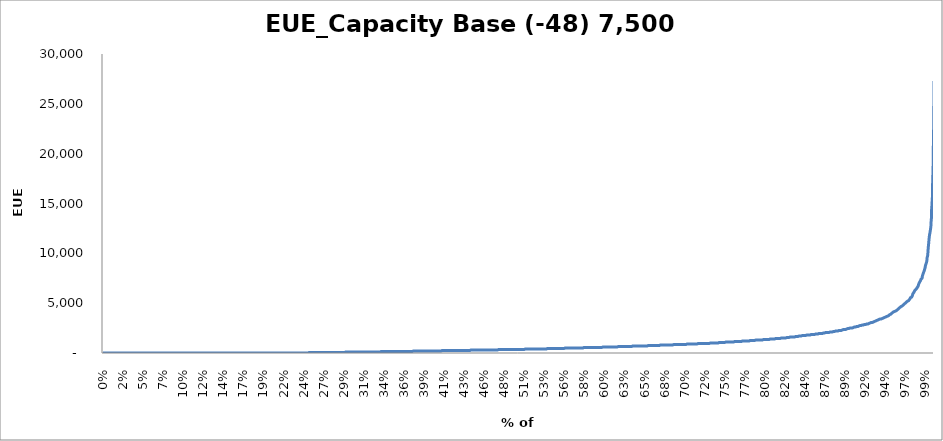
| Category | EUE_Capacity |
|---|---|
| 0.0 | 0 |
| 0.00013333333333333334 | 0 |
| 0.0002666666666666667 | 0 |
| 0.0004 | 0 |
| 0.0005333333333333334 | 0 |
| 0.0006666666666666666 | 0 |
| 0.0008 | 0 |
| 0.0009333333333333333 | 0 |
| 0.0010666666666666667 | 0 |
| 0.0012 | 0 |
| 0.0013333333333333333 | 0 |
| 0.0014666666666666667 | 0 |
| 0.0016 | 0 |
| 0.0017333333333333333 | 0 |
| 0.0018666666666666666 | 0 |
| 0.002 | 0 |
| 0.0021333333333333334 | 0 |
| 0.002266666666666667 | 0 |
| 0.0024 | 0 |
| 0.002533333333333333 | 0 |
| 0.0026666666666666666 | 0 |
| 0.0028 | 0 |
| 0.0029333333333333334 | 0 |
| 0.0030666666666666668 | 0 |
| 0.0032 | 0 |
| 0.0033333333333333335 | 0 |
| 0.0034666666666666665 | 0 |
| 0.0036 | 0 |
| 0.0037333333333333333 | 0 |
| 0.0038666666666666667 | 0 |
| 0.004 | 0 |
| 0.0041333333333333335 | 0 |
| 0.004266666666666667 | 0 |
| 0.0044 | 0 |
| 0.004533333333333334 | 0 |
| 0.004666666666666667 | 0 |
| 0.0048 | 0 |
| 0.004933333333333333 | 0 |
| 0.005066666666666666 | 0 |
| 0.0052 | 0 |
| 0.005333333333333333 | 0 |
| 0.0054666666666666665 | 0 |
| 0.0056 | 0 |
| 0.005733333333333333 | 0 |
| 0.005866666666666667 | 0 |
| 0.006 | 0 |
| 0.0061333333333333335 | 0 |
| 0.006266666666666667 | 0 |
| 0.0064 | 0 |
| 0.006533333333333334 | 0 |
| 0.006666666666666667 | 0 |
| 0.0068 | 0 |
| 0.006933333333333333 | 0 |
| 0.007066666666666666 | 0 |
| 0.0072 | 0 |
| 0.007333333333333333 | 0 |
| 0.007466666666666667 | 0 |
| 0.0076 | 0 |
| 0.007733333333333333 | 0 |
| 0.007866666666666666 | 0 |
| 0.008 | 0 |
| 0.008133333333333333 | 0 |
| 0.008266666666666667 | 0 |
| 0.0084 | 0 |
| 0.008533333333333334 | 0 |
| 0.008666666666666666 | 0 |
| 0.0088 | 0 |
| 0.008933333333333333 | 0 |
| 0.009066666666666667 | 0 |
| 0.0092 | 0 |
| 0.009333333333333334 | 0 |
| 0.009466666666666667 | 0 |
| 0.0096 | 0 |
| 0.009733333333333333 | 0 |
| 0.009866666666666666 | 0 |
| 0.01 | 0 |
| 0.010133333333333333 | 0 |
| 0.010266666666666667 | 0 |
| 0.0104 | 0 |
| 0.010533333333333334 | 0 |
| 0.010666666666666666 | 0 |
| 0.0108 | 0 |
| 0.010933333333333333 | 0 |
| 0.011066666666666667 | 0 |
| 0.0112 | 0 |
| 0.011333333333333334 | 0 |
| 0.011466666666666667 | 0 |
| 0.0116 | 0 |
| 0.011733333333333333 | 0 |
| 0.011866666666666666 | 0 |
| 0.012 | 0 |
| 0.012133333333333333 | 0 |
| 0.012266666666666667 | 0 |
| 0.0124 | 0 |
| 0.012533333333333334 | 0 |
| 0.012666666666666666 | 0 |
| 0.0128 | 0 |
| 0.012933333333333333 | 0 |
| 0.013066666666666667 | 0 |
| 0.0132 | 0 |
| 0.013333333333333334 | 0 |
| 0.013466666666666667 | 0 |
| 0.0136 | 0 |
| 0.013733333333333334 | 0 |
| 0.013866666666666666 | 0 |
| 0.014 | 0 |
| 0.014133333333333333 | 0 |
| 0.014266666666666667 | 0 |
| 0.0144 | 0 |
| 0.014533333333333334 | 0 |
| 0.014666666666666666 | 0 |
| 0.0148 | 0 |
| 0.014933333333333333 | 0 |
| 0.015066666666666667 | 0 |
| 0.0152 | 0 |
| 0.015333333333333332 | 0 |
| 0.015466666666666667 | 0 |
| 0.0156 | 0 |
| 0.015733333333333332 | 0 |
| 0.015866666666666668 | 0 |
| 0.016 | 0 |
| 0.016133333333333333 | 0 |
| 0.016266666666666665 | 0 |
| 0.0164 | 0 |
| 0.016533333333333334 | 0 |
| 0.016666666666666666 | 0 |
| 0.0168 | 0 |
| 0.016933333333333335 | 0 |
| 0.017066666666666667 | 0 |
| 0.0172 | 0 |
| 0.017333333333333333 | 0 |
| 0.017466666666666665 | 0 |
| 0.0176 | 0 |
| 0.017733333333333334 | 0 |
| 0.017866666666666666 | 0 |
| 0.018 | 0 |
| 0.018133333333333335 | 0 |
| 0.018266666666666667 | 0 |
| 0.0184 | 0 |
| 0.018533333333333332 | 0 |
| 0.018666666666666668 | 0 |
| 0.0188 | 0 |
| 0.018933333333333333 | 0 |
| 0.019066666666666666 | 0 |
| 0.0192 | 0 |
| 0.019333333333333334 | 0 |
| 0.019466666666666667 | 0 |
| 0.0196 | 0 |
| 0.019733333333333332 | 0 |
| 0.019866666666666668 | 0 |
| 0.02 | 0 |
| 0.020133333333333333 | 0 |
| 0.020266666666666665 | 0 |
| 0.0204 | 0 |
| 0.020533333333333334 | 0 |
| 0.020666666666666667 | 0 |
| 0.0208 | 0 |
| 0.020933333333333335 | 0 |
| 0.021066666666666668 | 0 |
| 0.0212 | 0 |
| 0.021333333333333333 | 0 |
| 0.021466666666666665 | 0 |
| 0.0216 | 0 |
| 0.021733333333333334 | 0 |
| 0.021866666666666666 | 0 |
| 0.022 | 0 |
| 0.022133333333333335 | 0 |
| 0.022266666666666667 | 0 |
| 0.0224 | 0 |
| 0.022533333333333332 | 0 |
| 0.02266666666666667 | 0 |
| 0.0228 | 0 |
| 0.022933333333333333 | 0 |
| 0.023066666666666666 | 0 |
| 0.0232 | 0 |
| 0.023333333333333334 | 0 |
| 0.023466666666666667 | 0 |
| 0.0236 | 0 |
| 0.023733333333333332 | 0 |
| 0.023866666666666668 | 0 |
| 0.024 | 0 |
| 0.024133333333333333 | 0 |
| 0.024266666666666666 | 0 |
| 0.0244 | 0 |
| 0.024533333333333334 | 0 |
| 0.024666666666666667 | 0 |
| 0.0248 | 0 |
| 0.02493333333333333 | 0 |
| 0.025066666666666668 | 0 |
| 0.0252 | 0 |
| 0.025333333333333333 | 0 |
| 0.025466666666666665 | 0 |
| 0.0256 | 0 |
| 0.025733333333333334 | 0 |
| 0.025866666666666666 | 0 |
| 0.026 | 0 |
| 0.026133333333333335 | 0 |
| 0.026266666666666667 | 0 |
| 0.0264 | 0 |
| 0.026533333333333332 | 0 |
| 0.02666666666666667 | 0 |
| 0.0268 | 0 |
| 0.026933333333333333 | 0 |
| 0.027066666666666666 | 0 |
| 0.0272 | 0 |
| 0.027333333333333334 | 0 |
| 0.027466666666666667 | 0 |
| 0.0276 | 0 |
| 0.027733333333333332 | 0 |
| 0.027866666666666668 | 0 |
| 0.028 | 0 |
| 0.028133333333333333 | 0 |
| 0.028266666666666666 | 0 |
| 0.0284 | 0 |
| 0.028533333333333334 | 0 |
| 0.028666666666666667 | 0 |
| 0.0288 | 0 |
| 0.028933333333333332 | 0 |
| 0.029066666666666668 | 0 |
| 0.0292 | 0 |
| 0.029333333333333333 | 0 |
| 0.029466666666666665 | 0 |
| 0.0296 | 0 |
| 0.029733333333333334 | 0 |
| 0.029866666666666666 | 0 |
| 0.03 | 0 |
| 0.030133333333333335 | 0 |
| 0.030266666666666667 | 0 |
| 0.0304 | 0 |
| 0.030533333333333332 | 0 |
| 0.030666666666666665 | 0 |
| 0.0308 | 0 |
| 0.030933333333333334 | 0 |
| 0.031066666666666666 | 0 |
| 0.0312 | 0 |
| 0.03133333333333333 | 0 |
| 0.031466666666666664 | 0 |
| 0.0316 | 0 |
| 0.031733333333333336 | 0 |
| 0.03186666666666667 | 0 |
| 0.032 | 0 |
| 0.03213333333333333 | 0 |
| 0.032266666666666666 | 0 |
| 0.0324 | 0 |
| 0.03253333333333333 | 0 |
| 0.03266666666666666 | 0 |
| 0.0328 | 0 |
| 0.032933333333333335 | 0 |
| 0.03306666666666667 | 0 |
| 0.0332 | 0 |
| 0.03333333333333333 | 0 |
| 0.033466666666666665 | 0 |
| 0.0336 | 0 |
| 0.03373333333333333 | 0 |
| 0.03386666666666667 | 0 |
| 0.034 | 0 |
| 0.034133333333333335 | 0 |
| 0.03426666666666667 | 0 |
| 0.0344 | 0 |
| 0.03453333333333333 | 0 |
| 0.034666666666666665 | 0 |
| 0.0348 | 0 |
| 0.03493333333333333 | 0 |
| 0.03506666666666667 | 0 |
| 0.0352 | 0 |
| 0.035333333333333335 | 0 |
| 0.03546666666666667 | 0 |
| 0.0356 | 0 |
| 0.03573333333333333 | 0 |
| 0.035866666666666665 | 0 |
| 0.036 | 0 |
| 0.03613333333333334 | 0 |
| 0.03626666666666667 | 0 |
| 0.0364 | 0 |
| 0.036533333333333334 | 0 |
| 0.03666666666666667 | 0 |
| 0.0368 | 0 |
| 0.03693333333333333 | 0 |
| 0.037066666666666664 | 0 |
| 0.0372 | 0 |
| 0.037333333333333336 | 0 |
| 0.03746666666666667 | 0 |
| 0.0376 | 0 |
| 0.037733333333333334 | 0 |
| 0.037866666666666667 | 0 |
| 0.038 | 0 |
| 0.03813333333333333 | 0 |
| 0.038266666666666664 | 0 |
| 0.0384 | 0 |
| 0.038533333333333336 | 0 |
| 0.03866666666666667 | 0 |
| 0.0388 | 0 |
| 0.038933333333333334 | 0 |
| 0.039066666666666666 | 0 |
| 0.0392 | 0 |
| 0.03933333333333333 | 0 |
| 0.039466666666666664 | 0 |
| 0.0396 | 0 |
| 0.039733333333333336 | 0 |
| 0.03986666666666667 | 0 |
| 0.04 | 0 |
| 0.04013333333333333 | 0 |
| 0.040266666666666666 | 0 |
| 0.0404 | 0 |
| 0.04053333333333333 | 0 |
| 0.04066666666666666 | 0 |
| 0.0408 | 0 |
| 0.040933333333333335 | 0 |
| 0.04106666666666667 | 0 |
| 0.0412 | 0 |
| 0.04133333333333333 | 0 |
| 0.041466666666666666 | 0 |
| 0.0416 | 0 |
| 0.04173333333333333 | 0 |
| 0.04186666666666667 | 0 |
| 0.042 | 0 |
| 0.042133333333333335 | 0 |
| 0.04226666666666667 | 0 |
| 0.0424 | 0 |
| 0.04253333333333333 | 0 |
| 0.042666666666666665 | 0 |
| 0.0428 | 0 |
| 0.04293333333333333 | 0 |
| 0.04306666666666667 | 0 |
| 0.0432 | 0 |
| 0.043333333333333335 | 0 |
| 0.04346666666666667 | 0 |
| 0.0436 | 0 |
| 0.04373333333333333 | 0 |
| 0.043866666666666665 | 0 |
| 0.044 | 0 |
| 0.04413333333333333 | 0 |
| 0.04426666666666667 | 0 |
| 0.0444 | 0 |
| 0.044533333333333334 | 0 |
| 0.04466666666666667 | 0 |
| 0.0448 | 0 |
| 0.04493333333333333 | 0 |
| 0.045066666666666665 | 0 |
| 0.0452 | 0 |
| 0.04533333333333334 | 0 |
| 0.04546666666666667 | 0 |
| 0.0456 | 0 |
| 0.045733333333333334 | 0 |
| 0.04586666666666667 | 0 |
| 0.046 | 0 |
| 0.04613333333333333 | 0 |
| 0.046266666666666664 | 0 |
| 0.0464 | 0 |
| 0.046533333333333336 | 0 |
| 0.04666666666666667 | 0 |
| 0.0468 | 0 |
| 0.046933333333333334 | 0 |
| 0.047066666666666666 | 0 |
| 0.0472 | 0 |
| 0.04733333333333333 | 0 |
| 0.047466666666666664 | 0 |
| 0.0476 | 0 |
| 0.047733333333333336 | 0 |
| 0.04786666666666667 | 0 |
| 0.048 | 0 |
| 0.048133333333333334 | 0 |
| 0.048266666666666666 | 0 |
| 0.0484 | 0 |
| 0.04853333333333333 | 0 |
| 0.048666666666666664 | 0 |
| 0.0488 | 0 |
| 0.048933333333333336 | 0 |
| 0.04906666666666667 | 0 |
| 0.0492 | 0 |
| 0.04933333333333333 | 0 |
| 0.049466666666666666 | 0 |
| 0.0496 | 0 |
| 0.04973333333333333 | 0 |
| 0.04986666666666666 | 0 |
| 0.05 | 0 |
| 0.050133333333333335 | 0 |
| 0.05026666666666667 | 0 |
| 0.0504 | 0 |
| 0.05053333333333333 | 0 |
| 0.050666666666666665 | 0 |
| 0.0508 | 0 |
| 0.05093333333333333 | 0 |
| 0.05106666666666667 | 0 |
| 0.0512 | 0 |
| 0.051333333333333335 | 0 |
| 0.05146666666666667 | 0 |
| 0.0516 | 0 |
| 0.05173333333333333 | 0 |
| 0.051866666666666665 | 0 |
| 0.052 | 0 |
| 0.05213333333333333 | 0 |
| 0.05226666666666667 | 0 |
| 0.0524 | 0 |
| 0.052533333333333335 | 0 |
| 0.05266666666666667 | 0 |
| 0.0528 | 0 |
| 0.05293333333333333 | 0 |
| 0.053066666666666665 | 0 |
| 0.0532 | 0 |
| 0.05333333333333334 | 0 |
| 0.05346666666666667 | 0 |
| 0.0536 | 0 |
| 0.053733333333333334 | 0 |
| 0.05386666666666667 | 0 |
| 0.054 | 0 |
| 0.05413333333333333 | 0 |
| 0.054266666666666664 | 0 |
| 0.0544 | 0 |
| 0.054533333333333336 | 0 |
| 0.05466666666666667 | 0 |
| 0.0548 | 0 |
| 0.054933333333333334 | 0 |
| 0.05506666666666667 | 0 |
| 0.0552 | 0 |
| 0.05533333333333333 | 0 |
| 0.055466666666666664 | 0 |
| 0.0556 | 0 |
| 0.055733333333333336 | 0 |
| 0.05586666666666667 | 0 |
| 0.056 | 0 |
| 0.056133333333333334 | 0 |
| 0.056266666666666666 | 0 |
| 0.0564 | 0 |
| 0.05653333333333333 | 0 |
| 0.056666666666666664 | 0 |
| 0.0568 | 0 |
| 0.056933333333333336 | 0 |
| 0.05706666666666667 | 0 |
| 0.0572 | 0 |
| 0.05733333333333333 | 0 |
| 0.057466666666666666 | 0 |
| 0.0576 | 0 |
| 0.05773333333333333 | 0 |
| 0.057866666666666663 | 0 |
| 0.058 | 0 |
| 0.058133333333333335 | 0 |
| 0.05826666666666667 | 0 |
| 0.0584 | 0 |
| 0.05853333333333333 | 0 |
| 0.058666666666666666 | 0 |
| 0.0588 | 0 |
| 0.05893333333333333 | 0 |
| 0.05906666666666667 | 0 |
| 0.0592 | 0 |
| 0.059333333333333335 | 0 |
| 0.05946666666666667 | 0 |
| 0.0596 | 0 |
| 0.05973333333333333 | 0 |
| 0.059866666666666665 | 0 |
| 0.06 | 0 |
| 0.06013333333333333 | 0 |
| 0.06026666666666667 | 0 |
| 0.0604 | 0 |
| 0.060533333333333335 | 0 |
| 0.06066666666666667 | 0 |
| 0.0608 | 0 |
| 0.06093333333333333 | 0 |
| 0.061066666666666665 | 0 |
| 0.0612 | 0 |
| 0.06133333333333333 | 0 |
| 0.06146666666666667 | 0 |
| 0.0616 | 0 |
| 0.061733333333333335 | 0 |
| 0.06186666666666667 | 0 |
| 0.062 | 0 |
| 0.06213333333333333 | 0 |
| 0.062266666666666665 | 0 |
| 0.0624 | 0 |
| 0.06253333333333333 | 0 |
| 0.06266666666666666 | 0 |
| 0.0628 | 0 |
| 0.06293333333333333 | 0 |
| 0.06306666666666666 | 0 |
| 0.0632 | 0 |
| 0.06333333333333334 | 0 |
| 0.06346666666666667 | 0 |
| 0.0636 | 0 |
| 0.06373333333333334 | 0 |
| 0.06386666666666667 | 0 |
| 0.064 | 0 |
| 0.06413333333333333 | 0 |
| 0.06426666666666667 | 0 |
| 0.0644 | 0 |
| 0.06453333333333333 | 0 |
| 0.06466666666666666 | 0 |
| 0.0648 | 0 |
| 0.06493333333333333 | 0 |
| 0.06506666666666666 | 0 |
| 0.0652 | 0 |
| 0.06533333333333333 | 0 |
| 0.06546666666666667 | 0 |
| 0.0656 | 0 |
| 0.06573333333333334 | 0 |
| 0.06586666666666667 | 0 |
| 0.066 | 0 |
| 0.06613333333333334 | 0 |
| 0.06626666666666667 | 0 |
| 0.0664 | 0 |
| 0.06653333333333333 | 0 |
| 0.06666666666666667 | 0 |
| 0.0668 | 0 |
| 0.06693333333333333 | 0 |
| 0.06706666666666666 | 0 |
| 0.0672 | 0 |
| 0.06733333333333333 | 0 |
| 0.06746666666666666 | 0 |
| 0.0676 | 0 |
| 0.06773333333333334 | 0 |
| 0.06786666666666667 | 0 |
| 0.068 | 0 |
| 0.06813333333333334 | 0 |
| 0.06826666666666667 | 0 |
| 0.0684 | 0 |
| 0.06853333333333333 | 0 |
| 0.06866666666666667 | 0 |
| 0.0688 | 0 |
| 0.06893333333333333 | 0 |
| 0.06906666666666667 | 0 |
| 0.0692 | 0 |
| 0.06933333333333333 | 0 |
| 0.06946666666666666 | 0 |
| 0.0696 | 0 |
| 0.06973333333333333 | 0 |
| 0.06986666666666666 | 0 |
| 0.07 | 0 |
| 0.07013333333333334 | 0 |
| 0.07026666666666667 | 0 |
| 0.0704 | 0 |
| 0.07053333333333334 | 0 |
| 0.07066666666666667 | 0 |
| 0.0708 | 0 |
| 0.07093333333333333 | 0 |
| 0.07106666666666667 | 0 |
| 0.0712 | 0 |
| 0.07133333333333333 | 0 |
| 0.07146666666666666 | 0 |
| 0.0716 | 0 |
| 0.07173333333333333 | 0 |
| 0.07186666666666666 | 0 |
| 0.072 | 0 |
| 0.07213333333333333 | 0 |
| 0.07226666666666667 | 0 |
| 0.0724 | 0 |
| 0.07253333333333334 | 0 |
| 0.07266666666666667 | 0 |
| 0.0728 | 0 |
| 0.07293333333333334 | 0 |
| 0.07306666666666667 | 0 |
| 0.0732 | 0 |
| 0.07333333333333333 | 0 |
| 0.07346666666666667 | 0 |
| 0.0736 | 0 |
| 0.07373333333333333 | 0 |
| 0.07386666666666666 | 0 |
| 0.074 | 0 |
| 0.07413333333333333 | 0 |
| 0.07426666666666666 | 0 |
| 0.0744 | 0 |
| 0.07453333333333333 | 0 |
| 0.07466666666666667 | 0 |
| 0.0748 | 0 |
| 0.07493333333333334 | 0 |
| 0.07506666666666667 | 0 |
| 0.0752 | 0 |
| 0.07533333333333334 | 0 |
| 0.07546666666666667 | 0 |
| 0.0756 | 0 |
| 0.07573333333333333 | 0 |
| 0.07586666666666667 | 0 |
| 0.076 | 0 |
| 0.07613333333333333 | 0 |
| 0.07626666666666666 | 0 |
| 0.0764 | 0 |
| 0.07653333333333333 | 0 |
| 0.07666666666666666 | 0 |
| 0.0768 | 0 |
| 0.07693333333333334 | 0 |
| 0.07706666666666667 | 0 |
| 0.0772 | 0 |
| 0.07733333333333334 | 0 |
| 0.07746666666666667 | 0 |
| 0.0776 | 0 |
| 0.07773333333333333 | 0 |
| 0.07786666666666667 | 0 |
| 0.078 | 0 |
| 0.07813333333333333 | 0 |
| 0.07826666666666666 | 0 |
| 0.0784 | 0 |
| 0.07853333333333333 | 0 |
| 0.07866666666666666 | 0 |
| 0.0788 | 0 |
| 0.07893333333333333 | 0 |
| 0.07906666666666666 | 0 |
| 0.0792 | 0 |
| 0.07933333333333334 | 0 |
| 0.07946666666666667 | 0 |
| 0.0796 | 0 |
| 0.07973333333333334 | 0 |
| 0.07986666666666667 | 0 |
| 0.08 | 0 |
| 0.08013333333333333 | 0 |
| 0.08026666666666667 | 0 |
| 0.0804 | 0 |
| 0.08053333333333333 | 0 |
| 0.08066666666666666 | 0 |
| 0.0808 | 0 |
| 0.08093333333333333 | 0 |
| 0.08106666666666666 | 0 |
| 0.0812 | 0 |
| 0.08133333333333333 | 0 |
| 0.08146666666666667 | 0 |
| 0.0816 | 0 |
| 0.08173333333333334 | 0 |
| 0.08186666666666667 | 0 |
| 0.082 | 0 |
| 0.08213333333333334 | 0 |
| 0.08226666666666667 | 0 |
| 0.0824 | 0 |
| 0.08253333333333333 | 0 |
| 0.08266666666666667 | 0 |
| 0.0828 | 0 |
| 0.08293333333333333 | 0 |
| 0.08306666666666666 | 0 |
| 0.0832 | 0 |
| 0.08333333333333333 | 0 |
| 0.08346666666666666 | 0 |
| 0.0836 | 0 |
| 0.08373333333333334 | 0 |
| 0.08386666666666667 | 0 |
| 0.084 | 0 |
| 0.08413333333333334 | 0 |
| 0.08426666666666667 | 0 |
| 0.0844 | 0 |
| 0.08453333333333334 | 0 |
| 0.08466666666666667 | 0 |
| 0.0848 | 0 |
| 0.08493333333333333 | 0 |
| 0.08506666666666667 | 0 |
| 0.0852 | 0 |
| 0.08533333333333333 | 0 |
| 0.08546666666666666 | 0 |
| 0.0856 | 0 |
| 0.08573333333333333 | 0 |
| 0.08586666666666666 | 0 |
| 0.086 | 0 |
| 0.08613333333333334 | 0 |
| 0.08626666666666667 | 0 |
| 0.0864 | 0 |
| 0.08653333333333334 | 0 |
| 0.08666666666666667 | 0 |
| 0.0868 | 0 |
| 0.08693333333333333 | 0 |
| 0.08706666666666667 | 0 |
| 0.0872 | 0 |
| 0.08733333333333333 | 0 |
| 0.08746666666666666 | 0 |
| 0.0876 | 0 |
| 0.08773333333333333 | 0 |
| 0.08786666666666666 | 0 |
| 0.088 | 0 |
| 0.08813333333333333 | 0 |
| 0.08826666666666666 | 0 |
| 0.0884 | 0 |
| 0.08853333333333334 | 0 |
| 0.08866666666666667 | 0 |
| 0.0888 | 0 |
| 0.08893333333333334 | 0 |
| 0.08906666666666667 | 0 |
| 0.0892 | 0 |
| 0.08933333333333333 | 0 |
| 0.08946666666666667 | 0 |
| 0.0896 | 0 |
| 0.08973333333333333 | 0 |
| 0.08986666666666666 | 0 |
| 0.09 | 0 |
| 0.09013333333333333 | 0 |
| 0.09026666666666666 | 0 |
| 0.0904 | 0 |
| 0.09053333333333333 | 0 |
| 0.09066666666666667 | 0 |
| 0.0908 | 0 |
| 0.09093333333333334 | 0 |
| 0.09106666666666667 | 0 |
| 0.0912 | 0 |
| 0.09133333333333334 | 0 |
| 0.09146666666666667 | 0 |
| 0.0916 | 0 |
| 0.09173333333333333 | 0 |
| 0.09186666666666667 | 0 |
| 0.092 | 0 |
| 0.09213333333333333 | 0 |
| 0.09226666666666666 | 0 |
| 0.0924 | 0 |
| 0.09253333333333333 | 0 |
| 0.09266666666666666 | 0 |
| 0.0928 | 0 |
| 0.09293333333333334 | 0 |
| 0.09306666666666667 | 0 |
| 0.0932 | 0 |
| 0.09333333333333334 | 0 |
| 0.09346666666666667 | 0 |
| 0.0936 | 0 |
| 0.09373333333333334 | 0 |
| 0.09386666666666667 | 0 |
| 0.094 | 0 |
| 0.09413333333333333 | 0 |
| 0.09426666666666667 | 0 |
| 0.0944 | 0 |
| 0.09453333333333333 | 0 |
| 0.09466666666666666 | 0 |
| 0.0948 | 0 |
| 0.09493333333333333 | 0 |
| 0.09506666666666666 | 0 |
| 0.0952 | 0 |
| 0.09533333333333334 | 0 |
| 0.09546666666666667 | 0 |
| 0.0956 | 0 |
| 0.09573333333333334 | 0 |
| 0.09586666666666667 | 0 |
| 0.096 | 0 |
| 0.09613333333333333 | 0 |
| 0.09626666666666667 | 0 |
| 0.0964 | 0 |
| 0.09653333333333333 | 0 |
| 0.09666666666666666 | 0 |
| 0.0968 | 0 |
| 0.09693333333333333 | 0 |
| 0.09706666666666666 | 0 |
| 0.0972 | 0 |
| 0.09733333333333333 | 0 |
| 0.09746666666666666 | 0 |
| 0.0976 | 0 |
| 0.09773333333333334 | 0 |
| 0.09786666666666667 | 0 |
| 0.098 | 0 |
| 0.09813333333333334 | 0 |
| 0.09826666666666667 | 0 |
| 0.0984 | 0 |
| 0.09853333333333333 | 0 |
| 0.09866666666666667 | 0 |
| 0.0988 | 0 |
| 0.09893333333333333 | 0 |
| 0.09906666666666666 | 0 |
| 0.0992 | 0 |
| 0.09933333333333333 | 0 |
| 0.09946666666666666 | 0 |
| 0.0996 | 0 |
| 0.09973333333333333 | 0 |
| 0.09986666666666667 | 0 |
| 0.1 | 0 |
| 0.10013333333333334 | 0 |
| 0.10026666666666667 | 0 |
| 0.1004 | 0 |
| 0.10053333333333334 | 0 |
| 0.10066666666666667 | 0 |
| 0.1008 | 0 |
| 0.10093333333333333 | 0 |
| 0.10106666666666667 | 0 |
| 0.1012 | 0 |
| 0.10133333333333333 | 0 |
| 0.10146666666666666 | 0 |
| 0.1016 | 0 |
| 0.10173333333333333 | 0 |
| 0.10186666666666666 | 0 |
| 0.102 | 0 |
| 0.10213333333333334 | 0 |
| 0.10226666666666667 | 0 |
| 0.1024 | 0 |
| 0.10253333333333334 | 0 |
| 0.10266666666666667 | 0 |
| 0.1028 | 0 |
| 0.10293333333333334 | 0 |
| 0.10306666666666667 | 0 |
| 0.1032 | 0 |
| 0.10333333333333333 | 0 |
| 0.10346666666666667 | 0 |
| 0.1036 | 0 |
| 0.10373333333333333 | 0 |
| 0.10386666666666666 | 0 |
| 0.104 | 0 |
| 0.10413333333333333 | 0 |
| 0.10426666666666666 | 0 |
| 0.1044 | 0 |
| 0.10453333333333334 | 0 |
| 0.10466666666666667 | 0 |
| 0.1048 | 0 |
| 0.10493333333333334 | 0 |
| 0.10506666666666667 | 0 |
| 0.1052 | 0 |
| 0.10533333333333333 | 0 |
| 0.10546666666666667 | 0 |
| 0.1056 | 0 |
| 0.10573333333333333 | 0 |
| 0.10586666666666666 | 0 |
| 0.106 | 0 |
| 0.10613333333333333 | 0 |
| 0.10626666666666666 | 0 |
| 0.1064 | 0 |
| 0.10653333333333333 | 0 |
| 0.10666666666666667 | 0 |
| 0.1068 | 0 |
| 0.10693333333333334 | 0 |
| 0.10706666666666667 | 0 |
| 0.1072 | 0 |
| 0.10733333333333334 | 0 |
| 0.10746666666666667 | 0 |
| 0.1076 | 0 |
| 0.10773333333333333 | 0 |
| 0.10786666666666667 | 0 |
| 0.108 | 0 |
| 0.10813333333333333 | 0 |
| 0.10826666666666666 | 0 |
| 0.1084 | 0 |
| 0.10853333333333333 | 0 |
| 0.10866666666666666 | 0 |
| 0.1088 | 0 |
| 0.10893333333333333 | 0 |
| 0.10906666666666667 | 0 |
| 0.1092 | 0 |
| 0.10933333333333334 | 0 |
| 0.10946666666666667 | 0 |
| 0.1096 | 0 |
| 0.10973333333333334 | 0 |
| 0.10986666666666667 | 0 |
| 0.11 | 0 |
| 0.11013333333333333 | 0 |
| 0.11026666666666667 | 0 |
| 0.1104 | 0 |
| 0.11053333333333333 | 0 |
| 0.11066666666666666 | 0 |
| 0.1108 | 0 |
| 0.11093333333333333 | 0 |
| 0.11106666666666666 | 0 |
| 0.1112 | 0 |
| 0.11133333333333334 | 0 |
| 0.11146666666666667 | 0 |
| 0.1116 | 0 |
| 0.11173333333333334 | 0 |
| 0.11186666666666667 | 0 |
| 0.112 | 0 |
| 0.11213333333333333 | 0 |
| 0.11226666666666667 | 0 |
| 0.1124 | 0 |
| 0.11253333333333333 | 0 |
| 0.11266666666666666 | 0 |
| 0.1128 | 0 |
| 0.11293333333333333 | 0 |
| 0.11306666666666666 | 0 |
| 0.1132 | 0 |
| 0.11333333333333333 | 0 |
| 0.11346666666666666 | 0 |
| 0.1136 | 0 |
| 0.11373333333333334 | 0 |
| 0.11386666666666667 | 0 |
| 0.114 | 0 |
| 0.11413333333333334 | 0 |
| 0.11426666666666667 | 0 |
| 0.1144 | 0 |
| 0.11453333333333333 | 0 |
| 0.11466666666666667 | 0 |
| 0.1148 | 0 |
| 0.11493333333333333 | 0 |
| 0.11506666666666666 | 0 |
| 0.1152 | 0 |
| 0.11533333333333333 | 0 |
| 0.11546666666666666 | 0 |
| 0.1156 | 0 |
| 0.11573333333333333 | 0 |
| 0.11586666666666667 | 0 |
| 0.116 | 0 |
| 0.11613333333333334 | 0 |
| 0.11626666666666667 | 0 |
| 0.1164 | 0 |
| 0.11653333333333334 | 0 |
| 0.11666666666666667 | 0 |
| 0.1168 | 0 |
| 0.11693333333333333 | 0 |
| 0.11706666666666667 | 0 |
| 0.1172 | 0 |
| 0.11733333333333333 | 0 |
| 0.11746666666666666 | 0 |
| 0.1176 | 0 |
| 0.11773333333333333 | 0 |
| 0.11786666666666666 | 0 |
| 0.118 | 0 |
| 0.11813333333333334 | 0 |
| 0.11826666666666667 | 0 |
| 0.1184 | 0 |
| 0.11853333333333334 | 0 |
| 0.11866666666666667 | 0 |
| 0.1188 | 0 |
| 0.11893333333333334 | 0 |
| 0.11906666666666667 | 0 |
| 0.1192 | 0 |
| 0.11933333333333333 | 0 |
| 0.11946666666666667 | 0 |
| 0.1196 | 0 |
| 0.11973333333333333 | 0 |
| 0.11986666666666666 | 0 |
| 0.12 | 0 |
| 0.12013333333333333 | 0 |
| 0.12026666666666666 | 0 |
| 0.1204 | 0 |
| 0.12053333333333334 | 0 |
| 0.12066666666666667 | 0 |
| 0.1208 | 0 |
| 0.12093333333333334 | 0 |
| 0.12106666666666667 | 0 |
| 0.1212 | 0 |
| 0.12133333333333333 | 0 |
| 0.12146666666666667 | 0 |
| 0.1216 | 0 |
| 0.12173333333333333 | 0 |
| 0.12186666666666666 | 0 |
| 0.122 | 0 |
| 0.12213333333333333 | 0 |
| 0.12226666666666666 | 0 |
| 0.1224 | 0 |
| 0.12253333333333333 | 0 |
| 0.12266666666666666 | 0 |
| 0.1228 | 0 |
| 0.12293333333333334 | 0 |
| 0.12306666666666667 | 0 |
| 0.1232 | 0 |
| 0.12333333333333334 | 0 |
| 0.12346666666666667 | 0 |
| 0.1236 | 0 |
| 0.12373333333333333 | 0 |
| 0.12386666666666667 | 0 |
| 0.124 | 0 |
| 0.12413333333333333 | 0 |
| 0.12426666666666666 | 0 |
| 0.1244 | 0 |
| 0.12453333333333333 | 0 |
| 0.12466666666666666 | 0 |
| 0.1248 | 0 |
| 0.12493333333333333 | 0 |
| 0.12506666666666666 | 0 |
| 0.1252 | 0 |
| 0.12533333333333332 | 0 |
| 0.12546666666666667 | 0 |
| 0.1256 | 0 |
| 0.12573333333333334 | 0 |
| 0.12586666666666665 | 0 |
| 0.126 | 0 |
| 0.12613333333333332 | 0 |
| 0.12626666666666667 | 0 |
| 0.1264 | 0 |
| 0.12653333333333333 | 0 |
| 0.12666666666666668 | 0 |
| 0.1268 | 0 |
| 0.12693333333333334 | 0 |
| 0.12706666666666666 | 0 |
| 0.1272 | 0 |
| 0.12733333333333333 | 0 |
| 0.12746666666666667 | 0 |
| 0.1276 | 0 |
| 0.12773333333333334 | 0 |
| 0.12786666666666666 | 0 |
| 0.128 | 0 |
| 0.12813333333333332 | 0 |
| 0.12826666666666667 | 0 |
| 0.1284 | 0 |
| 0.12853333333333333 | 0 |
| 0.12866666666666668 | 0 |
| 0.1288 | 0 |
| 0.12893333333333334 | 0 |
| 0.12906666666666666 | 0 |
| 0.1292 | 0 |
| 0.12933333333333333 | 0 |
| 0.12946666666666667 | 0 |
| 0.1296 | 0 |
| 0.12973333333333334 | 0 |
| 0.12986666666666666 | 0 |
| 0.13 | 0 |
| 0.13013333333333332 | 0 |
| 0.13026666666666667 | 0 |
| 0.1304 | 0 |
| 0.13053333333333333 | 0 |
| 0.13066666666666665 | 0 |
| 0.1308 | 0 |
| 0.13093333333333335 | 0 |
| 0.13106666666666666 | 0 |
| 0.1312 | 0 |
| 0.13133333333333333 | 0 |
| 0.13146666666666668 | 0 |
| 0.1316 | 0 |
| 0.13173333333333334 | 0 |
| 0.13186666666666666 | 0 |
| 0.132 | 0 |
| 0.13213333333333332 | 0 |
| 0.13226666666666667 | 0 |
| 0.1324 | 0 |
| 0.13253333333333334 | 0 |
| 0.13266666666666665 | 0 |
| 0.1328 | 0 |
| 0.13293333333333332 | 0 |
| 0.13306666666666667 | 0 |
| 0.1332 | 0 |
| 0.13333333333333333 | 0 |
| 0.13346666666666668 | 0 |
| 0.1336 | 0 |
| 0.13373333333333334 | 0 |
| 0.13386666666666666 | 0 |
| 0.134 | 0 |
| 0.13413333333333333 | 0 |
| 0.13426666666666667 | 0 |
| 0.1344 | 0 |
| 0.13453333333333334 | 0 |
| 0.13466666666666666 | 0 |
| 0.1348 | 0 |
| 0.13493333333333332 | 0 |
| 0.13506666666666667 | 0 |
| 0.1352 | 0 |
| 0.13533333333333333 | 0 |
| 0.13546666666666668 | 0 |
| 0.1356 | 0 |
| 0.13573333333333334 | 0 |
| 0.13586666666666666 | 0 |
| 0.136 | 0 |
| 0.13613333333333333 | 0 |
| 0.13626666666666667 | 0 |
| 0.1364 | 0 |
| 0.13653333333333334 | 0 |
| 0.13666666666666666 | 0 |
| 0.1368 | 0 |
| 0.13693333333333332 | 0 |
| 0.13706666666666667 | 0 |
| 0.1372 | 0 |
| 0.13733333333333334 | 0 |
| 0.13746666666666665 | 0 |
| 0.1376 | 0 |
| 0.13773333333333335 | 0 |
| 0.13786666666666667 | 0 |
| 0.138 | 0 |
| 0.13813333333333333 | 0 |
| 0.13826666666666668 | 0 |
| 0.1384 | 0 |
| 0.13853333333333334 | 0 |
| 0.13866666666666666 | 0 |
| 0.1388 | 0 |
| 0.13893333333333333 | 0 |
| 0.13906666666666667 | 0 |
| 0.1392 | 0 |
| 0.13933333333333334 | 0 |
| 0.13946666666666666 | 0 |
| 0.1396 | 0 |
| 0.13973333333333332 | 0 |
| 0.13986666666666667 | 0 |
| 0.14 | 0 |
| 0.14013333333333333 | 0 |
| 0.14026666666666668 | 0 |
| 0.1404 | 0 |
| 0.14053333333333334 | 0 |
| 0.14066666666666666 | 0 |
| 0.1408 | 0 |
| 0.14093333333333333 | 0 |
| 0.14106666666666667 | 0 |
| 0.1412 | 0 |
| 0.14133333333333334 | 0 |
| 0.14146666666666666 | 0 |
| 0.1416 | 0 |
| 0.14173333333333332 | 0 |
| 0.14186666666666667 | 0 |
| 0.142 | 0 |
| 0.14213333333333333 | 0 |
| 0.14226666666666668 | 0 |
| 0.1424 | 0 |
| 0.14253333333333335 | 0 |
| 0.14266666666666666 | 0 |
| 0.1428 | 0 |
| 0.14293333333333333 | 0 |
| 0.14306666666666668 | 0 |
| 0.1432 | 0 |
| 0.14333333333333334 | 0 |
| 0.14346666666666666 | 0 |
| 0.1436 | 0 |
| 0.14373333333333332 | 0 |
| 0.14386666666666667 | 0 |
| 0.144 | 0 |
| 0.14413333333333334 | 0 |
| 0.14426666666666665 | 0 |
| 0.1444 | 0 |
| 0.14453333333333335 | 0 |
| 0.14466666666666667 | 0 |
| 0.1448 | 0 |
| 0.14493333333333333 | 0 |
| 0.14506666666666668 | 0 |
| 0.1452 | 0 |
| 0.14533333333333334 | 0 |
| 0.14546666666666666 | 0 |
| 0.1456 | 0 |
| 0.14573333333333333 | 0 |
| 0.14586666666666667 | 0 |
| 0.146 | 0 |
| 0.14613333333333334 | 0 |
| 0.14626666666666666 | 0 |
| 0.1464 | 0 |
| 0.14653333333333332 | 0 |
| 0.14666666666666667 | 0 |
| 0.1468 | 0 |
| 0.14693333333333333 | 0 |
| 0.14706666666666668 | 0 |
| 0.1472 | 0 |
| 0.14733333333333334 | 0 |
| 0.14746666666666666 | 0 |
| 0.1476 | 0 |
| 0.14773333333333333 | 0 |
| 0.14786666666666667 | 0 |
| 0.148 | 0 |
| 0.14813333333333334 | 0 |
| 0.14826666666666666 | 0 |
| 0.1484 | 0 |
| 0.14853333333333332 | 0 |
| 0.14866666666666667 | 0 |
| 0.1488 | 0 |
| 0.14893333333333333 | 0 |
| 0.14906666666666665 | 0 |
| 0.1492 | 0 |
| 0.14933333333333335 | 0 |
| 0.14946666666666666 | 0 |
| 0.1496 | 0 |
| 0.14973333333333333 | 0 |
| 0.14986666666666668 | 0 |
| 0.15 | 0 |
| 0.15013333333333334 | 0 |
| 0.15026666666666666 | 0 |
| 0.1504 | 0 |
| 0.15053333333333332 | 0 |
| 0.15066666666666667 | 0 |
| 0.1508 | 0 |
| 0.15093333333333334 | 0 |
| 0.15106666666666665 | 0 |
| 0.1512 | 0 |
| 0.15133333333333332 | 0 |
| 0.15146666666666667 | 0 |
| 0.1516 | 0 |
| 0.15173333333333333 | 0 |
| 0.15186666666666668 | 0 |
| 0.152 | 0 |
| 0.15213333333333334 | 0 |
| 0.15226666666666666 | 0 |
| 0.1524 | 0 |
| 0.15253333333333333 | 0 |
| 0.15266666666666667 | 0 |
| 0.1528 | 0 |
| 0.15293333333333334 | 0 |
| 0.15306666666666666 | 0 |
| 0.1532 | 0 |
| 0.15333333333333332 | 0 |
| 0.15346666666666667 | 0 |
| 0.1536 | 0 |
| 0.15373333333333333 | 0 |
| 0.15386666666666668 | 0 |
| 0.154 | 0 |
| 0.15413333333333334 | 0 |
| 0.15426666666666666 | 0 |
| 0.1544 | 0 |
| 0.15453333333333333 | 0 |
| 0.15466666666666667 | 0 |
| 0.1548 | 0 |
| 0.15493333333333334 | 0 |
| 0.15506666666666666 | 0 |
| 0.1552 | 0 |
| 0.15533333333333332 | 0 |
| 0.15546666666666667 | 0 |
| 0.1556 | 0 |
| 0.15573333333333333 | 0 |
| 0.15586666666666665 | 0 |
| 0.156 | 0 |
| 0.15613333333333335 | 0 |
| 0.15626666666666666 | 0 |
| 0.1564 | 0 |
| 0.15653333333333333 | 0 |
| 0.15666666666666668 | 0 |
| 0.1568 | 0 |
| 0.15693333333333334 | 0 |
| 0.15706666666666666 | 0 |
| 0.1572 | 0 |
| 0.15733333333333333 | 0 |
| 0.15746666666666667 | 0 |
| 0.1576 | 0 |
| 0.15773333333333334 | 0 |
| 0.15786666666666666 | 0 |
| 0.158 | 0 |
| 0.15813333333333332 | 0 |
| 0.15826666666666667 | 0 |
| 0.1584 | 0 |
| 0.15853333333333333 | 0 |
| 0.15866666666666668 | 0 |
| 0.1588 | 0 |
| 0.15893333333333334 | 0 |
| 0.15906666666666666 | 0 |
| 0.1592 | 0 |
| 0.15933333333333333 | 0 |
| 0.15946666666666667 | 0 |
| 0.1596 | 0 |
| 0.15973333333333334 | 0 |
| 0.15986666666666666 | 0 |
| 0.16 | 0 |
| 0.16013333333333332 | 0 |
| 0.16026666666666667 | 0 |
| 0.1604 | 0 |
| 0.16053333333333333 | 0 |
| 0.16066666666666668 | 0 |
| 0.1608 | 0 |
| 0.16093333333333334 | 0 |
| 0.16106666666666666 | 0 |
| 0.1612 | 0 |
| 0.16133333333333333 | 0 |
| 0.16146666666666668 | 0 |
| 0.1616 | 0 |
| 0.16173333333333334 | 0 |
| 0.16186666666666666 | 0 |
| 0.162 | 0 |
| 0.16213333333333332 | 0 |
| 0.16226666666666667 | 0 |
| 0.1624 | 0 |
| 0.16253333333333334 | 0 |
| 0.16266666666666665 | 0 |
| 0.1628 | 0 |
| 0.16293333333333335 | 0 |
| 0.16306666666666667 | 0 |
| 0.1632 | 0 |
| 0.16333333333333333 | 0 |
| 0.16346666666666668 | 0 |
| 0.1636 | 0 |
| 0.16373333333333334 | 0 |
| 0.16386666666666666 | 0 |
| 0.164 | 0 |
| 0.16413333333333333 | 0 |
| 0.16426666666666667 | 0 |
| 0.1644 | 0 |
| 0.16453333333333334 | 0 |
| 0.16466666666666666 | 0 |
| 0.1648 | 0 |
| 0.16493333333333332 | 0 |
| 0.16506666666666667 | 0 |
| 0.1652 | 0 |
| 0.16533333333333333 | 0 |
| 0.16546666666666668 | 0 |
| 0.1656 | 0 |
| 0.16573333333333334 | 0 |
| 0.16586666666666666 | 0 |
| 0.166 | 0 |
| 0.16613333333333333 | 0 |
| 0.16626666666666667 | 0 |
| 0.1664 | 0 |
| 0.16653333333333334 | 0 |
| 0.16666666666666666 | 0 |
| 0.1668 | 0 |
| 0.16693333333333332 | 0 |
| 0.16706666666666667 | 0 |
| 0.1672 | 0 |
| 0.16733333333333333 | 0 |
| 0.16746666666666668 | 0 |
| 0.1676 | 0 |
| 0.16773333333333335 | 0 |
| 0.16786666666666666 | 0 |
| 0.168 | 0 |
| 0.16813333333333333 | 0 |
| 0.16826666666666668 | 0 |
| 0.1684 | 0 |
| 0.16853333333333334 | 0 |
| 0.16866666666666666 | 0 |
| 0.1688 | 0 |
| 0.16893333333333332 | 0 |
| 0.16906666666666667 | 0 |
| 0.1692 | 0 |
| 0.16933333333333334 | 0 |
| 0.16946666666666665 | 0 |
| 0.1696 | 0 |
| 0.16973333333333335 | 0 |
| 0.16986666666666667 | 0 |
| 0.17 | 0 |
| 0.17013333333333333 | 0 |
| 0.17026666666666668 | 0 |
| 0.1704 | 0 |
| 0.17053333333333334 | 0 |
| 0.17066666666666666 | 0 |
| 0.1708 | 0 |
| 0.17093333333333333 | 0 |
| 0.17106666666666667 | 0 |
| 0.1712 | 0 |
| 0.17133333333333334 | 0 |
| 0.17146666666666666 | 0 |
| 0.1716 | 0 |
| 0.17173333333333332 | 0 |
| 0.17186666666666667 | 0 |
| 0.172 | 0 |
| 0.17213333333333333 | 0 |
| 0.17226666666666668 | 0 |
| 0.1724 | 0 |
| 0.17253333333333334 | 0 |
| 0.17266666666666666 | 0 |
| 0.1728 | 0 |
| 0.17293333333333333 | 0 |
| 0.17306666666666667 | 0 |
| 0.1732 | 0 |
| 0.17333333333333334 | 0 |
| 0.17346666666666666 | 0 |
| 0.1736 | 0 |
| 0.17373333333333332 | 0 |
| 0.17386666666666667 | 0 |
| 0.174 | 0 |
| 0.17413333333333333 | 0 |
| 0.17426666666666665 | 0 |
| 0.1744 | 0 |
| 0.17453333333333335 | 0 |
| 0.17466666666666666 | 0 |
| 0.1748 | 0 |
| 0.17493333333333333 | 0 |
| 0.17506666666666668 | 0 |
| 0.1752 | 0 |
| 0.17533333333333334 | 0 |
| 0.17546666666666666 | 0 |
| 0.1756 | 0 |
| 0.17573333333333332 | 0 |
| 0.17586666666666667 | 0 |
| 0.176 | 0 |
| 0.17613333333333334 | 0 |
| 0.17626666666666665 | 0 |
| 0.1764 | 0 |
| 0.17653333333333332 | 0 |
| 0.17666666666666667 | 0 |
| 0.1768 | 0 |
| 0.17693333333333333 | 0 |
| 0.17706666666666668 | 0 |
| 0.1772 | 0 |
| 0.17733333333333334 | 0 |
| 0.17746666666666666 | 0 |
| 0.1776 | 0 |
| 0.17773333333333333 | 0 |
| 0.17786666666666667 | 0 |
| 0.178 | 0 |
| 0.17813333333333334 | 0 |
| 0.17826666666666666 | 0 |
| 0.1784 | 0 |
| 0.17853333333333332 | 0 |
| 0.17866666666666667 | 0 |
| 0.1788 | 0 |
| 0.17893333333333333 | 0 |
| 0.17906666666666668 | 0 |
| 0.1792 | 0 |
| 0.17933333333333334 | 0 |
| 0.17946666666666666 | 0 |
| 0.1796 | 0 |
| 0.17973333333333333 | 0 |
| 0.17986666666666667 | 0 |
| 0.18 | 0 |
| 0.18013333333333334 | 0 |
| 0.18026666666666666 | 0 |
| 0.1804 | 0 |
| 0.18053333333333332 | 0 |
| 0.18066666666666667 | 0 |
| 0.1808 | 0 |
| 0.18093333333333333 | 0 |
| 0.18106666666666665 | 0 |
| 0.1812 | 0 |
| 0.18133333333333335 | 0 |
| 0.18146666666666667 | 0 |
| 0.1816 | 0 |
| 0.18173333333333333 | 0 |
| 0.18186666666666668 | 0 |
| 0.182 | 0 |
| 0.18213333333333334 | 0 |
| 0.18226666666666666 | 0 |
| 0.1824 | 0 |
| 0.18253333333333333 | 0 |
| 0.18266666666666667 | 0 |
| 0.1828 | 0 |
| 0.18293333333333334 | 0 |
| 0.18306666666666666 | 0 |
| 0.1832 | 0 |
| 0.18333333333333332 | 0 |
| 0.18346666666666667 | 0 |
| 0.1836 | 0 |
| 0.18373333333333333 | 0 |
| 0.18386666666666668 | 0 |
| 0.184 | 0 |
| 0.18413333333333334 | 0 |
| 0.18426666666666666 | 0 |
| 0.1844 | 0 |
| 0.18453333333333333 | 0 |
| 0.18466666666666667 | 0 |
| 0.1848 | 0 |
| 0.18493333333333334 | 0 |
| 0.18506666666666666 | 0 |
| 0.1852 | 0 |
| 0.18533333333333332 | 0 |
| 0.18546666666666667 | 0 |
| 0.1856 | 0 |
| 0.18573333333333333 | 0 |
| 0.18586666666666668 | 0 |
| 0.186 | 0 |
| 0.18613333333333335 | 0 |
| 0.18626666666666666 | 0 |
| 0.1864 | 0 |
| 0.18653333333333333 | 0 |
| 0.18666666666666668 | 0 |
| 0.1868 | 0 |
| 0.18693333333333334 | 0 |
| 0.18706666666666666 | 0 |
| 0.1872 | 0 |
| 0.18733333333333332 | 0 |
| 0.18746666666666667 | 0 |
| 0.1876 | 0 |
| 0.18773333333333334 | 0 |
| 0.18786666666666665 | 0 |
| 0.188 | 0 |
| 0.18813333333333335 | 0 |
| 0.18826666666666667 | 0 |
| 0.1884 | 0 |
| 0.18853333333333333 | 0 |
| 0.18866666666666668 | 0 |
| 0.1888 | 0 |
| 0.18893333333333334 | 0 |
| 0.18906666666666666 | 0 |
| 0.1892 | 0 |
| 0.18933333333333333 | 0 |
| 0.18946666666666667 | 0 |
| 0.1896 | 0 |
| 0.18973333333333334 | 0 |
| 0.18986666666666666 | 0 |
| 0.19 | 0 |
| 0.19013333333333332 | 0 |
| 0.19026666666666667 | 0 |
| 0.1904 | 0 |
| 0.19053333333333333 | 0 |
| 0.19066666666666668 | 0 |
| 0.1908 | 0 |
| 0.19093333333333334 | 0 |
| 0.19106666666666666 | 0 |
| 0.1912 | 0 |
| 0.19133333333333333 | 0 |
| 0.19146666666666667 | 0 |
| 0.1916 | 0 |
| 0.19173333333333334 | 0 |
| 0.19186666666666666 | 0 |
| 0.192 | 0 |
| 0.19213333333333332 | 0 |
| 0.19226666666666667 | 0 |
| 0.1924 | 0 |
| 0.19253333333333333 | 0 |
| 0.19266666666666668 | 0 |
| 0.1928 | 0 |
| 0.19293333333333335 | 0 |
| 0.19306666666666666 | 0 |
| 0.1932 | 0 |
| 0.19333333333333333 | 0 |
| 0.19346666666666668 | 0 |
| 0.1936 | 0 |
| 0.19373333333333334 | 0 |
| 0.19386666666666666 | 0 |
| 0.194 | 0 |
| 0.19413333333333332 | 0 |
| 0.19426666666666667 | 0 |
| 0.1944 | 0 |
| 0.19453333333333334 | 0 |
| 0.19466666666666665 | 0 |
| 0.1948 | 0 |
| 0.19493333333333332 | 0 |
| 0.19506666666666667 | 0 |
| 0.1952 | 0 |
| 0.19533333333333333 | 0 |
| 0.19546666666666668 | 0 |
| 0.1956 | 0 |
| 0.19573333333333334 | 0 |
| 0.19586666666666666 | 0 |
| 0.196 | 0 |
| 0.19613333333333333 | 0 |
| 0.19626666666666667 | 0 |
| 0.1964 | 0 |
| 0.19653333333333334 | 0 |
| 0.19666666666666666 | 0 |
| 0.1968 | 0 |
| 0.19693333333333332 | 0 |
| 0.19706666666666667 | 0 |
| 0.1972 | 0 |
| 0.19733333333333333 | 0 |
| 0.19746666666666668 | 0 |
| 0.1976 | 0 |
| 0.19773333333333334 | 0 |
| 0.19786666666666666 | 0 |
| 0.198 | 0 |
| 0.19813333333333333 | 0 |
| 0.19826666666666667 | 0 |
| 0.1984 | 0 |
| 0.19853333333333334 | 0 |
| 0.19866666666666666 | 0 |
| 0.1988 | 0 |
| 0.19893333333333332 | 0 |
| 0.19906666666666667 | 0 |
| 0.1992 | 0 |
| 0.19933333333333333 | 0 |
| 0.19946666666666665 | 0 |
| 0.1996 | 0 |
| 0.19973333333333335 | 0 |
| 0.19986666666666666 | 0 |
| 0.2 | 0 |
| 0.20013333333333333 | 0 |
| 0.20026666666666668 | 0 |
| 0.2004 | 0 |
| 0.20053333333333334 | 0 |
| 0.20066666666666666 | 0 |
| 0.2008 | 0 |
| 0.20093333333333332 | 0 |
| 0.20106666666666667 | 0 |
| 0.2012 | 0 |
| 0.20133333333333334 | 0 |
| 0.20146666666666666 | 0 |
| 0.2016 | 0 |
| 0.20173333333333332 | 0 |
| 0.20186666666666667 | 0 |
| 0.202 | 0 |
| 0.20213333333333333 | 0 |
| 0.20226666666666668 | 0 |
| 0.2024 | 0 |
| 0.20253333333333334 | 0 |
| 0.20266666666666666 | 0 |
| 0.2028 | 0 |
| 0.20293333333333333 | 0 |
| 0.20306666666666667 | 0 |
| 0.2032 | 0 |
| 0.20333333333333334 | 0 |
| 0.20346666666666666 | 0 |
| 0.2036 | 0 |
| 0.20373333333333332 | 0 |
| 0.20386666666666667 | 0 |
| 0.204 | 0 |
| 0.20413333333333333 | 0 |
| 0.20426666666666668 | 0 |
| 0.2044 | 0 |
| 0.20453333333333334 | 0 |
| 0.20466666666666666 | 0 |
| 0.2048 | 0 |
| 0.20493333333333333 | 0 |
| 0.20506666666666667 | 0 |
| 0.2052 | 0 |
| 0.20533333333333334 | 0 |
| 0.20546666666666666 | 0 |
| 0.2056 | 0 |
| 0.20573333333333332 | 0 |
| 0.20586666666666667 | 0 |
| 0.206 | 0 |
| 0.20613333333333334 | 0 |
| 0.20626666666666665 | 0 |
| 0.2064 | 0 |
| 0.20653333333333335 | 0 |
| 0.20666666666666667 | 0 |
| 0.2068 | 0 |
| 0.20693333333333333 | 0 |
| 0.20706666666666668 | 0 |
| 0.2072 | 0 |
| 0.20733333333333334 | 0 |
| 0.20746666666666666 | 0 |
| 0.2076 | 0 |
| 0.20773333333333333 | 0 |
| 0.20786666666666667 | 0 |
| 0.208 | 0 |
| 0.20813333333333334 | 0 |
| 0.20826666666666666 | 0 |
| 0.2084 | 0 |
| 0.20853333333333332 | 0 |
| 0.20866666666666667 | 0 |
| 0.2088 | 0 |
| 0.20893333333333333 | 0 |
| 0.20906666666666668 | 0 |
| 0.2092 | 0 |
| 0.20933333333333334 | 0 |
| 0.20946666666666666 | 0 |
| 0.2096 | 0 |
| 0.20973333333333333 | 0 |
| 0.20986666666666667 | 0 |
| 0.21 | 0 |
| 0.21013333333333334 | 0 |
| 0.21026666666666666 | 0 |
| 0.2104 | 0 |
| 0.21053333333333332 | 0 |
| 0.21066666666666667 | 0 |
| 0.2108 | 0 |
| 0.21093333333333333 | 0 |
| 0.21106666666666668 | 0 |
| 0.2112 | 0 |
| 0.21133333333333335 | 0 |
| 0.21146666666666666 | 0 |
| 0.2116 | 0 |
| 0.21173333333333333 | 0 |
| 0.21186666666666668 | 0 |
| 0.212 | 0 |
| 0.21213333333333334 | 0 |
| 0.21226666666666666 | 0 |
| 0.2124 | 0 |
| 0.21253333333333332 | 0 |
| 0.21266666666666667 | 0 |
| 0.2128 | 0 |
| 0.21293333333333334 | 0 |
| 0.21306666666666665 | 0 |
| 0.2132 | 0 |
| 0.21333333333333335 | 0 |
| 0.21346666666666667 | 0 |
| 0.2136 | 0 |
| 0.21373333333333333 | 0 |
| 0.21386666666666668 | 0 |
| 0.214 | 0 |
| 0.21413333333333334 | 0 |
| 0.21426666666666666 | 0 |
| 0.2144 | 0 |
| 0.21453333333333333 | 0 |
| 0.21466666666666667 | 0 |
| 0.2148 | 0 |
| 0.21493333333333334 | 0 |
| 0.21506666666666666 | 0 |
| 0.2152 | 0 |
| 0.21533333333333332 | 0 |
| 0.21546666666666667 | 0 |
| 0.2156 | 0 |
| 0.21573333333333333 | 0 |
| 0.21586666666666668 | 0 |
| 0.216 | 0 |
| 0.21613333333333334 | 0 |
| 0.21626666666666666 | 0 |
| 0.2164 | 0 |
| 0.21653333333333333 | 0 |
| 0.21666666666666667 | 0 |
| 0.2168 | 0 |
| 0.21693333333333334 | 0 |
| 0.21706666666666666 | 0 |
| 0.2172 | 0 |
| 0.21733333333333332 | 0 |
| 0.21746666666666667 | 0 |
| 0.2176 | 0 |
| 0.21773333333333333 | 0 |
| 0.21786666666666665 | 0 |
| 0.218 | 0 |
| 0.21813333333333335 | 0 |
| 0.21826666666666666 | 0 |
| 0.2184 | 0 |
| 0.21853333333333333 | 0 |
| 0.21866666666666668 | 0 |
| 0.2188 | 0 |
| 0.21893333333333334 | 0 |
| 0.21906666666666666 | 0 |
| 0.2192 | 0 |
| 0.21933333333333332 | 0 |
| 0.21946666666666667 | 0 |
| 0.2196 | 0 |
| 0.21973333333333334 | 0 |
| 0.21986666666666665 | 0 |
| 0.22 | 0 |
| 0.22013333333333332 | 0 |
| 0.22026666666666667 | 0 |
| 0.2204 | 0 |
| 0.22053333333333333 | 0 |
| 0.22066666666666668 | 0 |
| 0.2208 | 0 |
| 0.22093333333333334 | 0 |
| 0.22106666666666666 | 0 |
| 0.2212 | 0 |
| 0.22133333333333333 | 0 |
| 0.22146666666666667 | 0 |
| 0.2216 | 0 |
| 0.22173333333333334 | 0 |
| 0.22186666666666666 | 0 |
| 0.222 | 0 |
| 0.22213333333333332 | 0 |
| 0.22226666666666667 | 0 |
| 0.2224 | 0 |
| 0.22253333333333333 | 0 |
| 0.22266666666666668 | 0 |
| 0.2228 | 0 |
| 0.22293333333333334 | 0 |
| 0.22306666666666666 | 0 |
| 0.2232 | 0 |
| 0.22333333333333333 | 0 |
| 0.22346666666666667 | 0 |
| 0.2236 | 0 |
| 0.22373333333333334 | 0 |
| 0.22386666666666666 | 0 |
| 0.224 | 0 |
| 0.22413333333333332 | 0 |
| 0.22426666666666667 | 0 |
| 0.2244 | 0 |
| 0.22453333333333333 | 0 |
| 0.22466666666666665 | 0 |
| 0.2248 | 0 |
| 0.22493333333333335 | 0 |
| 0.22506666666666666 | 0 |
| 0.2252 | 0 |
| 0.22533333333333333 | 0 |
| 0.22546666666666668 | 0 |
| 0.2256 | 0 |
| 0.22573333333333334 | 0 |
| 0.22586666666666666 | 0 |
| 0.226 | 0 |
| 0.22613333333333333 | 0 |
| 0.22626666666666667 | 0 |
| 0.2264 | 0 |
| 0.22653333333333334 | 0 |
| 0.22666666666666666 | 0 |
| 0.2268 | 0 |
| 0.22693333333333332 | 0 |
| 0.22706666666666667 | 0 |
| 0.2272 | 0 |
| 0.22733333333333333 | 0 |
| 0.22746666666666668 | 0 |
| 0.2276 | 0 |
| 0.22773333333333334 | 0 |
| 0.22786666666666666 | 0 |
| 0.228 | 0 |
| 0.22813333333333333 | 0 |
| 0.22826666666666667 | 0 |
| 0.2284 | 0 |
| 0.22853333333333334 | 0 |
| 0.22866666666666666 | 0 |
| 0.2288 | 0 |
| 0.22893333333333332 | 0 |
| 0.22906666666666667 | 0 |
| 0.2292 | 0 |
| 0.22933333333333333 | 0 |
| 0.22946666666666668 | 0 |
| 0.2296 | 0 |
| 0.22973333333333334 | 0 |
| 0.22986666666666666 | 0 |
| 0.23 | 0 |
| 0.23013333333333333 | 0 |
| 0.23026666666666668 | 0 |
| 0.2304 | 0 |
| 0.23053333333333334 | 0 |
| 0.23066666666666666 | 0 |
| 0.2308 | 0 |
| 0.23093333333333332 | 0 |
| 0.23106666666666667 | 0 |
| 0.2312 | 0 |
| 0.23133333333333334 | 0 |
| 0.23146666666666665 | 0 |
| 0.2316 | 0 |
| 0.23173333333333335 | 0 |
| 0.23186666666666667 | 0 |
| 0.232 | 0 |
| 0.23213333333333333 | 0 |
| 0.23226666666666668 | 0 |
| 0.2324 | 0 |
| 0.23253333333333334 | 0 |
| 0.23266666666666666 | 0 |
| 0.2328 | 0 |
| 0.23293333333333333 | 0 |
| 0.23306666666666667 | 0 |
| 0.2332 | 0 |
| 0.23333333333333334 | 0 |
| 0.23346666666666666 | 0 |
| 0.2336 | 0 |
| 0.23373333333333332 | 0 |
| 0.23386666666666667 | 0 |
| 0.234 | 0 |
| 0.23413333333333333 | 0 |
| 0.23426666666666668 | 0 |
| 0.2344 | 0 |
| 0.23453333333333334 | 0 |
| 0.23466666666666666 | 0 |
| 0.2348 | 0 |
| 0.23493333333333333 | 0 |
| 0.23506666666666667 | 0 |
| 0.2352 | 0 |
| 0.23533333333333334 | 0 |
| 0.23546666666666666 | 0 |
| 0.2356 | 0 |
| 0.23573333333333332 | 0 |
| 0.23586666666666667 | 0 |
| 0.236 | 0 |
| 0.23613333333333333 | 0 |
| 0.23626666666666668 | 0 |
| 0.2364 | 0 |
| 0.23653333333333335 | 0 |
| 0.23666666666666666 | 0 |
| 0.2368 | 0 |
| 0.23693333333333333 | 0 |
| 0.23706666666666668 | 0 |
| 0.2372 | 0 |
| 0.23733333333333334 | 0 |
| 0.23746666666666666 | 0 |
| 0.2376 | 0 |
| 0.23773333333333332 | 0 |
| 0.23786666666666667 | 0 |
| 0.238 | 0 |
| 0.23813333333333334 | 0 |
| 0.23826666666666665 | 0 |
| 0.2384 | 0 |
| 0.23853333333333335 | 0 |
| 0.23866666666666667 | 0 |
| 0.2388 | 0 |
| 0.23893333333333333 | 0 |
| 0.23906666666666668 | 0 |
| 0.2392 | 0 |
| 0.23933333333333334 | 0 |
| 0.23946666666666666 | 0 |
| 0.2396 | 0 |
| 0.23973333333333333 | 0 |
| 0.23986666666666667 | 0 |
| 0.24 | 0 |
| 0.24013333333333334 | 0 |
| 0.24026666666666666 | 0 |
| 0.2404 | 0 |
| 0.24053333333333332 | 0 |
| 0.24066666666666667 | 0 |
| 0.2408 | 0 |
| 0.24093333333333333 | 0 |
| 0.24106666666666668 | 0 |
| 0.2412 | 0 |
| 0.24133333333333334 | 0 |
| 0.24146666666666666 | 0 |
| 0.2416 | 0 |
| 0.24173333333333333 | 0 |
| 0.24186666666666667 | 0 |
| 0.242 | 0 |
| 0.24213333333333334 | 0 |
| 0.24226666666666666 | 0 |
| 0.2424 | 0 |
| 0.24253333333333332 | 0 |
| 0.24266666666666667 | 0 |
| 0.2428 | 0 |
| 0.24293333333333333 | 0 |
| 0.24306666666666665 | 0 |
| 0.2432 | 0 |
| 0.24333333333333335 | 0 |
| 0.24346666666666666 | 0 |
| 0.2436 | 0 |
| 0.24373333333333333 | 0 |
| 0.24386666666666668 | 0 |
| 0.244 | 0 |
| 0.24413333333333334 | 0 |
| 0.24426666666666666 | 0 |
| 0.2444 | 0 |
| 0.24453333333333332 | 0 |
| 0.24466666666666667 | 0 |
| 0.2448 | 0 |
| 0.24493333333333334 | 0 |
| 0.24506666666666665 | 0 |
| 0.2452 | 0 |
| 0.24533333333333332 | 0 |
| 0.24546666666666667 | 0 |
| 0.2456 | 0 |
| 0.24573333333333333 | 0 |
| 0.24586666666666668 | 0 |
| 0.246 | 0 |
| 0.24613333333333334 | 0 |
| 0.24626666666666666 | 0 |
| 0.2464 | 0 |
| 0.24653333333333333 | 0 |
| 0.24666666666666667 | 0 |
| 0.2468 | 0 |
| 0.24693333333333334 | 50 |
| 0.24706666666666666 | 50 |
| 0.2472 | 50 |
| 0.24733333333333332 | 50 |
| 0.24746666666666667 | 50 |
| 0.2476 | 50 |
| 0.24773333333333333 | 50 |
| 0.24786666666666668 | 50 |
| 0.248 | 50 |
| 0.24813333333333334 | 50 |
| 0.24826666666666666 | 50 |
| 0.2484 | 50 |
| 0.24853333333333333 | 50 |
| 0.24866666666666667 | 50 |
| 0.2488 | 50 |
| 0.24893333333333334 | 50 |
| 0.24906666666666666 | 50 |
| 0.2492 | 50 |
| 0.24933333333333332 | 50 |
| 0.24946666666666667 | 50 |
| 0.2496 | 50 |
| 0.24973333333333333 | 50 |
| 0.24986666666666665 | 50 |
| 0.25 | 50 |
| 0.2501333333333333 | 50 |
| 0.2502666666666667 | 50 |
| 0.2504 | 50 |
| 0.25053333333333333 | 50 |
| 0.25066666666666665 | 50 |
| 0.2508 | 50 |
| 0.25093333333333334 | 50 |
| 0.25106666666666666 | 50 |
| 0.2512 | 50 |
| 0.25133333333333335 | 50 |
| 0.25146666666666667 | 50 |
| 0.2516 | 50 |
| 0.2517333333333333 | 50 |
| 0.2518666666666667 | 50 |
| 0.252 | 50 |
| 0.2521333333333333 | 50 |
| 0.25226666666666664 | 50 |
| 0.2524 | 50 |
| 0.25253333333333333 | 50 |
| 0.25266666666666665 | 50 |
| 0.2528 | 50 |
| 0.25293333333333334 | 50 |
| 0.25306666666666666 | 50 |
| 0.2532 | 50 |
| 0.25333333333333335 | 50 |
| 0.2534666666666667 | 50 |
| 0.2536 | 50 |
| 0.2537333333333333 | 50 |
| 0.2538666666666667 | 50 |
| 0.254 | 50 |
| 0.2541333333333333 | 50 |
| 0.25426666666666664 | 50 |
| 0.2544 | 50 |
| 0.25453333333333333 | 50 |
| 0.25466666666666665 | 50 |
| 0.2548 | 50 |
| 0.25493333333333335 | 50 |
| 0.25506666666666666 | 50 |
| 0.2552 | 50 |
| 0.25533333333333336 | 50 |
| 0.2554666666666667 | 50 |
| 0.2556 | 50 |
| 0.2557333333333333 | 50 |
| 0.2558666666666667 | 50 |
| 0.256 | 50 |
| 0.2561333333333333 | 50 |
| 0.25626666666666664 | 50 |
| 0.2564 | 50 |
| 0.25653333333333334 | 50 |
| 0.25666666666666665 | 50 |
| 0.2568 | 50 |
| 0.25693333333333335 | 50 |
| 0.25706666666666667 | 50 |
| 0.2572 | 50 |
| 0.25733333333333336 | 50 |
| 0.2574666666666667 | 50 |
| 0.2576 | 50 |
| 0.2577333333333333 | 50 |
| 0.2578666666666667 | 50 |
| 0.258 | 50 |
| 0.2581333333333333 | 50 |
| 0.25826666666666664 | 50 |
| 0.2584 | 50 |
| 0.25853333333333334 | 50 |
| 0.25866666666666666 | 50 |
| 0.2588 | 50 |
| 0.25893333333333335 | 50 |
| 0.25906666666666667 | 50 |
| 0.2592 | 50 |
| 0.25933333333333336 | 50 |
| 0.2594666666666667 | 50 |
| 0.2596 | 50 |
| 0.2597333333333333 | 50 |
| 0.2598666666666667 | 50 |
| 0.26 | 50 |
| 0.2601333333333333 | 50 |
| 0.26026666666666665 | 50 |
| 0.2604 | 50 |
| 0.26053333333333334 | 50 |
| 0.26066666666666666 | 50 |
| 0.2608 | 50 |
| 0.26093333333333335 | 50 |
| 0.26106666666666667 | 50 |
| 0.2612 | 50 |
| 0.2613333333333333 | 50 |
| 0.2614666666666667 | 50 |
| 0.2616 | 50 |
| 0.2617333333333333 | 50 |
| 0.2618666666666667 | 50 |
| 0.262 | 50 |
| 0.26213333333333333 | 50 |
| 0.26226666666666665 | 50 |
| 0.2624 | 50 |
| 0.26253333333333334 | 50 |
| 0.26266666666666666 | 50 |
| 0.2628 | 50 |
| 0.26293333333333335 | 50 |
| 0.26306666666666667 | 50 |
| 0.2632 | 50 |
| 0.2633333333333333 | 50 |
| 0.2634666666666667 | 50 |
| 0.2636 | 50 |
| 0.2637333333333333 | 50 |
| 0.2638666666666667 | 50 |
| 0.264 | 50 |
| 0.26413333333333333 | 50 |
| 0.26426666666666665 | 50 |
| 0.2644 | 50 |
| 0.26453333333333334 | 50 |
| 0.26466666666666666 | 50 |
| 0.2648 | 50 |
| 0.26493333333333335 | 50 |
| 0.2650666666666667 | 50 |
| 0.2652 | 50 |
| 0.2653333333333333 | 50 |
| 0.2654666666666667 | 50 |
| 0.2656 | 50 |
| 0.2657333333333333 | 50 |
| 0.26586666666666664 | 50 |
| 0.266 | 50 |
| 0.26613333333333333 | 50 |
| 0.26626666666666665 | 50 |
| 0.2664 | 50 |
| 0.26653333333333334 | 50 |
| 0.26666666666666666 | 50 |
| 0.2668 | 50 |
| 0.26693333333333336 | 50 |
| 0.2670666666666667 | 50 |
| 0.2672 | 50 |
| 0.2673333333333333 | 50 |
| 0.2674666666666667 | 50 |
| 0.2676 | 50 |
| 0.2677333333333333 | 50 |
| 0.26786666666666664 | 50 |
| 0.268 | 50 |
| 0.26813333333333333 | 50 |
| 0.26826666666666665 | 50 |
| 0.2684 | 50 |
| 0.26853333333333335 | 50 |
| 0.26866666666666666 | 50 |
| 0.2688 | 50 |
| 0.26893333333333336 | 50 |
| 0.2690666666666667 | 50 |
| 0.2692 | 50 |
| 0.2693333333333333 | 50 |
| 0.2694666666666667 | 50 |
| 0.2696 | 50 |
| 0.2697333333333333 | 50 |
| 0.26986666666666664 | 50 |
| 0.27 | 50 |
| 0.27013333333333334 | 50 |
| 0.27026666666666666 | 50 |
| 0.2704 | 50 |
| 0.27053333333333335 | 50 |
| 0.27066666666666667 | 50 |
| 0.2708 | 50 |
| 0.27093333333333336 | 50 |
| 0.2710666666666667 | 50 |
| 0.2712 | 50 |
| 0.2713333333333333 | 50 |
| 0.2714666666666667 | 50 |
| 0.2716 | 50 |
| 0.2717333333333333 | 50 |
| 0.27186666666666665 | 50 |
| 0.272 | 50 |
| 0.27213333333333334 | 50 |
| 0.27226666666666666 | 50 |
| 0.2724 | 50 |
| 0.27253333333333335 | 50 |
| 0.27266666666666667 | 50 |
| 0.2728 | 50 |
| 0.2729333333333333 | 50 |
| 0.2730666666666667 | 50 |
| 0.2732 | 50 |
| 0.2733333333333333 | 50 |
| 0.2734666666666667 | 50 |
| 0.2736 | 50 |
| 0.27373333333333333 | 50 |
| 0.27386666666666665 | 50 |
| 0.274 | 50 |
| 0.27413333333333334 | 50 |
| 0.27426666666666666 | 50 |
| 0.2744 | 50 |
| 0.27453333333333335 | 50 |
| 0.27466666666666667 | 50 |
| 0.2748 | 50 |
| 0.2749333333333333 | 50 |
| 0.2750666666666667 | 50 |
| 0.2752 | 50 |
| 0.2753333333333333 | 50 |
| 0.2754666666666667 | 50 |
| 0.2756 | 50 |
| 0.27573333333333333 | 50 |
| 0.27586666666666665 | 50 |
| 0.276 | 50 |
| 0.27613333333333334 | 50 |
| 0.27626666666666666 | 50 |
| 0.2764 | 50 |
| 0.27653333333333335 | 50 |
| 0.27666666666666667 | 50 |
| 0.2768 | 50 |
| 0.2769333333333333 | 50 |
| 0.2770666666666667 | 50 |
| 0.2772 | 50 |
| 0.2773333333333333 | 50 |
| 0.27746666666666664 | 50 |
| 0.2776 | 50 |
| 0.27773333333333333 | 50 |
| 0.27786666666666665 | 50 |
| 0.278 | 50 |
| 0.27813333333333334 | 50 |
| 0.27826666666666666 | 50 |
| 0.2784 | 50 |
| 0.27853333333333335 | 50 |
| 0.2786666666666667 | 50 |
| 0.2788 | 50 |
| 0.2789333333333333 | 50 |
| 0.2790666666666667 | 50 |
| 0.2792 | 50 |
| 0.2793333333333333 | 50 |
| 0.27946666666666664 | 50 |
| 0.2796 | 50 |
| 0.27973333333333333 | 50 |
| 0.27986666666666665 | 50 |
| 0.28 | 50 |
| 0.28013333333333335 | 50 |
| 0.28026666666666666 | 50 |
| 0.2804 | 50 |
| 0.28053333333333336 | 50 |
| 0.2806666666666667 | 50 |
| 0.2808 | 50 |
| 0.2809333333333333 | 50 |
| 0.2810666666666667 | 50 |
| 0.2812 | 50 |
| 0.2813333333333333 | 50 |
| 0.28146666666666664 | 50 |
| 0.2816 | 50 |
| 0.28173333333333334 | 50 |
| 0.28186666666666665 | 50 |
| 0.282 | 50 |
| 0.28213333333333335 | 50 |
| 0.28226666666666667 | 50 |
| 0.2824 | 50 |
| 0.28253333333333336 | 50 |
| 0.2826666666666667 | 50 |
| 0.2828 | 50 |
| 0.2829333333333333 | 50 |
| 0.2830666666666667 | 50 |
| 0.2832 | 50 |
| 0.2833333333333333 | 50 |
| 0.28346666666666664 | 50 |
| 0.2836 | 50 |
| 0.28373333333333334 | 50 |
| 0.28386666666666666 | 50 |
| 0.284 | 50 |
| 0.28413333333333335 | 50 |
| 0.28426666666666667 | 50 |
| 0.2844 | 50 |
| 0.28453333333333336 | 50 |
| 0.2846666666666667 | 50 |
| 0.2848 | 50 |
| 0.2849333333333333 | 50 |
| 0.2850666666666667 | 50 |
| 0.2852 | 50 |
| 0.2853333333333333 | 50 |
| 0.28546666666666665 | 50 |
| 0.2856 | 50 |
| 0.28573333333333334 | 50 |
| 0.28586666666666666 | 50 |
| 0.286 | 50 |
| 0.28613333333333335 | 50 |
| 0.28626666666666667 | 50 |
| 0.2864 | 50 |
| 0.2865333333333333 | 50 |
| 0.2866666666666667 | 50 |
| 0.2868 | 50 |
| 0.2869333333333333 | 50 |
| 0.2870666666666667 | 50 |
| 0.2872 | 50 |
| 0.28733333333333333 | 50 |
| 0.28746666666666665 | 50 |
| 0.2876 | 50 |
| 0.28773333333333334 | 50 |
| 0.28786666666666666 | 50 |
| 0.288 | 50 |
| 0.28813333333333335 | 50 |
| 0.28826666666666667 | 50 |
| 0.2884 | 50 |
| 0.2885333333333333 | 50 |
| 0.2886666666666667 | 50 |
| 0.2888 | 50 |
| 0.2889333333333333 | 50 |
| 0.2890666666666667 | 50 |
| 0.2892 | 50 |
| 0.28933333333333333 | 50 |
| 0.28946666666666665 | 50 |
| 0.2896 | 50 |
| 0.28973333333333334 | 50 |
| 0.28986666666666666 | 50 |
| 0.29 | 50 |
| 0.29013333333333335 | 50 |
| 0.2902666666666667 | 50 |
| 0.2904 | 50 |
| 0.2905333333333333 | 50 |
| 0.2906666666666667 | 50 |
| 0.2908 | 50 |
| 0.2909333333333333 | 50 |
| 0.29106666666666664 | 50 |
| 0.2912 | 100 |
| 0.29133333333333333 | 100 |
| 0.29146666666666665 | 100 |
| 0.2916 | 100 |
| 0.29173333333333334 | 100 |
| 0.29186666666666666 | 100 |
| 0.292 | 100 |
| 0.29213333333333336 | 100 |
| 0.2922666666666667 | 100 |
| 0.2924 | 100 |
| 0.2925333333333333 | 100 |
| 0.2926666666666667 | 100 |
| 0.2928 | 100 |
| 0.2929333333333333 | 100 |
| 0.29306666666666664 | 100 |
| 0.2932 | 100 |
| 0.29333333333333333 | 100 |
| 0.29346666666666665 | 100 |
| 0.2936 | 100 |
| 0.29373333333333335 | 100 |
| 0.29386666666666666 | 100 |
| 0.294 | 100 |
| 0.29413333333333336 | 100 |
| 0.2942666666666667 | 100 |
| 0.2944 | 100 |
| 0.2945333333333333 | 100 |
| 0.2946666666666667 | 100 |
| 0.2948 | 100 |
| 0.2949333333333333 | 100 |
| 0.29506666666666664 | 100 |
| 0.2952 | 100 |
| 0.29533333333333334 | 100 |
| 0.29546666666666666 | 100 |
| 0.2956 | 100 |
| 0.29573333333333335 | 100 |
| 0.29586666666666667 | 100 |
| 0.296 | 100 |
| 0.29613333333333336 | 100 |
| 0.2962666666666667 | 100 |
| 0.2964 | 100 |
| 0.2965333333333333 | 100 |
| 0.2966666666666667 | 100 |
| 0.2968 | 100 |
| 0.2969333333333333 | 100 |
| 0.29706666666666665 | 100 |
| 0.2972 | 100 |
| 0.29733333333333334 | 100 |
| 0.29746666666666666 | 100 |
| 0.2976 | 100 |
| 0.29773333333333335 | 100 |
| 0.29786666666666667 | 100 |
| 0.298 | 100 |
| 0.2981333333333333 | 100 |
| 0.2982666666666667 | 100 |
| 0.2984 | 100 |
| 0.2985333333333333 | 100 |
| 0.2986666666666667 | 100 |
| 0.2988 | 100 |
| 0.29893333333333333 | 100 |
| 0.29906666666666665 | 100 |
| 0.2992 | 100 |
| 0.29933333333333334 | 100 |
| 0.29946666666666666 | 100 |
| 0.2996 | 100 |
| 0.29973333333333335 | 100 |
| 0.29986666666666667 | 100 |
| 0.3 | 100 |
| 0.3001333333333333 | 100 |
| 0.3002666666666667 | 100 |
| 0.3004 | 100 |
| 0.3005333333333333 | 100 |
| 0.3006666666666667 | 100 |
| 0.3008 | 100 |
| 0.30093333333333333 | 100 |
| 0.30106666666666665 | 100 |
| 0.3012 | 100 |
| 0.30133333333333334 | 100 |
| 0.30146666666666666 | 100 |
| 0.3016 | 100 |
| 0.30173333333333335 | 100 |
| 0.30186666666666667 | 100 |
| 0.302 | 100 |
| 0.3021333333333333 | 100 |
| 0.3022666666666667 | 100 |
| 0.3024 | 100 |
| 0.3025333333333333 | 100 |
| 0.30266666666666664 | 100 |
| 0.3028 | 100 |
| 0.30293333333333333 | 100 |
| 0.30306666666666665 | 100 |
| 0.3032 | 100 |
| 0.30333333333333334 | 100 |
| 0.30346666666666666 | 100 |
| 0.3036 | 100 |
| 0.30373333333333336 | 100 |
| 0.3038666666666667 | 100 |
| 0.304 | 100 |
| 0.3041333333333333 | 100 |
| 0.3042666666666667 | 100 |
| 0.3044 | 100 |
| 0.3045333333333333 | 100 |
| 0.30466666666666664 | 100 |
| 0.3048 | 100 |
| 0.30493333333333333 | 100 |
| 0.30506666666666665 | 100 |
| 0.3052 | 100 |
| 0.30533333333333335 | 100 |
| 0.30546666666666666 | 100 |
| 0.3056 | 100 |
| 0.30573333333333336 | 100 |
| 0.3058666666666667 | 100 |
| 0.306 | 100 |
| 0.3061333333333333 | 100 |
| 0.3062666666666667 | 100 |
| 0.3064 | 100 |
| 0.3065333333333333 | 100 |
| 0.30666666666666664 | 100 |
| 0.3068 | 100 |
| 0.30693333333333334 | 100 |
| 0.30706666666666665 | 100 |
| 0.3072 | 100 |
| 0.30733333333333335 | 100 |
| 0.30746666666666667 | 100 |
| 0.3076 | 100 |
| 0.30773333333333336 | 100 |
| 0.3078666666666667 | 100 |
| 0.308 | 100 |
| 0.3081333333333333 | 100 |
| 0.3082666666666667 | 100 |
| 0.3084 | 100 |
| 0.3085333333333333 | 100 |
| 0.30866666666666664 | 100 |
| 0.3088 | 100 |
| 0.30893333333333334 | 100 |
| 0.30906666666666666 | 100 |
| 0.3092 | 100 |
| 0.30933333333333335 | 100 |
| 0.30946666666666667 | 100 |
| 0.3096 | 100 |
| 0.30973333333333336 | 100 |
| 0.3098666666666667 | 100 |
| 0.31 | 100 |
| 0.3101333333333333 | 100 |
| 0.3102666666666667 | 100 |
| 0.3104 | 100 |
| 0.31053333333333333 | 100 |
| 0.31066666666666665 | 100 |
| 0.3108 | 100 |
| 0.31093333333333334 | 100 |
| 0.31106666666666666 | 100 |
| 0.3112 | 100 |
| 0.31133333333333335 | 100 |
| 0.31146666666666667 | 100 |
| 0.3116 | 100 |
| 0.3117333333333333 | 100 |
| 0.3118666666666667 | 100 |
| 0.312 | 100 |
| 0.3121333333333333 | 100 |
| 0.3122666666666667 | 100 |
| 0.3124 | 100 |
| 0.31253333333333333 | 100 |
| 0.31266666666666665 | 100 |
| 0.3128 | 100 |
| 0.31293333333333334 | 100 |
| 0.31306666666666666 | 100 |
| 0.3132 | 100 |
| 0.31333333333333335 | 100 |
| 0.31346666666666667 | 100 |
| 0.3136 | 100 |
| 0.3137333333333333 | 100 |
| 0.3138666666666667 | 100 |
| 0.314 | 100 |
| 0.3141333333333333 | 100 |
| 0.3142666666666667 | 100 |
| 0.3144 | 100 |
| 0.31453333333333333 | 100 |
| 0.31466666666666665 | 100 |
| 0.3148 | 100 |
| 0.31493333333333334 | 100 |
| 0.31506666666666666 | 100 |
| 0.3152 | 100 |
| 0.31533333333333335 | 100 |
| 0.3154666666666667 | 100 |
| 0.3156 | 100 |
| 0.3157333333333333 | 100 |
| 0.3158666666666667 | 100 |
| 0.316 | 100 |
| 0.3161333333333333 | 100 |
| 0.31626666666666664 | 100 |
| 0.3164 | 100 |
| 0.31653333333333333 | 100 |
| 0.31666666666666665 | 100 |
| 0.3168 | 100 |
| 0.31693333333333334 | 100 |
| 0.31706666666666666 | 100 |
| 0.3172 | 100 |
| 0.31733333333333336 | 100 |
| 0.3174666666666667 | 100 |
| 0.3176 | 100 |
| 0.3177333333333333 | 100 |
| 0.3178666666666667 | 100 |
| 0.318 | 100 |
| 0.3181333333333333 | 100 |
| 0.31826666666666664 | 100 |
| 0.3184 | 100 |
| 0.31853333333333333 | 100 |
| 0.31866666666666665 | 100 |
| 0.3188 | 100 |
| 0.31893333333333335 | 100 |
| 0.31906666666666667 | 100 |
| 0.3192 | 100 |
| 0.31933333333333336 | 100 |
| 0.3194666666666667 | 100 |
| 0.3196 | 100 |
| 0.3197333333333333 | 100 |
| 0.3198666666666667 | 100 |
| 0.32 | 100 |
| 0.3201333333333333 | 100 |
| 0.32026666666666664 | 100 |
| 0.3204 | 100 |
| 0.32053333333333334 | 100 |
| 0.32066666666666666 | 100 |
| 0.3208 | 100 |
| 0.32093333333333335 | 100 |
| 0.32106666666666667 | 100 |
| 0.3212 | 100 |
| 0.32133333333333336 | 100 |
| 0.3214666666666667 | 100 |
| 0.3216 | 100 |
| 0.3217333333333333 | 100 |
| 0.3218666666666667 | 100 |
| 0.322 | 100 |
| 0.3221333333333333 | 100 |
| 0.32226666666666665 | 100 |
| 0.3224 | 100 |
| 0.32253333333333334 | 100 |
| 0.32266666666666666 | 100 |
| 0.3228 | 100 |
| 0.32293333333333335 | 100 |
| 0.32306666666666667 | 100 |
| 0.3232 | 100 |
| 0.3233333333333333 | 100 |
| 0.3234666666666667 | 100 |
| 0.3236 | 100 |
| 0.3237333333333333 | 100 |
| 0.3238666666666667 | 100 |
| 0.324 | 100 |
| 0.32413333333333333 | 100 |
| 0.32426666666666665 | 100 |
| 0.3244 | 100 |
| 0.32453333333333334 | 100 |
| 0.32466666666666666 | 100 |
| 0.3248 | 100 |
| 0.32493333333333335 | 100 |
| 0.32506666666666667 | 100 |
| 0.3252 | 100 |
| 0.3253333333333333 | 100 |
| 0.3254666666666667 | 100 |
| 0.3256 | 100 |
| 0.3257333333333333 | 100 |
| 0.3258666666666667 | 100 |
| 0.326 | 100 |
| 0.32613333333333333 | 100 |
| 0.32626666666666665 | 100 |
| 0.3264 | 100 |
| 0.32653333333333334 | 100 |
| 0.32666666666666666 | 100 |
| 0.3268 | 100 |
| 0.32693333333333335 | 100 |
| 0.32706666666666667 | 100 |
| 0.3272 | 100 |
| 0.3273333333333333 | 100 |
| 0.3274666666666667 | 100 |
| 0.3276 | 100 |
| 0.3277333333333333 | 100 |
| 0.32786666666666664 | 100 |
| 0.328 | 100 |
| 0.32813333333333333 | 100 |
| 0.32826666666666665 | 100 |
| 0.3284 | 100 |
| 0.32853333333333334 | 100 |
| 0.32866666666666666 | 100 |
| 0.3288 | 100 |
| 0.32893333333333336 | 100 |
| 0.3290666666666667 | 100 |
| 0.3292 | 100 |
| 0.3293333333333333 | 100 |
| 0.3294666666666667 | 100 |
| 0.3296 | 100 |
| 0.3297333333333333 | 100 |
| 0.32986666666666664 | 100 |
| 0.33 | 100 |
| 0.33013333333333333 | 100 |
| 0.33026666666666665 | 100 |
| 0.3304 | 100 |
| 0.33053333333333335 | 100 |
| 0.33066666666666666 | 100 |
| 0.3308 | 100 |
| 0.33093333333333336 | 100 |
| 0.3310666666666667 | 100 |
| 0.3312 | 100 |
| 0.3313333333333333 | 100 |
| 0.3314666666666667 | 100 |
| 0.3316 | 100 |
| 0.3317333333333333 | 100 |
| 0.33186666666666664 | 100 |
| 0.332 | 100 |
| 0.33213333333333334 | 100 |
| 0.33226666666666665 | 100 |
| 0.3324 | 100 |
| 0.33253333333333335 | 100 |
| 0.33266666666666667 | 100 |
| 0.3328 | 100 |
| 0.33293333333333336 | 100 |
| 0.3330666666666667 | 100 |
| 0.3332 | 100 |
| 0.3333333333333333 | 100 |
| 0.3334666666666667 | 100 |
| 0.3336 | 100 |
| 0.3337333333333333 | 100 |
| 0.33386666666666664 | 100 |
| 0.334 | 100 |
| 0.33413333333333334 | 100 |
| 0.33426666666666666 | 100 |
| 0.3344 | 100 |
| 0.33453333333333335 | 150 |
| 0.33466666666666667 | 150 |
| 0.3348 | 150 |
| 0.33493333333333336 | 150 |
| 0.3350666666666667 | 150 |
| 0.3352 | 150 |
| 0.3353333333333333 | 150 |
| 0.3354666666666667 | 150 |
| 0.3356 | 150 |
| 0.33573333333333333 | 150 |
| 0.33586666666666665 | 150 |
| 0.336 | 150 |
| 0.33613333333333334 | 150 |
| 0.33626666666666666 | 150 |
| 0.3364 | 150 |
| 0.33653333333333335 | 150 |
| 0.33666666666666667 | 150 |
| 0.3368 | 150 |
| 0.3369333333333333 | 150 |
| 0.3370666666666667 | 150 |
| 0.3372 | 150 |
| 0.3373333333333333 | 150 |
| 0.3374666666666667 | 150 |
| 0.3376 | 150 |
| 0.33773333333333333 | 150 |
| 0.33786666666666665 | 150 |
| 0.338 | 150 |
| 0.33813333333333334 | 150 |
| 0.33826666666666666 | 150 |
| 0.3384 | 150 |
| 0.33853333333333335 | 150 |
| 0.33866666666666667 | 150 |
| 0.3388 | 150 |
| 0.3389333333333333 | 150 |
| 0.3390666666666667 | 150 |
| 0.3392 | 150 |
| 0.3393333333333333 | 150 |
| 0.3394666666666667 | 150 |
| 0.3396 | 150 |
| 0.33973333333333333 | 150 |
| 0.33986666666666665 | 150 |
| 0.34 | 150 |
| 0.34013333333333334 | 150 |
| 0.34026666666666666 | 150 |
| 0.3404 | 150 |
| 0.34053333333333335 | 150 |
| 0.3406666666666667 | 150 |
| 0.3408 | 150 |
| 0.3409333333333333 | 150 |
| 0.3410666666666667 | 150 |
| 0.3412 | 150 |
| 0.3413333333333333 | 150 |
| 0.34146666666666664 | 150 |
| 0.3416 | 150 |
| 0.34173333333333333 | 150 |
| 0.34186666666666665 | 150 |
| 0.342 | 150 |
| 0.34213333333333334 | 150 |
| 0.34226666666666666 | 150 |
| 0.3424 | 150 |
| 0.34253333333333336 | 150 |
| 0.3426666666666667 | 150 |
| 0.3428 | 150 |
| 0.3429333333333333 | 150 |
| 0.3430666666666667 | 150 |
| 0.3432 | 150 |
| 0.3433333333333333 | 150 |
| 0.34346666666666664 | 150 |
| 0.3436 | 150 |
| 0.34373333333333334 | 150 |
| 0.34386666666666665 | 150 |
| 0.344 | 150 |
| 0.34413333333333335 | 150 |
| 0.34426666666666667 | 150 |
| 0.3444 | 150 |
| 0.34453333333333336 | 150 |
| 0.3446666666666667 | 150 |
| 0.3448 | 150 |
| 0.3449333333333333 | 150 |
| 0.3450666666666667 | 150 |
| 0.3452 | 150 |
| 0.3453333333333333 | 150 |
| 0.34546666666666664 | 150 |
| 0.3456 | 150 |
| 0.34573333333333334 | 150 |
| 0.34586666666666666 | 150 |
| 0.346 | 150 |
| 0.34613333333333335 | 150 |
| 0.34626666666666667 | 150 |
| 0.3464 | 150 |
| 0.34653333333333336 | 150 |
| 0.3466666666666667 | 150 |
| 0.3468 | 150 |
| 0.3469333333333333 | 150 |
| 0.3470666666666667 | 150 |
| 0.3472 | 150 |
| 0.3473333333333333 | 150 |
| 0.34746666666666665 | 150 |
| 0.3476 | 150 |
| 0.34773333333333334 | 150 |
| 0.34786666666666666 | 150 |
| 0.348 | 150 |
| 0.34813333333333335 | 150 |
| 0.34826666666666667 | 150 |
| 0.3484 | 150 |
| 0.3485333333333333 | 150 |
| 0.3486666666666667 | 150 |
| 0.3488 | 150 |
| 0.3489333333333333 | 150 |
| 0.3490666666666667 | 150 |
| 0.3492 | 150 |
| 0.34933333333333333 | 150 |
| 0.34946666666666665 | 150 |
| 0.3496 | 150 |
| 0.34973333333333334 | 150 |
| 0.34986666666666666 | 150 |
| 0.35 | 150 |
| 0.35013333333333335 | 150 |
| 0.35026666666666667 | 150 |
| 0.3504 | 150 |
| 0.3505333333333333 | 150 |
| 0.3506666666666667 | 150 |
| 0.3508 | 150 |
| 0.3509333333333333 | 150 |
| 0.3510666666666667 | 150 |
| 0.3512 | 150 |
| 0.35133333333333333 | 150 |
| 0.35146666666666665 | 150 |
| 0.3516 | 150 |
| 0.35173333333333334 | 150 |
| 0.35186666666666666 | 150 |
| 0.352 | 150 |
| 0.35213333333333335 | 150 |
| 0.3522666666666667 | 150 |
| 0.3524 | 150 |
| 0.3525333333333333 | 150 |
| 0.3526666666666667 | 150 |
| 0.3528 | 150 |
| 0.3529333333333333 | 150 |
| 0.35306666666666664 | 150 |
| 0.3532 | 150 |
| 0.35333333333333333 | 150 |
| 0.35346666666666665 | 150 |
| 0.3536 | 150 |
| 0.35373333333333334 | 150 |
| 0.35386666666666666 | 150 |
| 0.354 | 150 |
| 0.35413333333333336 | 150 |
| 0.3542666666666667 | 150 |
| 0.3544 | 150 |
| 0.3545333333333333 | 150 |
| 0.3546666666666667 | 150 |
| 0.3548 | 150 |
| 0.3549333333333333 | 150 |
| 0.35506666666666664 | 150 |
| 0.3552 | 150 |
| 0.35533333333333333 | 150 |
| 0.35546666666666665 | 150 |
| 0.3556 | 150 |
| 0.35573333333333335 | 150 |
| 0.35586666666666666 | 150 |
| 0.356 | 150 |
| 0.35613333333333336 | 150 |
| 0.3562666666666667 | 150 |
| 0.3564 | 150 |
| 0.3565333333333333 | 150 |
| 0.3566666666666667 | 150 |
| 0.3568 | 150 |
| 0.3569333333333333 | 150 |
| 0.35706666666666664 | 150 |
| 0.3572 | 150 |
| 0.35733333333333334 | 150 |
| 0.35746666666666665 | 150 |
| 0.3576 | 150 |
| 0.35773333333333335 | 150 |
| 0.35786666666666667 | 150 |
| 0.358 | 150 |
| 0.35813333333333336 | 150 |
| 0.3582666666666667 | 150 |
| 0.3584 | 150 |
| 0.3585333333333333 | 150 |
| 0.3586666666666667 | 150 |
| 0.3588 | 150 |
| 0.3589333333333333 | 150 |
| 0.35906666666666665 | 150 |
| 0.3592 | 150 |
| 0.35933333333333334 | 150 |
| 0.35946666666666666 | 150 |
| 0.3596 | 150 |
| 0.35973333333333335 | 150 |
| 0.35986666666666667 | 150 |
| 0.36 | 150 |
| 0.36013333333333336 | 150 |
| 0.3602666666666667 | 150 |
| 0.3604 | 150 |
| 0.3605333333333333 | 150 |
| 0.3606666666666667 | 150 |
| 0.3608 | 150 |
| 0.36093333333333333 | 150 |
| 0.36106666666666665 | 150 |
| 0.3612 | 150 |
| 0.36133333333333334 | 150 |
| 0.36146666666666666 | 150 |
| 0.3616 | 150 |
| 0.36173333333333335 | 150 |
| 0.36186666666666667 | 150 |
| 0.362 | 150 |
| 0.3621333333333333 | 150 |
| 0.3622666666666667 | 150 |
| 0.3624 | 150 |
| 0.3625333333333333 | 150 |
| 0.3626666666666667 | 150 |
| 0.3628 | 150 |
| 0.36293333333333333 | 150 |
| 0.36306666666666665 | 150 |
| 0.3632 | 150 |
| 0.36333333333333334 | 150 |
| 0.36346666666666666 | 150 |
| 0.3636 | 150 |
| 0.36373333333333335 | 150 |
| 0.36386666666666667 | 150 |
| 0.364 | 150 |
| 0.3641333333333333 | 150 |
| 0.3642666666666667 | 150 |
| 0.3644 | 150 |
| 0.3645333333333333 | 150 |
| 0.36466666666666664 | 150 |
| 0.3648 | 150 |
| 0.36493333333333333 | 150 |
| 0.36506666666666665 | 150 |
| 0.3652 | 150 |
| 0.36533333333333334 | 150 |
| 0.36546666666666666 | 150 |
| 0.3656 | 150 |
| 0.36573333333333335 | 150 |
| 0.3658666666666667 | 150 |
| 0.366 | 150 |
| 0.3661333333333333 | 150 |
| 0.3662666666666667 | 150 |
| 0.3664 | 150 |
| 0.3665333333333333 | 150 |
| 0.36666666666666664 | 150 |
| 0.3668 | 150 |
| 0.36693333333333333 | 150 |
| 0.36706666666666665 | 150 |
| 0.3672 | 150 |
| 0.36733333333333335 | 150 |
| 0.36746666666666666 | 150 |
| 0.3676 | 150 |
| 0.36773333333333336 | 150 |
| 0.3678666666666667 | 150 |
| 0.368 | 150 |
| 0.3681333333333333 | 150 |
| 0.3682666666666667 | 150 |
| 0.3684 | 150 |
| 0.3685333333333333 | 150 |
| 0.36866666666666664 | 150 |
| 0.3688 | 150 |
| 0.36893333333333334 | 150 |
| 0.36906666666666665 | 150 |
| 0.3692 | 150 |
| 0.36933333333333335 | 150 |
| 0.36946666666666667 | 150 |
| 0.3696 | 150 |
| 0.36973333333333336 | 150 |
| 0.3698666666666667 | 150 |
| 0.37 | 150 |
| 0.3701333333333333 | 150 |
| 0.3702666666666667 | 150 |
| 0.3704 | 150 |
| 0.3705333333333333 | 150 |
| 0.37066666666666664 | 150 |
| 0.3708 | 150 |
| 0.37093333333333334 | 150 |
| 0.37106666666666666 | 150 |
| 0.3712 | 150 |
| 0.37133333333333335 | 150 |
| 0.37146666666666667 | 150 |
| 0.3716 | 150 |
| 0.37173333333333336 | 150 |
| 0.3718666666666667 | 150 |
| 0.372 | 150 |
| 0.3721333333333333 | 150 |
| 0.3722666666666667 | 150 |
| 0.3724 | 150 |
| 0.3725333333333333 | 150 |
| 0.37266666666666665 | 200 |
| 0.3728 | 200 |
| 0.37293333333333334 | 200 |
| 0.37306666666666666 | 200 |
| 0.3732 | 200 |
| 0.37333333333333335 | 200 |
| 0.37346666666666667 | 200 |
| 0.3736 | 200 |
| 0.3737333333333333 | 200 |
| 0.3738666666666667 | 200 |
| 0.374 | 200 |
| 0.3741333333333333 | 200 |
| 0.3742666666666667 | 200 |
| 0.3744 | 200 |
| 0.37453333333333333 | 200 |
| 0.37466666666666665 | 200 |
| 0.3748 | 200 |
| 0.37493333333333334 | 200 |
| 0.37506666666666666 | 200 |
| 0.3752 | 200 |
| 0.37533333333333335 | 200 |
| 0.37546666666666667 | 200 |
| 0.3756 | 200 |
| 0.3757333333333333 | 200 |
| 0.3758666666666667 | 200 |
| 0.376 | 200 |
| 0.3761333333333333 | 200 |
| 0.3762666666666667 | 200 |
| 0.3764 | 200 |
| 0.37653333333333333 | 200 |
| 0.37666666666666665 | 200 |
| 0.3768 | 200 |
| 0.37693333333333334 | 200 |
| 0.37706666666666666 | 200 |
| 0.3772 | 200 |
| 0.37733333333333335 | 200 |
| 0.3774666666666667 | 200 |
| 0.3776 | 200 |
| 0.3777333333333333 | 200 |
| 0.3778666666666667 | 200 |
| 0.378 | 200 |
| 0.3781333333333333 | 200 |
| 0.37826666666666664 | 200 |
| 0.3784 | 200 |
| 0.37853333333333333 | 200 |
| 0.37866666666666665 | 200 |
| 0.3788 | 200 |
| 0.37893333333333334 | 200 |
| 0.37906666666666666 | 200 |
| 0.3792 | 200 |
| 0.37933333333333336 | 200 |
| 0.3794666666666667 | 200 |
| 0.3796 | 200 |
| 0.3797333333333333 | 200 |
| 0.3798666666666667 | 200 |
| 0.38 | 200 |
| 0.3801333333333333 | 200 |
| 0.38026666666666664 | 200 |
| 0.3804 | 200 |
| 0.38053333333333333 | 200 |
| 0.38066666666666665 | 200 |
| 0.3808 | 200 |
| 0.38093333333333335 | 200 |
| 0.38106666666666666 | 200 |
| 0.3812 | 200 |
| 0.38133333333333336 | 200 |
| 0.3814666666666667 | 200 |
| 0.3816 | 200 |
| 0.3817333333333333 | 200 |
| 0.3818666666666667 | 200 |
| 0.382 | 200 |
| 0.3821333333333333 | 200 |
| 0.38226666666666664 | 200 |
| 0.3824 | 200 |
| 0.38253333333333334 | 200 |
| 0.38266666666666665 | 200 |
| 0.3828 | 200 |
| 0.38293333333333335 | 200 |
| 0.38306666666666667 | 200 |
| 0.3832 | 200 |
| 0.38333333333333336 | 200 |
| 0.3834666666666667 | 200 |
| 0.3836 | 200 |
| 0.3837333333333333 | 200 |
| 0.3838666666666667 | 200 |
| 0.384 | 200 |
| 0.3841333333333333 | 200 |
| 0.38426666666666665 | 200 |
| 0.3844 | 200 |
| 0.38453333333333334 | 200 |
| 0.38466666666666666 | 200 |
| 0.3848 | 200 |
| 0.38493333333333335 | 200 |
| 0.38506666666666667 | 200 |
| 0.3852 | 200 |
| 0.38533333333333336 | 200 |
| 0.3854666666666667 | 200 |
| 0.3856 | 200 |
| 0.3857333333333333 | 200 |
| 0.3858666666666667 | 200 |
| 0.386 | 200 |
| 0.38613333333333333 | 200 |
| 0.38626666666666665 | 200 |
| 0.3864 | 200 |
| 0.38653333333333334 | 200 |
| 0.38666666666666666 | 200 |
| 0.3868 | 200 |
| 0.38693333333333335 | 200 |
| 0.38706666666666667 | 200 |
| 0.3872 | 200 |
| 0.3873333333333333 | 200 |
| 0.3874666666666667 | 200 |
| 0.3876 | 200 |
| 0.3877333333333333 | 200 |
| 0.3878666666666667 | 200 |
| 0.388 | 200 |
| 0.38813333333333333 | 200 |
| 0.38826666666666665 | 200 |
| 0.3884 | 200 |
| 0.38853333333333334 | 200 |
| 0.38866666666666666 | 200 |
| 0.3888 | 200 |
| 0.38893333333333335 | 200 |
| 0.38906666666666667 | 200 |
| 0.3892 | 200 |
| 0.3893333333333333 | 200 |
| 0.3894666666666667 | 200 |
| 0.3896 | 200 |
| 0.3897333333333333 | 200 |
| 0.38986666666666664 | 200 |
| 0.39 | 200 |
| 0.39013333333333333 | 200 |
| 0.39026666666666665 | 200 |
| 0.3904 | 200 |
| 0.39053333333333334 | 200 |
| 0.39066666666666666 | 200 |
| 0.3908 | 200 |
| 0.39093333333333335 | 200 |
| 0.3910666666666667 | 200 |
| 0.3912 | 200 |
| 0.3913333333333333 | 200 |
| 0.3914666666666667 | 200 |
| 0.3916 | 200 |
| 0.3917333333333333 | 200 |
| 0.39186666666666664 | 200 |
| 0.392 | 200 |
| 0.39213333333333333 | 200 |
| 0.39226666666666665 | 200 |
| 0.3924 | 200 |
| 0.39253333333333335 | 200 |
| 0.39266666666666666 | 200 |
| 0.3928 | 200 |
| 0.39293333333333336 | 200 |
| 0.3930666666666667 | 200 |
| 0.3932 | 200 |
| 0.3933333333333333 | 200 |
| 0.3934666666666667 | 200 |
| 0.3936 | 200 |
| 0.3937333333333333 | 200 |
| 0.39386666666666664 | 200 |
| 0.394 | 200 |
| 0.39413333333333334 | 200 |
| 0.39426666666666665 | 200 |
| 0.3944 | 200 |
| 0.39453333333333335 | 200 |
| 0.39466666666666667 | 200 |
| 0.3948 | 200 |
| 0.39493333333333336 | 200 |
| 0.3950666666666667 | 200 |
| 0.3952 | 200 |
| 0.3953333333333333 | 200 |
| 0.3954666666666667 | 200 |
| 0.3956 | 200 |
| 0.3957333333333333 | 200 |
| 0.39586666666666664 | 200 |
| 0.396 | 200 |
| 0.39613333333333334 | 200 |
| 0.39626666666666666 | 200 |
| 0.3964 | 200 |
| 0.39653333333333335 | 200 |
| 0.39666666666666667 | 200 |
| 0.3968 | 200 |
| 0.39693333333333336 | 200 |
| 0.3970666666666667 | 200 |
| 0.3972 | 200 |
| 0.3973333333333333 | 200 |
| 0.3974666666666667 | 200 |
| 0.3976 | 200 |
| 0.3977333333333333 | 200 |
| 0.39786666666666665 | 200 |
| 0.398 | 200 |
| 0.39813333333333334 | 200 |
| 0.39826666666666666 | 200 |
| 0.3984 | 200 |
| 0.39853333333333335 | 200 |
| 0.39866666666666667 | 200 |
| 0.3988 | 200 |
| 0.3989333333333333 | 200 |
| 0.3990666666666667 | 200 |
| 0.3992 | 200 |
| 0.3993333333333333 | 200 |
| 0.3994666666666667 | 200 |
| 0.3996 | 200 |
| 0.39973333333333333 | 200 |
| 0.39986666666666665 | 200 |
| 0.4 | 200 |
| 0.40013333333333334 | 200 |
| 0.40026666666666666 | 200 |
| 0.4004 | 200 |
| 0.40053333333333335 | 200 |
| 0.40066666666666667 | 200 |
| 0.4008 | 200 |
| 0.4009333333333333 | 200 |
| 0.4010666666666667 | 200 |
| 0.4012 | 200 |
| 0.4013333333333333 | 200 |
| 0.4014666666666667 | 200 |
| 0.4016 | 200 |
| 0.40173333333333333 | 200 |
| 0.40186666666666665 | 200 |
| 0.402 | 200 |
| 0.40213333333333334 | 200 |
| 0.40226666666666666 | 200 |
| 0.4024 | 200 |
| 0.40253333333333335 | 200 |
| 0.4026666666666667 | 200 |
| 0.4028 | 200 |
| 0.4029333333333333 | 200 |
| 0.4030666666666667 | 200 |
| 0.4032 | 200 |
| 0.4033333333333333 | 200 |
| 0.40346666666666664 | 200 |
| 0.4036 | 200 |
| 0.40373333333333333 | 200 |
| 0.40386666666666665 | 200 |
| 0.404 | 200 |
| 0.40413333333333334 | 200 |
| 0.40426666666666666 | 200 |
| 0.4044 | 200 |
| 0.40453333333333336 | 200 |
| 0.4046666666666667 | 200 |
| 0.4048 | 200 |
| 0.4049333333333333 | 200 |
| 0.4050666666666667 | 200 |
| 0.4052 | 200 |
| 0.4053333333333333 | 200 |
| 0.40546666666666664 | 200 |
| 0.4056 | 200 |
| 0.40573333333333333 | 200 |
| 0.40586666666666665 | 200 |
| 0.406 | 200 |
| 0.40613333333333335 | 200 |
| 0.40626666666666666 | 200 |
| 0.4064 | 200 |
| 0.40653333333333336 | 200 |
| 0.4066666666666667 | 200 |
| 0.4068 | 200 |
| 0.4069333333333333 | 200 |
| 0.4070666666666667 | 200 |
| 0.4072 | 200 |
| 0.4073333333333333 | 200 |
| 0.40746666666666664 | 200 |
| 0.4076 | 200 |
| 0.40773333333333334 | 200 |
| 0.40786666666666666 | 250 |
| 0.408 | 250 |
| 0.40813333333333335 | 250 |
| 0.40826666666666667 | 250 |
| 0.4084 | 250 |
| 0.40853333333333336 | 250 |
| 0.4086666666666667 | 250 |
| 0.4088 | 250 |
| 0.4089333333333333 | 250 |
| 0.4090666666666667 | 250 |
| 0.4092 | 250 |
| 0.4093333333333333 | 250 |
| 0.40946666666666665 | 250 |
| 0.4096 | 250 |
| 0.40973333333333334 | 250 |
| 0.40986666666666666 | 250 |
| 0.41 | 250 |
| 0.41013333333333335 | 250 |
| 0.41026666666666667 | 250 |
| 0.4104 | 250 |
| 0.4105333333333333 | 250 |
| 0.4106666666666667 | 250 |
| 0.4108 | 250 |
| 0.4109333333333333 | 250 |
| 0.4110666666666667 | 250 |
| 0.4112 | 250 |
| 0.41133333333333333 | 250 |
| 0.41146666666666665 | 250 |
| 0.4116 | 250 |
| 0.41173333333333334 | 250 |
| 0.41186666666666666 | 250 |
| 0.412 | 250 |
| 0.41213333333333335 | 250 |
| 0.41226666666666667 | 250 |
| 0.4124 | 250 |
| 0.4125333333333333 | 250 |
| 0.4126666666666667 | 250 |
| 0.4128 | 250 |
| 0.4129333333333333 | 250 |
| 0.4130666666666667 | 250 |
| 0.4132 | 250 |
| 0.41333333333333333 | 250 |
| 0.41346666666666665 | 250 |
| 0.4136 | 250 |
| 0.41373333333333334 | 250 |
| 0.41386666666666666 | 250 |
| 0.414 | 250 |
| 0.41413333333333335 | 250 |
| 0.41426666666666667 | 250 |
| 0.4144 | 250 |
| 0.4145333333333333 | 250 |
| 0.4146666666666667 | 250 |
| 0.4148 | 250 |
| 0.4149333333333333 | 250 |
| 0.41506666666666664 | 250 |
| 0.4152 | 250 |
| 0.41533333333333333 | 250 |
| 0.41546666666666665 | 250 |
| 0.4156 | 250 |
| 0.41573333333333334 | 250 |
| 0.41586666666666666 | 250 |
| 0.416 | 250 |
| 0.41613333333333336 | 250 |
| 0.4162666666666667 | 250 |
| 0.4164 | 250 |
| 0.4165333333333333 | 250 |
| 0.4166666666666667 | 250 |
| 0.4168 | 250 |
| 0.4169333333333333 | 250 |
| 0.41706666666666664 | 250 |
| 0.4172 | 250 |
| 0.41733333333333333 | 250 |
| 0.41746666666666665 | 250 |
| 0.4176 | 250 |
| 0.41773333333333335 | 250 |
| 0.41786666666666666 | 250 |
| 0.418 | 250 |
| 0.41813333333333336 | 250 |
| 0.4182666666666667 | 250 |
| 0.4184 | 250 |
| 0.4185333333333333 | 250 |
| 0.4186666666666667 | 250 |
| 0.4188 | 250 |
| 0.4189333333333333 | 250 |
| 0.41906666666666664 | 250 |
| 0.4192 | 250 |
| 0.41933333333333334 | 250 |
| 0.41946666666666665 | 250 |
| 0.4196 | 250 |
| 0.41973333333333335 | 250 |
| 0.41986666666666667 | 250 |
| 0.42 | 250 |
| 0.42013333333333336 | 250 |
| 0.4202666666666667 | 250 |
| 0.4204 | 250 |
| 0.4205333333333333 | 250 |
| 0.4206666666666667 | 250 |
| 0.4208 | 250 |
| 0.4209333333333333 | 250 |
| 0.42106666666666664 | 250 |
| 0.4212 | 250 |
| 0.42133333333333334 | 250 |
| 0.42146666666666666 | 250 |
| 0.4216 | 250 |
| 0.42173333333333335 | 250 |
| 0.42186666666666667 | 250 |
| 0.422 | 250 |
| 0.42213333333333336 | 250 |
| 0.4222666666666667 | 250 |
| 0.4224 | 250 |
| 0.4225333333333333 | 250 |
| 0.4226666666666667 | 250 |
| 0.4228 | 250 |
| 0.42293333333333333 | 250 |
| 0.42306666666666665 | 250 |
| 0.4232 | 250 |
| 0.42333333333333334 | 250 |
| 0.42346666666666666 | 250 |
| 0.4236 | 250 |
| 0.42373333333333335 | 250 |
| 0.42386666666666667 | 250 |
| 0.424 | 250 |
| 0.4241333333333333 | 250 |
| 0.4242666666666667 | 250 |
| 0.4244 | 250 |
| 0.4245333333333333 | 250 |
| 0.4246666666666667 | 250 |
| 0.4248 | 250 |
| 0.42493333333333333 | 250 |
| 0.42506666666666665 | 250 |
| 0.4252 | 250 |
| 0.42533333333333334 | 250 |
| 0.42546666666666666 | 250 |
| 0.4256 | 250 |
| 0.42573333333333335 | 250 |
| 0.42586666666666667 | 250 |
| 0.426 | 250 |
| 0.4261333333333333 | 250 |
| 0.4262666666666667 | 250 |
| 0.4264 | 250 |
| 0.4265333333333333 | 250 |
| 0.4266666666666667 | 250 |
| 0.4268 | 250 |
| 0.42693333333333333 | 250 |
| 0.42706666666666665 | 250 |
| 0.4272 | 250 |
| 0.42733333333333334 | 250 |
| 0.42746666666666666 | 250 |
| 0.4276 | 250 |
| 0.42773333333333335 | 250 |
| 0.4278666666666667 | 250 |
| 0.428 | 250 |
| 0.4281333333333333 | 250 |
| 0.4282666666666667 | 250 |
| 0.4284 | 250 |
| 0.4285333333333333 | 250 |
| 0.42866666666666664 | 250 |
| 0.4288 | 250 |
| 0.42893333333333333 | 250 |
| 0.42906666666666665 | 250 |
| 0.4292 | 250 |
| 0.42933333333333334 | 250 |
| 0.42946666666666666 | 250 |
| 0.4296 | 250 |
| 0.42973333333333336 | 250 |
| 0.4298666666666667 | 250 |
| 0.43 | 250 |
| 0.4301333333333333 | 250 |
| 0.4302666666666667 | 250 |
| 0.4304 | 250 |
| 0.4305333333333333 | 250 |
| 0.43066666666666664 | 250 |
| 0.4308 | 250 |
| 0.43093333333333333 | 250 |
| 0.43106666666666665 | 250 |
| 0.4312 | 250 |
| 0.43133333333333335 | 250 |
| 0.43146666666666667 | 250 |
| 0.4316 | 250 |
| 0.43173333333333336 | 250 |
| 0.4318666666666667 | 250 |
| 0.432 | 250 |
| 0.4321333333333333 | 250 |
| 0.4322666666666667 | 250 |
| 0.4324 | 250 |
| 0.4325333333333333 | 250 |
| 0.43266666666666664 | 250 |
| 0.4328 | 250 |
| 0.43293333333333334 | 250 |
| 0.43306666666666666 | 250 |
| 0.4332 | 250 |
| 0.43333333333333335 | 250 |
| 0.43346666666666667 | 250 |
| 0.4336 | 250 |
| 0.43373333333333336 | 250 |
| 0.4338666666666667 | 250 |
| 0.434 | 250 |
| 0.4341333333333333 | 250 |
| 0.4342666666666667 | 250 |
| 0.4344 | 250 |
| 0.4345333333333333 | 250 |
| 0.43466666666666665 | 250 |
| 0.4348 | 250 |
| 0.43493333333333334 | 250 |
| 0.43506666666666666 | 250 |
| 0.4352 | 250 |
| 0.43533333333333335 | 250 |
| 0.43546666666666667 | 250 |
| 0.4356 | 250 |
| 0.4357333333333333 | 250 |
| 0.4358666666666667 | 250 |
| 0.436 | 250 |
| 0.4361333333333333 | 250 |
| 0.4362666666666667 | 250 |
| 0.4364 | 250 |
| 0.43653333333333333 | 250 |
| 0.43666666666666665 | 250 |
| 0.4368 | 250 |
| 0.43693333333333334 | 250 |
| 0.43706666666666666 | 250 |
| 0.4372 | 250 |
| 0.43733333333333335 | 250 |
| 0.43746666666666667 | 250 |
| 0.4376 | 250 |
| 0.4377333333333333 | 250 |
| 0.4378666666666667 | 250 |
| 0.438 | 250 |
| 0.4381333333333333 | 250 |
| 0.4382666666666667 | 250 |
| 0.4384 | 250 |
| 0.43853333333333333 | 250 |
| 0.43866666666666665 | 250 |
| 0.4388 | 250 |
| 0.43893333333333334 | 250 |
| 0.43906666666666666 | 250 |
| 0.4392 | 250 |
| 0.43933333333333335 | 250 |
| 0.43946666666666667 | 250 |
| 0.4396 | 250 |
| 0.4397333333333333 | 250 |
| 0.4398666666666667 | 250 |
| 0.44 | 250 |
| 0.4401333333333333 | 250 |
| 0.44026666666666664 | 250 |
| 0.4404 | 250 |
| 0.44053333333333333 | 250 |
| 0.44066666666666665 | 250 |
| 0.4408 | 250 |
| 0.44093333333333334 | 250 |
| 0.44106666666666666 | 250 |
| 0.4412 | 250 |
| 0.44133333333333336 | 250 |
| 0.4414666666666667 | 250 |
| 0.4416 | 250 |
| 0.4417333333333333 | 250 |
| 0.4418666666666667 | 250 |
| 0.442 | 250 |
| 0.4421333333333333 | 250 |
| 0.44226666666666664 | 250 |
| 0.4424 | 250 |
| 0.44253333333333333 | 250 |
| 0.44266666666666665 | 300 |
| 0.4428 | 300 |
| 0.44293333333333335 | 300 |
| 0.44306666666666666 | 300 |
| 0.4432 | 300 |
| 0.44333333333333336 | 300 |
| 0.4434666666666667 | 300 |
| 0.4436 | 300 |
| 0.4437333333333333 | 300 |
| 0.4438666666666667 | 300 |
| 0.444 | 300 |
| 0.4441333333333333 | 300 |
| 0.44426666666666664 | 300 |
| 0.4444 | 300 |
| 0.44453333333333334 | 300 |
| 0.44466666666666665 | 300 |
| 0.4448 | 300 |
| 0.44493333333333335 | 300 |
| 0.44506666666666667 | 300 |
| 0.4452 | 300 |
| 0.44533333333333336 | 300 |
| 0.4454666666666667 | 300 |
| 0.4456 | 300 |
| 0.4457333333333333 | 300 |
| 0.4458666666666667 | 300 |
| 0.446 | 300 |
| 0.4461333333333333 | 300 |
| 0.44626666666666664 | 300 |
| 0.4464 | 300 |
| 0.44653333333333334 | 300 |
| 0.44666666666666666 | 300 |
| 0.4468 | 300 |
| 0.44693333333333335 | 300 |
| 0.44706666666666667 | 300 |
| 0.4472 | 300 |
| 0.44733333333333336 | 300 |
| 0.4474666666666667 | 300 |
| 0.4476 | 300 |
| 0.4477333333333333 | 300 |
| 0.4478666666666667 | 300 |
| 0.448 | 300 |
| 0.44813333333333333 | 300 |
| 0.44826666666666665 | 300 |
| 0.4484 | 300 |
| 0.44853333333333334 | 300 |
| 0.44866666666666666 | 300 |
| 0.4488 | 300 |
| 0.44893333333333335 | 300 |
| 0.44906666666666667 | 300 |
| 0.4492 | 300 |
| 0.4493333333333333 | 300 |
| 0.4494666666666667 | 300 |
| 0.4496 | 300 |
| 0.4497333333333333 | 300 |
| 0.4498666666666667 | 300 |
| 0.45 | 300 |
| 0.45013333333333333 | 300 |
| 0.45026666666666665 | 300 |
| 0.4504 | 300 |
| 0.45053333333333334 | 300 |
| 0.45066666666666666 | 300 |
| 0.4508 | 300 |
| 0.45093333333333335 | 300 |
| 0.45106666666666667 | 300 |
| 0.4512 | 300 |
| 0.4513333333333333 | 300 |
| 0.4514666666666667 | 300 |
| 0.4516 | 300 |
| 0.4517333333333333 | 300 |
| 0.4518666666666667 | 300 |
| 0.452 | 300 |
| 0.45213333333333333 | 300 |
| 0.45226666666666665 | 300 |
| 0.4524 | 300 |
| 0.45253333333333334 | 300 |
| 0.45266666666666666 | 300 |
| 0.4528 | 300 |
| 0.45293333333333335 | 300 |
| 0.4530666666666667 | 300 |
| 0.4532 | 300 |
| 0.4533333333333333 | 300 |
| 0.4534666666666667 | 300 |
| 0.4536 | 300 |
| 0.4537333333333333 | 300 |
| 0.45386666666666664 | 300 |
| 0.454 | 300 |
| 0.45413333333333333 | 300 |
| 0.45426666666666665 | 300 |
| 0.4544 | 300 |
| 0.45453333333333334 | 300 |
| 0.45466666666666666 | 300 |
| 0.4548 | 300 |
| 0.45493333333333336 | 300 |
| 0.4550666666666667 | 300 |
| 0.4552 | 300 |
| 0.4553333333333333 | 300 |
| 0.4554666666666667 | 300 |
| 0.4556 | 300 |
| 0.4557333333333333 | 300 |
| 0.45586666666666664 | 300 |
| 0.456 | 300 |
| 0.45613333333333334 | 300 |
| 0.45626666666666665 | 300 |
| 0.4564 | 300 |
| 0.45653333333333335 | 300 |
| 0.45666666666666667 | 300 |
| 0.4568 | 300 |
| 0.45693333333333336 | 300 |
| 0.4570666666666667 | 300 |
| 0.4572 | 300 |
| 0.4573333333333333 | 300 |
| 0.4574666666666667 | 300 |
| 0.4576 | 300 |
| 0.4577333333333333 | 300 |
| 0.45786666666666664 | 300 |
| 0.458 | 300 |
| 0.45813333333333334 | 300 |
| 0.45826666666666666 | 300 |
| 0.4584 | 300 |
| 0.45853333333333335 | 300 |
| 0.45866666666666667 | 300 |
| 0.4588 | 300 |
| 0.45893333333333336 | 300 |
| 0.4590666666666667 | 300 |
| 0.4592 | 300 |
| 0.4593333333333333 | 300 |
| 0.4594666666666667 | 300 |
| 0.4596 | 300 |
| 0.4597333333333333 | 300 |
| 0.45986666666666665 | 300 |
| 0.46 | 300 |
| 0.46013333333333334 | 300 |
| 0.46026666666666666 | 300 |
| 0.4604 | 300 |
| 0.46053333333333335 | 300 |
| 0.46066666666666667 | 300 |
| 0.4608 | 300 |
| 0.4609333333333333 | 300 |
| 0.4610666666666667 | 300 |
| 0.4612 | 300 |
| 0.4613333333333333 | 300 |
| 0.4614666666666667 | 300 |
| 0.4616 | 300 |
| 0.46173333333333333 | 300 |
| 0.46186666666666665 | 300 |
| 0.462 | 300 |
| 0.46213333333333334 | 300 |
| 0.46226666666666666 | 300 |
| 0.4624 | 300 |
| 0.46253333333333335 | 300 |
| 0.46266666666666667 | 300 |
| 0.4628 | 300 |
| 0.4629333333333333 | 300 |
| 0.4630666666666667 | 300 |
| 0.4632 | 300 |
| 0.4633333333333333 | 300 |
| 0.4634666666666667 | 300 |
| 0.4636 | 300 |
| 0.46373333333333333 | 300 |
| 0.46386666666666665 | 300 |
| 0.464 | 300 |
| 0.46413333333333334 | 300 |
| 0.46426666666666666 | 300 |
| 0.4644 | 300 |
| 0.46453333333333335 | 300 |
| 0.4646666666666667 | 300 |
| 0.4648 | 300 |
| 0.4649333333333333 | 300 |
| 0.4650666666666667 | 300 |
| 0.4652 | 300 |
| 0.4653333333333333 | 300 |
| 0.46546666666666664 | 300 |
| 0.4656 | 300 |
| 0.46573333333333333 | 300 |
| 0.46586666666666665 | 300 |
| 0.466 | 300 |
| 0.46613333333333334 | 300 |
| 0.46626666666666666 | 300 |
| 0.4664 | 300 |
| 0.46653333333333336 | 300 |
| 0.4666666666666667 | 300 |
| 0.4668 | 300 |
| 0.4669333333333333 | 300 |
| 0.4670666666666667 | 300 |
| 0.4672 | 300 |
| 0.4673333333333333 | 300 |
| 0.46746666666666664 | 300 |
| 0.4676 | 300 |
| 0.46773333333333333 | 300 |
| 0.46786666666666665 | 300 |
| 0.468 | 300 |
| 0.46813333333333335 | 300 |
| 0.46826666666666666 | 300 |
| 0.4684 | 300 |
| 0.46853333333333336 | 300 |
| 0.4686666666666667 | 300 |
| 0.4688 | 300 |
| 0.4689333333333333 | 300 |
| 0.4690666666666667 | 300 |
| 0.4692 | 300 |
| 0.4693333333333333 | 300 |
| 0.46946666666666664 | 300 |
| 0.4696 | 300 |
| 0.46973333333333334 | 300 |
| 0.46986666666666665 | 300 |
| 0.47 | 300 |
| 0.47013333333333335 | 300 |
| 0.47026666666666667 | 300 |
| 0.4704 | 300 |
| 0.47053333333333336 | 300 |
| 0.4706666666666667 | 300 |
| 0.4708 | 300 |
| 0.4709333333333333 | 300 |
| 0.4710666666666667 | 300 |
| 0.4712 | 300 |
| 0.4713333333333333 | 300 |
| 0.47146666666666665 | 300 |
| 0.4716 | 300 |
| 0.47173333333333334 | 300 |
| 0.47186666666666666 | 300 |
| 0.472 | 300 |
| 0.47213333333333335 | 300 |
| 0.47226666666666667 | 300 |
| 0.4724 | 300 |
| 0.47253333333333336 | 300 |
| 0.4726666666666667 | 300 |
| 0.4728 | 300 |
| 0.4729333333333333 | 300 |
| 0.4730666666666667 | 300 |
| 0.4732 | 300 |
| 0.47333333333333333 | 300 |
| 0.47346666666666665 | 300 |
| 0.4736 | 300 |
| 0.47373333333333334 | 300 |
| 0.47386666666666666 | 300 |
| 0.474 | 300 |
| 0.47413333333333335 | 300 |
| 0.47426666666666667 | 300 |
| 0.4744 | 300 |
| 0.4745333333333333 | 300 |
| 0.4746666666666667 | 300 |
| 0.4748 | 300 |
| 0.4749333333333333 | 300 |
| 0.4750666666666667 | 350 |
| 0.4752 | 350 |
| 0.47533333333333333 | 350 |
| 0.47546666666666665 | 350 |
| 0.4756 | 350 |
| 0.47573333333333334 | 350 |
| 0.47586666666666666 | 350 |
| 0.476 | 350 |
| 0.47613333333333335 | 350 |
| 0.47626666666666667 | 350 |
| 0.4764 | 350 |
| 0.4765333333333333 | 350 |
| 0.4766666666666667 | 350 |
| 0.4768 | 350 |
| 0.4769333333333333 | 350 |
| 0.4770666666666667 | 350 |
| 0.4772 | 350 |
| 0.47733333333333333 | 350 |
| 0.47746666666666665 | 350 |
| 0.4776 | 350 |
| 0.47773333333333334 | 350 |
| 0.47786666666666666 | 350 |
| 0.478 | 350 |
| 0.47813333333333335 | 350 |
| 0.4782666666666667 | 350 |
| 0.4784 | 350 |
| 0.4785333333333333 | 350 |
| 0.4786666666666667 | 350 |
| 0.4788 | 350 |
| 0.4789333333333333 | 350 |
| 0.47906666666666664 | 350 |
| 0.4792 | 350 |
| 0.47933333333333333 | 350 |
| 0.47946666666666665 | 350 |
| 0.4796 | 350 |
| 0.47973333333333334 | 350 |
| 0.47986666666666666 | 350 |
| 0.48 | 350 |
| 0.48013333333333336 | 350 |
| 0.4802666666666667 | 350 |
| 0.4804 | 350 |
| 0.4805333333333333 | 350 |
| 0.4806666666666667 | 350 |
| 0.4808 | 350 |
| 0.4809333333333333 | 350 |
| 0.48106666666666664 | 350 |
| 0.4812 | 350 |
| 0.48133333333333334 | 350 |
| 0.48146666666666665 | 350 |
| 0.4816 | 350 |
| 0.48173333333333335 | 350 |
| 0.48186666666666667 | 350 |
| 0.482 | 350 |
| 0.48213333333333336 | 350 |
| 0.4822666666666667 | 350 |
| 0.4824 | 350 |
| 0.4825333333333333 | 350 |
| 0.4826666666666667 | 350 |
| 0.4828 | 350 |
| 0.4829333333333333 | 350 |
| 0.48306666666666664 | 350 |
| 0.4832 | 350 |
| 0.48333333333333334 | 350 |
| 0.48346666666666666 | 350 |
| 0.4836 | 350 |
| 0.48373333333333335 | 350 |
| 0.48386666666666667 | 350 |
| 0.484 | 350 |
| 0.48413333333333336 | 350 |
| 0.4842666666666667 | 350 |
| 0.4844 | 350 |
| 0.4845333333333333 | 350 |
| 0.4846666666666667 | 350 |
| 0.4848 | 350 |
| 0.4849333333333333 | 350 |
| 0.48506666666666665 | 350 |
| 0.4852 | 350 |
| 0.48533333333333334 | 350 |
| 0.48546666666666666 | 350 |
| 0.4856 | 350 |
| 0.48573333333333335 | 350 |
| 0.48586666666666667 | 350 |
| 0.486 | 350 |
| 0.4861333333333333 | 350 |
| 0.4862666666666667 | 350 |
| 0.4864 | 350 |
| 0.4865333333333333 | 350 |
| 0.4866666666666667 | 350 |
| 0.4868 | 350 |
| 0.48693333333333333 | 350 |
| 0.48706666666666665 | 350 |
| 0.4872 | 350 |
| 0.48733333333333334 | 350 |
| 0.48746666666666666 | 350 |
| 0.4876 | 350 |
| 0.48773333333333335 | 350 |
| 0.48786666666666667 | 350 |
| 0.488 | 350 |
| 0.4881333333333333 | 350 |
| 0.4882666666666667 | 350 |
| 0.4884 | 350 |
| 0.4885333333333333 | 350 |
| 0.4886666666666667 | 350 |
| 0.4888 | 350 |
| 0.48893333333333333 | 350 |
| 0.48906666666666665 | 350 |
| 0.4892 | 350 |
| 0.48933333333333334 | 350 |
| 0.48946666666666666 | 350 |
| 0.4896 | 350 |
| 0.48973333333333335 | 350 |
| 0.4898666666666667 | 350 |
| 0.49 | 350 |
| 0.4901333333333333 | 350 |
| 0.4902666666666667 | 350 |
| 0.4904 | 350 |
| 0.4905333333333333 | 350 |
| 0.49066666666666664 | 350 |
| 0.4908 | 350 |
| 0.49093333333333333 | 350 |
| 0.49106666666666665 | 350 |
| 0.4912 | 350 |
| 0.49133333333333334 | 350 |
| 0.49146666666666666 | 350 |
| 0.4916 | 350 |
| 0.49173333333333336 | 350 |
| 0.4918666666666667 | 350 |
| 0.492 | 350 |
| 0.4921333333333333 | 350 |
| 0.4922666666666667 | 350 |
| 0.4924 | 350 |
| 0.4925333333333333 | 350 |
| 0.49266666666666664 | 350 |
| 0.4928 | 350 |
| 0.49293333333333333 | 350 |
| 0.49306666666666665 | 350 |
| 0.4932 | 350 |
| 0.49333333333333335 | 350 |
| 0.49346666666666666 | 350 |
| 0.4936 | 350 |
| 0.49373333333333336 | 350 |
| 0.4938666666666667 | 350 |
| 0.494 | 350 |
| 0.4941333333333333 | 350 |
| 0.4942666666666667 | 350 |
| 0.4944 | 350 |
| 0.4945333333333333 | 350 |
| 0.49466666666666664 | 350 |
| 0.4948 | 350 |
| 0.49493333333333334 | 350 |
| 0.49506666666666665 | 350 |
| 0.4952 | 350 |
| 0.49533333333333335 | 350 |
| 0.49546666666666667 | 350 |
| 0.4956 | 350 |
| 0.49573333333333336 | 350 |
| 0.4958666666666667 | 350 |
| 0.496 | 350 |
| 0.4961333333333333 | 350 |
| 0.4962666666666667 | 350 |
| 0.4964 | 350 |
| 0.4965333333333333 | 350 |
| 0.49666666666666665 | 350 |
| 0.4968 | 350 |
| 0.49693333333333334 | 350 |
| 0.49706666666666666 | 350 |
| 0.4972 | 350 |
| 0.49733333333333335 | 350 |
| 0.49746666666666667 | 350 |
| 0.4976 | 350 |
| 0.49773333333333336 | 350 |
| 0.4978666666666667 | 350 |
| 0.498 | 350 |
| 0.4981333333333333 | 350 |
| 0.4982666666666667 | 350 |
| 0.4984 | 350 |
| 0.49853333333333333 | 350 |
| 0.49866666666666665 | 350 |
| 0.4988 | 350 |
| 0.49893333333333334 | 350 |
| 0.49906666666666666 | 350 |
| 0.4992 | 350 |
| 0.49933333333333335 | 350 |
| 0.49946666666666667 | 350 |
| 0.4996 | 350 |
| 0.4997333333333333 | 350 |
| 0.4998666666666667 | 350 |
| 0.5 | 350 |
| 0.5001333333333333 | 350 |
| 0.5002666666666666 | 350 |
| 0.5004 | 350 |
| 0.5005333333333334 | 350 |
| 0.5006666666666667 | 350 |
| 0.5008 | 350 |
| 0.5009333333333333 | 350 |
| 0.5010666666666667 | 350 |
| 0.5012 | 350 |
| 0.5013333333333333 | 350 |
| 0.5014666666666666 | 350 |
| 0.5016 | 350 |
| 0.5017333333333334 | 350 |
| 0.5018666666666667 | 350 |
| 0.502 | 350 |
| 0.5021333333333333 | 350 |
| 0.5022666666666666 | 350 |
| 0.5024 | 350 |
| 0.5025333333333334 | 350 |
| 0.5026666666666667 | 350 |
| 0.5028 | 350 |
| 0.5029333333333333 | 350 |
| 0.5030666666666667 | 350 |
| 0.5032 | 350 |
| 0.5033333333333333 | 350 |
| 0.5034666666666666 | 350 |
| 0.5036 | 350 |
| 0.5037333333333334 | 350 |
| 0.5038666666666667 | 350 |
| 0.504 | 350 |
| 0.5041333333333333 | 350 |
| 0.5042666666666666 | 350 |
| 0.5044 | 350 |
| 0.5045333333333333 | 350 |
| 0.5046666666666667 | 350 |
| 0.5048 | 350 |
| 0.5049333333333333 | 350 |
| 0.5050666666666667 | 350 |
| 0.5052 | 350 |
| 0.5053333333333333 | 350 |
| 0.5054666666666666 | 350 |
| 0.5056 | 350 |
| 0.5057333333333334 | 350 |
| 0.5058666666666667 | 350 |
| 0.506 | 350 |
| 0.5061333333333333 | 350 |
| 0.5062666666666666 | 350 |
| 0.5064 | 350 |
| 0.5065333333333333 | 350 |
| 0.5066666666666667 | 350 |
| 0.5068 | 350 |
| 0.5069333333333333 | 350 |
| 0.5070666666666667 | 350 |
| 0.5072 | 350 |
| 0.5073333333333333 | 350 |
| 0.5074666666666666 | 350 |
| 0.5076 | 350 |
| 0.5077333333333334 | 350 |
| 0.5078666666666667 | 350 |
| 0.508 | 400 |
| 0.5081333333333333 | 400 |
| 0.5082666666666666 | 400 |
| 0.5084 | 400 |
| 0.5085333333333333 | 400 |
| 0.5086666666666667 | 400 |
| 0.5088 | 400 |
| 0.5089333333333333 | 400 |
| 0.5090666666666667 | 400 |
| 0.5092 | 400 |
| 0.5093333333333333 | 400 |
| 0.5094666666666666 | 400 |
| 0.5096 | 400 |
| 0.5097333333333334 | 400 |
| 0.5098666666666667 | 400 |
| 0.51 | 400 |
| 0.5101333333333333 | 400 |
| 0.5102666666666666 | 400 |
| 0.5104 | 400 |
| 0.5105333333333333 | 400 |
| 0.5106666666666667 | 400 |
| 0.5108 | 400 |
| 0.5109333333333334 | 400 |
| 0.5110666666666667 | 400 |
| 0.5112 | 400 |
| 0.5113333333333333 | 400 |
| 0.5114666666666666 | 400 |
| 0.5116 | 400 |
| 0.5117333333333334 | 400 |
| 0.5118666666666667 | 400 |
| 0.512 | 400 |
| 0.5121333333333333 | 400 |
| 0.5122666666666666 | 400 |
| 0.5124 | 400 |
| 0.5125333333333333 | 400 |
| 0.5126666666666667 | 400 |
| 0.5128 | 400 |
| 0.5129333333333334 | 400 |
| 0.5130666666666667 | 400 |
| 0.5132 | 400 |
| 0.5133333333333333 | 400 |
| 0.5134666666666666 | 400 |
| 0.5136 | 400 |
| 0.5137333333333334 | 400 |
| 0.5138666666666667 | 400 |
| 0.514 | 400 |
| 0.5141333333333333 | 400 |
| 0.5142666666666666 | 400 |
| 0.5144 | 400 |
| 0.5145333333333333 | 400 |
| 0.5146666666666667 | 400 |
| 0.5148 | 400 |
| 0.5149333333333334 | 400 |
| 0.5150666666666667 | 400 |
| 0.5152 | 400 |
| 0.5153333333333333 | 400 |
| 0.5154666666666666 | 400 |
| 0.5156 | 400 |
| 0.5157333333333334 | 400 |
| 0.5158666666666667 | 400 |
| 0.516 | 400 |
| 0.5161333333333333 | 400 |
| 0.5162666666666667 | 400 |
| 0.5164 | 400 |
| 0.5165333333333333 | 400 |
| 0.5166666666666667 | 400 |
| 0.5168 | 400 |
| 0.5169333333333334 | 400 |
| 0.5170666666666667 | 400 |
| 0.5172 | 400 |
| 0.5173333333333333 | 400 |
| 0.5174666666666666 | 400 |
| 0.5176 | 400 |
| 0.5177333333333334 | 400 |
| 0.5178666666666667 | 400 |
| 0.518 | 400 |
| 0.5181333333333333 | 400 |
| 0.5182666666666667 | 400 |
| 0.5184 | 400 |
| 0.5185333333333333 | 400 |
| 0.5186666666666667 | 400 |
| 0.5188 | 400 |
| 0.5189333333333334 | 400 |
| 0.5190666666666667 | 400 |
| 0.5192 | 400 |
| 0.5193333333333333 | 400 |
| 0.5194666666666666 | 400 |
| 0.5196 | 400 |
| 0.5197333333333334 | 400 |
| 0.5198666666666667 | 400 |
| 0.52 | 400 |
| 0.5201333333333333 | 400 |
| 0.5202666666666667 | 400 |
| 0.5204 | 400 |
| 0.5205333333333333 | 400 |
| 0.5206666666666667 | 400 |
| 0.5208 | 400 |
| 0.5209333333333334 | 400 |
| 0.5210666666666667 | 400 |
| 0.5212 | 400 |
| 0.5213333333333333 | 400 |
| 0.5214666666666666 | 400 |
| 0.5216 | 400 |
| 0.5217333333333334 | 400 |
| 0.5218666666666667 | 400 |
| 0.522 | 400 |
| 0.5221333333333333 | 400 |
| 0.5222666666666667 | 400 |
| 0.5224 | 400 |
| 0.5225333333333333 | 400 |
| 0.5226666666666666 | 400 |
| 0.5228 | 400 |
| 0.5229333333333334 | 400 |
| 0.5230666666666667 | 400 |
| 0.5232 | 400 |
| 0.5233333333333333 | 400 |
| 0.5234666666666666 | 400 |
| 0.5236 | 400 |
| 0.5237333333333334 | 400 |
| 0.5238666666666667 | 400 |
| 0.524 | 400 |
| 0.5241333333333333 | 400 |
| 0.5242666666666667 | 400 |
| 0.5244 | 400 |
| 0.5245333333333333 | 400 |
| 0.5246666666666666 | 400 |
| 0.5248 | 400 |
| 0.5249333333333334 | 400 |
| 0.5250666666666667 | 400 |
| 0.5252 | 400 |
| 0.5253333333333333 | 400 |
| 0.5254666666666666 | 400 |
| 0.5256 | 400 |
| 0.5257333333333334 | 400 |
| 0.5258666666666667 | 400 |
| 0.526 | 400 |
| 0.5261333333333333 | 400 |
| 0.5262666666666667 | 400 |
| 0.5264 | 400 |
| 0.5265333333333333 | 400 |
| 0.5266666666666666 | 400 |
| 0.5268 | 400 |
| 0.5269333333333334 | 400 |
| 0.5270666666666667 | 400 |
| 0.5272 | 400 |
| 0.5273333333333333 | 400 |
| 0.5274666666666666 | 400 |
| 0.5276 | 400 |
| 0.5277333333333334 | 400 |
| 0.5278666666666667 | 400 |
| 0.528 | 400 |
| 0.5281333333333333 | 400 |
| 0.5282666666666667 | 400 |
| 0.5284 | 400 |
| 0.5285333333333333 | 400 |
| 0.5286666666666666 | 400 |
| 0.5288 | 400 |
| 0.5289333333333334 | 400 |
| 0.5290666666666667 | 400 |
| 0.5292 | 400 |
| 0.5293333333333333 | 400 |
| 0.5294666666666666 | 400 |
| 0.5296 | 400 |
| 0.5297333333333333 | 400 |
| 0.5298666666666667 | 400 |
| 0.53 | 400 |
| 0.5301333333333333 | 400 |
| 0.5302666666666667 | 400 |
| 0.5304 | 400 |
| 0.5305333333333333 | 400 |
| 0.5306666666666666 | 400 |
| 0.5308 | 400 |
| 0.5309333333333334 | 400 |
| 0.5310666666666667 | 400 |
| 0.5312 | 400 |
| 0.5313333333333333 | 400 |
| 0.5314666666666666 | 400 |
| 0.5316 | 400 |
| 0.5317333333333333 | 400 |
| 0.5318666666666667 | 400 |
| 0.532 | 400 |
| 0.5321333333333333 | 400 |
| 0.5322666666666667 | 400 |
| 0.5324 | 400 |
| 0.5325333333333333 | 400 |
| 0.5326666666666666 | 400 |
| 0.5328 | 400 |
| 0.5329333333333334 | 400 |
| 0.5330666666666667 | 400 |
| 0.5332 | 400 |
| 0.5333333333333333 | 400 |
| 0.5334666666666666 | 400 |
| 0.5336 | 400 |
| 0.5337333333333333 | 400 |
| 0.5338666666666667 | 400 |
| 0.534 | 400 |
| 0.5341333333333333 | 450 |
| 0.5342666666666667 | 450 |
| 0.5344 | 450 |
| 0.5345333333333333 | 450 |
| 0.5346666666666666 | 450 |
| 0.5348 | 450 |
| 0.5349333333333334 | 450 |
| 0.5350666666666667 | 450 |
| 0.5352 | 450 |
| 0.5353333333333333 | 450 |
| 0.5354666666666666 | 450 |
| 0.5356 | 450 |
| 0.5357333333333333 | 450 |
| 0.5358666666666667 | 450 |
| 0.536 | 450 |
| 0.5361333333333334 | 450 |
| 0.5362666666666667 | 450 |
| 0.5364 | 450 |
| 0.5365333333333333 | 450 |
| 0.5366666666666666 | 450 |
| 0.5368 | 450 |
| 0.5369333333333334 | 450 |
| 0.5370666666666667 | 450 |
| 0.5372 | 450 |
| 0.5373333333333333 | 450 |
| 0.5374666666666666 | 450 |
| 0.5376 | 450 |
| 0.5377333333333333 | 450 |
| 0.5378666666666667 | 450 |
| 0.538 | 450 |
| 0.5381333333333334 | 450 |
| 0.5382666666666667 | 450 |
| 0.5384 | 450 |
| 0.5385333333333333 | 450 |
| 0.5386666666666666 | 450 |
| 0.5388 | 450 |
| 0.5389333333333334 | 450 |
| 0.5390666666666667 | 450 |
| 0.5392 | 450 |
| 0.5393333333333333 | 450 |
| 0.5394666666666666 | 450 |
| 0.5396 | 450 |
| 0.5397333333333333 | 450 |
| 0.5398666666666667 | 450 |
| 0.54 | 450 |
| 0.5401333333333334 | 450 |
| 0.5402666666666667 | 450 |
| 0.5404 | 450 |
| 0.5405333333333333 | 450 |
| 0.5406666666666666 | 450 |
| 0.5408 | 450 |
| 0.5409333333333334 | 450 |
| 0.5410666666666667 | 450 |
| 0.5412 | 450 |
| 0.5413333333333333 | 450 |
| 0.5414666666666667 | 450 |
| 0.5416 | 450 |
| 0.5417333333333333 | 450 |
| 0.5418666666666667 | 450 |
| 0.542 | 450 |
| 0.5421333333333334 | 450 |
| 0.5422666666666667 | 450 |
| 0.5424 | 450 |
| 0.5425333333333333 | 450 |
| 0.5426666666666666 | 450 |
| 0.5428 | 450 |
| 0.5429333333333334 | 450 |
| 0.5430666666666667 | 450 |
| 0.5432 | 450 |
| 0.5433333333333333 | 450 |
| 0.5434666666666667 | 450 |
| 0.5436 | 450 |
| 0.5437333333333333 | 450 |
| 0.5438666666666667 | 450 |
| 0.544 | 450 |
| 0.5441333333333334 | 450 |
| 0.5442666666666667 | 450 |
| 0.5444 | 450 |
| 0.5445333333333333 | 450 |
| 0.5446666666666666 | 450 |
| 0.5448 | 450 |
| 0.5449333333333334 | 450 |
| 0.5450666666666667 | 450 |
| 0.5452 | 450 |
| 0.5453333333333333 | 450 |
| 0.5454666666666667 | 450 |
| 0.5456 | 450 |
| 0.5457333333333333 | 450 |
| 0.5458666666666666 | 450 |
| 0.546 | 450 |
| 0.5461333333333334 | 450 |
| 0.5462666666666667 | 450 |
| 0.5464 | 450 |
| 0.5465333333333333 | 450 |
| 0.5466666666666666 | 450 |
| 0.5468 | 450 |
| 0.5469333333333334 | 450 |
| 0.5470666666666667 | 450 |
| 0.5472 | 450 |
| 0.5473333333333333 | 450 |
| 0.5474666666666667 | 450 |
| 0.5476 | 450 |
| 0.5477333333333333 | 450 |
| 0.5478666666666666 | 450 |
| 0.548 | 450 |
| 0.5481333333333334 | 450 |
| 0.5482666666666667 | 450 |
| 0.5484 | 450 |
| 0.5485333333333333 | 450 |
| 0.5486666666666666 | 450 |
| 0.5488 | 450 |
| 0.5489333333333334 | 450 |
| 0.5490666666666667 | 450 |
| 0.5492 | 450 |
| 0.5493333333333333 | 450 |
| 0.5494666666666667 | 450 |
| 0.5496 | 450 |
| 0.5497333333333333 | 450 |
| 0.5498666666666666 | 450 |
| 0.55 | 450 |
| 0.5501333333333334 | 450 |
| 0.5502666666666667 | 450 |
| 0.5504 | 450 |
| 0.5505333333333333 | 450 |
| 0.5506666666666666 | 450 |
| 0.5508 | 450 |
| 0.5509333333333334 | 450 |
| 0.5510666666666667 | 450 |
| 0.5512 | 450 |
| 0.5513333333333333 | 450 |
| 0.5514666666666667 | 450 |
| 0.5516 | 450 |
| 0.5517333333333333 | 450 |
| 0.5518666666666666 | 450 |
| 0.552 | 450 |
| 0.5521333333333334 | 450 |
| 0.5522666666666667 | 450 |
| 0.5524 | 450 |
| 0.5525333333333333 | 450 |
| 0.5526666666666666 | 450 |
| 0.5528 | 450 |
| 0.5529333333333334 | 450 |
| 0.5530666666666667 | 450 |
| 0.5532 | 450 |
| 0.5533333333333333 | 450 |
| 0.5534666666666667 | 450 |
| 0.5536 | 450 |
| 0.5537333333333333 | 450 |
| 0.5538666666666666 | 450 |
| 0.554 | 450 |
| 0.5541333333333334 | 450 |
| 0.5542666666666667 | 450 |
| 0.5544 | 450 |
| 0.5545333333333333 | 450 |
| 0.5546666666666666 | 450 |
| 0.5548 | 450 |
| 0.5549333333333333 | 450 |
| 0.5550666666666667 | 450 |
| 0.5552 | 500 |
| 0.5553333333333333 | 500 |
| 0.5554666666666667 | 500 |
| 0.5556 | 500 |
| 0.5557333333333333 | 500 |
| 0.5558666666666666 | 500 |
| 0.556 | 500 |
| 0.5561333333333334 | 500 |
| 0.5562666666666667 | 500 |
| 0.5564 | 500 |
| 0.5565333333333333 | 500 |
| 0.5566666666666666 | 500 |
| 0.5568 | 500 |
| 0.5569333333333333 | 500 |
| 0.5570666666666667 | 500 |
| 0.5572 | 500 |
| 0.5573333333333333 | 500 |
| 0.5574666666666667 | 500 |
| 0.5576 | 500 |
| 0.5577333333333333 | 500 |
| 0.5578666666666666 | 500 |
| 0.558 | 500 |
| 0.5581333333333334 | 500 |
| 0.5582666666666667 | 500 |
| 0.5584 | 500 |
| 0.5585333333333333 | 500 |
| 0.5586666666666666 | 500 |
| 0.5588 | 500 |
| 0.5589333333333333 | 500 |
| 0.5590666666666667 | 500 |
| 0.5592 | 500 |
| 0.5593333333333333 | 500 |
| 0.5594666666666667 | 500 |
| 0.5596 | 500 |
| 0.5597333333333333 | 500 |
| 0.5598666666666666 | 500 |
| 0.56 | 500 |
| 0.5601333333333334 | 500 |
| 0.5602666666666667 | 500 |
| 0.5604 | 500 |
| 0.5605333333333333 | 500 |
| 0.5606666666666666 | 500 |
| 0.5608 | 500 |
| 0.5609333333333333 | 500 |
| 0.5610666666666667 | 500 |
| 0.5612 | 500 |
| 0.5613333333333334 | 500 |
| 0.5614666666666667 | 500 |
| 0.5616 | 500 |
| 0.5617333333333333 | 500 |
| 0.5618666666666666 | 500 |
| 0.562 | 500 |
| 0.5621333333333334 | 500 |
| 0.5622666666666667 | 500 |
| 0.5624 | 500 |
| 0.5625333333333333 | 500 |
| 0.5626666666666666 | 500 |
| 0.5628 | 500 |
| 0.5629333333333333 | 500 |
| 0.5630666666666667 | 500 |
| 0.5632 | 500 |
| 0.5633333333333334 | 500 |
| 0.5634666666666667 | 500 |
| 0.5636 | 500 |
| 0.5637333333333333 | 500 |
| 0.5638666666666666 | 500 |
| 0.564 | 500 |
| 0.5641333333333334 | 500 |
| 0.5642666666666667 | 500 |
| 0.5644 | 500 |
| 0.5645333333333333 | 500 |
| 0.5646666666666667 | 500 |
| 0.5648 | 500 |
| 0.5649333333333333 | 500 |
| 0.5650666666666667 | 500 |
| 0.5652 | 500 |
| 0.5653333333333334 | 500 |
| 0.5654666666666667 | 500 |
| 0.5656 | 500 |
| 0.5657333333333333 | 500 |
| 0.5658666666666666 | 500 |
| 0.566 | 500 |
| 0.5661333333333334 | 500 |
| 0.5662666666666667 | 500 |
| 0.5664 | 500 |
| 0.5665333333333333 | 500 |
| 0.5666666666666667 | 500 |
| 0.5668 | 500 |
| 0.5669333333333333 | 500 |
| 0.5670666666666667 | 500 |
| 0.5672 | 500 |
| 0.5673333333333334 | 500 |
| 0.5674666666666667 | 500 |
| 0.5676 | 500 |
| 0.5677333333333333 | 500 |
| 0.5678666666666666 | 500 |
| 0.568 | 500 |
| 0.5681333333333334 | 500 |
| 0.5682666666666667 | 500 |
| 0.5684 | 500 |
| 0.5685333333333333 | 500 |
| 0.5686666666666667 | 500 |
| 0.5688 | 500 |
| 0.5689333333333333 | 500 |
| 0.5690666666666667 | 500 |
| 0.5692 | 500 |
| 0.5693333333333334 | 500 |
| 0.5694666666666667 | 500 |
| 0.5696 | 500 |
| 0.5697333333333333 | 500 |
| 0.5698666666666666 | 500 |
| 0.57 | 500 |
| 0.5701333333333334 | 500 |
| 0.5702666666666667 | 500 |
| 0.5704 | 500 |
| 0.5705333333333333 | 500 |
| 0.5706666666666667 | 500 |
| 0.5708 | 500 |
| 0.5709333333333333 | 500 |
| 0.5710666666666666 | 500 |
| 0.5712 | 500 |
| 0.5713333333333334 | 500 |
| 0.5714666666666667 | 500 |
| 0.5716 | 500 |
| 0.5717333333333333 | 500 |
| 0.5718666666666666 | 500 |
| 0.572 | 500 |
| 0.5721333333333334 | 500 |
| 0.5722666666666667 | 500 |
| 0.5724 | 500 |
| 0.5725333333333333 | 500 |
| 0.5726666666666667 | 500 |
| 0.5728 | 500 |
| 0.5729333333333333 | 500 |
| 0.5730666666666666 | 500 |
| 0.5732 | 500 |
| 0.5733333333333334 | 500 |
| 0.5734666666666667 | 500 |
| 0.5736 | 500 |
| 0.5737333333333333 | 500 |
| 0.5738666666666666 | 500 |
| 0.574 | 500 |
| 0.5741333333333334 | 500 |
| 0.5742666666666667 | 500 |
| 0.5744 | 500 |
| 0.5745333333333333 | 500 |
| 0.5746666666666667 | 500 |
| 0.5748 | 500 |
| 0.5749333333333333 | 500 |
| 0.5750666666666666 | 500 |
| 0.5752 | 500 |
| 0.5753333333333334 | 500 |
| 0.5754666666666667 | 500 |
| 0.5756 | 500 |
| 0.5757333333333333 | 500 |
| 0.5758666666666666 | 500 |
| 0.576 | 500 |
| 0.5761333333333334 | 500 |
| 0.5762666666666667 | 500 |
| 0.5764 | 500 |
| 0.5765333333333333 | 500 |
| 0.5766666666666667 | 500 |
| 0.5768 | 500 |
| 0.5769333333333333 | 500 |
| 0.5770666666666666 | 500 |
| 0.5772 | 500 |
| 0.5773333333333334 | 500 |
| 0.5774666666666667 | 500 |
| 0.5776 | 500 |
| 0.5777333333333333 | 500 |
| 0.5778666666666666 | 500 |
| 0.578 | 500 |
| 0.5781333333333334 | 500 |
| 0.5782666666666667 | 500 |
| 0.5784 | 500 |
| 0.5785333333333333 | 500 |
| 0.5786666666666667 | 550 |
| 0.5788 | 550 |
| 0.5789333333333333 | 550 |
| 0.5790666666666666 | 550 |
| 0.5792 | 550 |
| 0.5793333333333334 | 550 |
| 0.5794666666666667 | 550 |
| 0.5796 | 550 |
| 0.5797333333333333 | 550 |
| 0.5798666666666666 | 550 |
| 0.58 | 550 |
| 0.5801333333333333 | 550 |
| 0.5802666666666667 | 550 |
| 0.5804 | 550 |
| 0.5805333333333333 | 550 |
| 0.5806666666666667 | 550 |
| 0.5808 | 550 |
| 0.5809333333333333 | 550 |
| 0.5810666666666666 | 550 |
| 0.5812 | 550 |
| 0.5813333333333334 | 550 |
| 0.5814666666666667 | 550 |
| 0.5816 | 550 |
| 0.5817333333333333 | 550 |
| 0.5818666666666666 | 550 |
| 0.582 | 550 |
| 0.5821333333333333 | 550 |
| 0.5822666666666667 | 550 |
| 0.5824 | 550 |
| 0.5825333333333333 | 550 |
| 0.5826666666666667 | 550 |
| 0.5828 | 550 |
| 0.5829333333333333 | 550 |
| 0.5830666666666666 | 550 |
| 0.5832 | 550 |
| 0.5833333333333334 | 550 |
| 0.5834666666666667 | 550 |
| 0.5836 | 550 |
| 0.5837333333333333 | 550 |
| 0.5838666666666666 | 550 |
| 0.584 | 550 |
| 0.5841333333333333 | 550 |
| 0.5842666666666667 | 550 |
| 0.5844 | 550 |
| 0.5845333333333333 | 550 |
| 0.5846666666666667 | 550 |
| 0.5848 | 550 |
| 0.5849333333333333 | 550 |
| 0.5850666666666666 | 550 |
| 0.5852 | 550 |
| 0.5853333333333334 | 550 |
| 0.5854666666666667 | 550 |
| 0.5856 | 550 |
| 0.5857333333333333 | 550 |
| 0.5858666666666666 | 550 |
| 0.586 | 550 |
| 0.5861333333333333 | 550 |
| 0.5862666666666667 | 550 |
| 0.5864 | 550 |
| 0.5865333333333334 | 550 |
| 0.5866666666666667 | 550 |
| 0.5868 | 550 |
| 0.5869333333333333 | 550 |
| 0.5870666666666666 | 550 |
| 0.5872 | 550 |
| 0.5873333333333334 | 550 |
| 0.5874666666666667 | 550 |
| 0.5876 | 550 |
| 0.5877333333333333 | 550 |
| 0.5878666666666666 | 550 |
| 0.588 | 550 |
| 0.5881333333333333 | 550 |
| 0.5882666666666667 | 550 |
| 0.5884 | 550 |
| 0.5885333333333334 | 550 |
| 0.5886666666666667 | 550 |
| 0.5888 | 550 |
| 0.5889333333333333 | 550 |
| 0.5890666666666666 | 550 |
| 0.5892 | 550 |
| 0.5893333333333334 | 550 |
| 0.5894666666666667 | 550 |
| 0.5896 | 550 |
| 0.5897333333333333 | 550 |
| 0.5898666666666667 | 550 |
| 0.59 | 550 |
| 0.5901333333333333 | 550 |
| 0.5902666666666667 | 550 |
| 0.5904 | 550 |
| 0.5905333333333334 | 550 |
| 0.5906666666666667 | 550 |
| 0.5908 | 550 |
| 0.5909333333333333 | 550 |
| 0.5910666666666666 | 550 |
| 0.5912 | 550 |
| 0.5913333333333334 | 550 |
| 0.5914666666666667 | 550 |
| 0.5916 | 550 |
| 0.5917333333333333 | 550 |
| 0.5918666666666667 | 550 |
| 0.592 | 550 |
| 0.5921333333333333 | 550 |
| 0.5922666666666667 | 550 |
| 0.5924 | 550 |
| 0.5925333333333334 | 550 |
| 0.5926666666666667 | 550 |
| 0.5928 | 550 |
| 0.5929333333333333 | 550 |
| 0.5930666666666666 | 550 |
| 0.5932 | 550 |
| 0.5933333333333334 | 550 |
| 0.5934666666666667 | 550 |
| 0.5936 | 550 |
| 0.5937333333333333 | 550 |
| 0.5938666666666667 | 550 |
| 0.594 | 550 |
| 0.5941333333333333 | 550 |
| 0.5942666666666667 | 550 |
| 0.5944 | 550 |
| 0.5945333333333334 | 550 |
| 0.5946666666666667 | 550 |
| 0.5948 | 550 |
| 0.5949333333333333 | 550 |
| 0.5950666666666666 | 550 |
| 0.5952 | 550 |
| 0.5953333333333334 | 550 |
| 0.5954666666666667 | 550 |
| 0.5956 | 550 |
| 0.5957333333333333 | 550 |
| 0.5958666666666667 | 550 |
| 0.596 | 550 |
| 0.5961333333333333 | 550 |
| 0.5962666666666666 | 550 |
| 0.5964 | 550 |
| 0.5965333333333334 | 550 |
| 0.5966666666666667 | 550 |
| 0.5968 | 550 |
| 0.5969333333333333 | 550 |
| 0.5970666666666666 | 550 |
| 0.5972 | 550 |
| 0.5973333333333334 | 550 |
| 0.5974666666666667 | 550 |
| 0.5976 | 550 |
| 0.5977333333333333 | 550 |
| 0.5978666666666667 | 550 |
| 0.598 | 550 |
| 0.5981333333333333 | 550 |
| 0.5982666666666666 | 550 |
| 0.5984 | 550 |
| 0.5985333333333334 | 550 |
| 0.5986666666666667 | 550 |
| 0.5988 | 550 |
| 0.5989333333333333 | 550 |
| 0.5990666666666666 | 550 |
| 0.5992 | 550 |
| 0.5993333333333334 | 550 |
| 0.5994666666666667 | 550 |
| 0.5996 | 550 |
| 0.5997333333333333 | 550 |
| 0.5998666666666667 | 550 |
| 0.6 | 550 |
| 0.6001333333333333 | 550 |
| 0.6002666666666666 | 550 |
| 0.6004 | 550 |
| 0.6005333333333334 | 550 |
| 0.6006666666666667 | 600 |
| 0.6008 | 600 |
| 0.6009333333333333 | 600 |
| 0.6010666666666666 | 600 |
| 0.6012 | 600 |
| 0.6013333333333334 | 600 |
| 0.6014666666666667 | 600 |
| 0.6016 | 600 |
| 0.6017333333333333 | 600 |
| 0.6018666666666667 | 600 |
| 0.602 | 600 |
| 0.6021333333333333 | 600 |
| 0.6022666666666666 | 600 |
| 0.6024 | 600 |
| 0.6025333333333334 | 600 |
| 0.6026666666666667 | 600 |
| 0.6028 | 600 |
| 0.6029333333333333 | 600 |
| 0.6030666666666666 | 600 |
| 0.6032 | 600 |
| 0.6033333333333334 | 600 |
| 0.6034666666666667 | 600 |
| 0.6036 | 600 |
| 0.6037333333333333 | 600 |
| 0.6038666666666667 | 600 |
| 0.604 | 600 |
| 0.6041333333333333 | 600 |
| 0.6042666666666666 | 600 |
| 0.6044 | 600 |
| 0.6045333333333334 | 600 |
| 0.6046666666666667 | 600 |
| 0.6048 | 600 |
| 0.6049333333333333 | 600 |
| 0.6050666666666666 | 600 |
| 0.6052 | 600 |
| 0.6053333333333333 | 600 |
| 0.6054666666666667 | 600 |
| 0.6056 | 600 |
| 0.6057333333333333 | 600 |
| 0.6058666666666667 | 600 |
| 0.606 | 600 |
| 0.6061333333333333 | 600 |
| 0.6062666666666666 | 600 |
| 0.6064 | 600 |
| 0.6065333333333334 | 600 |
| 0.6066666666666667 | 600 |
| 0.6068 | 600 |
| 0.6069333333333333 | 600 |
| 0.6070666666666666 | 600 |
| 0.6072 | 600 |
| 0.6073333333333333 | 600 |
| 0.6074666666666667 | 600 |
| 0.6076 | 600 |
| 0.6077333333333333 | 600 |
| 0.6078666666666667 | 600 |
| 0.608 | 600 |
| 0.6081333333333333 | 600 |
| 0.6082666666666666 | 600 |
| 0.6084 | 600 |
| 0.6085333333333334 | 600 |
| 0.6086666666666667 | 600 |
| 0.6088 | 600 |
| 0.6089333333333333 | 600 |
| 0.6090666666666666 | 600 |
| 0.6092 | 600 |
| 0.6093333333333333 | 600 |
| 0.6094666666666667 | 600 |
| 0.6096 | 600 |
| 0.6097333333333333 | 600 |
| 0.6098666666666667 | 600 |
| 0.61 | 600 |
| 0.6101333333333333 | 600 |
| 0.6102666666666666 | 600 |
| 0.6104 | 600 |
| 0.6105333333333334 | 600 |
| 0.6106666666666667 | 600 |
| 0.6108 | 600 |
| 0.6109333333333333 | 600 |
| 0.6110666666666666 | 600 |
| 0.6112 | 600 |
| 0.6113333333333333 | 600 |
| 0.6114666666666667 | 600 |
| 0.6116 | 600 |
| 0.6117333333333334 | 600 |
| 0.6118666666666667 | 600 |
| 0.612 | 600 |
| 0.6121333333333333 | 600 |
| 0.6122666666666666 | 600 |
| 0.6124 | 600 |
| 0.6125333333333334 | 600 |
| 0.6126666666666667 | 600 |
| 0.6128 | 600 |
| 0.6129333333333333 | 600 |
| 0.6130666666666666 | 600 |
| 0.6132 | 600 |
| 0.6133333333333333 | 600 |
| 0.6134666666666667 | 600 |
| 0.6136 | 600 |
| 0.6137333333333334 | 600 |
| 0.6138666666666667 | 600 |
| 0.614 | 600 |
| 0.6141333333333333 | 600 |
| 0.6142666666666666 | 600 |
| 0.6144 | 600 |
| 0.6145333333333334 | 600 |
| 0.6146666666666667 | 600 |
| 0.6148 | 600 |
| 0.6149333333333333 | 600 |
| 0.6150666666666667 | 600 |
| 0.6152 | 600 |
| 0.6153333333333333 | 600 |
| 0.6154666666666667 | 600 |
| 0.6156 | 600 |
| 0.6157333333333334 | 600 |
| 0.6158666666666667 | 600 |
| 0.616 | 600 |
| 0.6161333333333333 | 600 |
| 0.6162666666666666 | 600 |
| 0.6164 | 600 |
| 0.6165333333333334 | 600 |
| 0.6166666666666667 | 600 |
| 0.6168 | 600 |
| 0.6169333333333333 | 600 |
| 0.6170666666666667 | 600 |
| 0.6172 | 600 |
| 0.6173333333333333 | 600 |
| 0.6174666666666667 | 600 |
| 0.6176 | 600 |
| 0.6177333333333334 | 600 |
| 0.6178666666666667 | 600 |
| 0.618 | 600 |
| 0.6181333333333333 | 600 |
| 0.6182666666666666 | 600 |
| 0.6184 | 600 |
| 0.6185333333333334 | 600 |
| 0.6186666666666667 | 600 |
| 0.6188 | 600 |
| 0.6189333333333333 | 600 |
| 0.6190666666666667 | 600 |
| 0.6192 | 650 |
| 0.6193333333333333 | 650 |
| 0.6194666666666667 | 650 |
| 0.6196 | 650 |
| 0.6197333333333334 | 650 |
| 0.6198666666666667 | 650 |
| 0.62 | 650 |
| 0.6201333333333333 | 650 |
| 0.6202666666666666 | 650 |
| 0.6204 | 650 |
| 0.6205333333333334 | 650 |
| 0.6206666666666667 | 650 |
| 0.6208 | 650 |
| 0.6209333333333333 | 650 |
| 0.6210666666666667 | 650 |
| 0.6212 | 650 |
| 0.6213333333333333 | 650 |
| 0.6214666666666666 | 650 |
| 0.6216 | 650 |
| 0.6217333333333334 | 650 |
| 0.6218666666666667 | 650 |
| 0.622 | 650 |
| 0.6221333333333333 | 650 |
| 0.6222666666666666 | 650 |
| 0.6224 | 650 |
| 0.6225333333333334 | 650 |
| 0.6226666666666667 | 650 |
| 0.6228 | 650 |
| 0.6229333333333333 | 650 |
| 0.6230666666666667 | 650 |
| 0.6232 | 650 |
| 0.6233333333333333 | 650 |
| 0.6234666666666666 | 650 |
| 0.6236 | 650 |
| 0.6237333333333334 | 650 |
| 0.6238666666666667 | 650 |
| 0.624 | 650 |
| 0.6241333333333333 | 650 |
| 0.6242666666666666 | 650 |
| 0.6244 | 650 |
| 0.6245333333333334 | 650 |
| 0.6246666666666667 | 650 |
| 0.6248 | 650 |
| 0.6249333333333333 | 650 |
| 0.6250666666666667 | 650 |
| 0.6252 | 650 |
| 0.6253333333333333 | 650 |
| 0.6254666666666666 | 650 |
| 0.6256 | 650 |
| 0.6257333333333334 | 650 |
| 0.6258666666666667 | 650 |
| 0.626 | 650 |
| 0.6261333333333333 | 650 |
| 0.6262666666666666 | 650 |
| 0.6264 | 650 |
| 0.6265333333333334 | 650 |
| 0.6266666666666667 | 650 |
| 0.6268 | 650 |
| 0.6269333333333333 | 650 |
| 0.6270666666666667 | 650 |
| 0.6272 | 650 |
| 0.6273333333333333 | 650 |
| 0.6274666666666666 | 650 |
| 0.6276 | 650 |
| 0.6277333333333334 | 650 |
| 0.6278666666666667 | 650 |
| 0.628 | 650 |
| 0.6281333333333333 | 650 |
| 0.6282666666666666 | 650 |
| 0.6284 | 650 |
| 0.6285333333333334 | 650 |
| 0.6286666666666667 | 650 |
| 0.6288 | 650 |
| 0.6289333333333333 | 650 |
| 0.6290666666666667 | 650 |
| 0.6292 | 650 |
| 0.6293333333333333 | 650 |
| 0.6294666666666666 | 650 |
| 0.6296 | 650 |
| 0.6297333333333334 | 650 |
| 0.6298666666666667 | 650 |
| 0.63 | 650 |
| 0.6301333333333333 | 650 |
| 0.6302666666666666 | 650 |
| 0.6304 | 650 |
| 0.6305333333333333 | 650 |
| 0.6306666666666667 | 650 |
| 0.6308 | 650 |
| 0.6309333333333333 | 650 |
| 0.6310666666666667 | 650 |
| 0.6312 | 650 |
| 0.6313333333333333 | 650 |
| 0.6314666666666666 | 650 |
| 0.6316 | 650 |
| 0.6317333333333334 | 650 |
| 0.6318666666666667 | 650 |
| 0.632 | 650 |
| 0.6321333333333333 | 650 |
| 0.6322666666666666 | 650 |
| 0.6324 | 650 |
| 0.6325333333333333 | 650 |
| 0.6326666666666667 | 650 |
| 0.6328 | 650 |
| 0.6329333333333333 | 650 |
| 0.6330666666666667 | 650 |
| 0.6332 | 650 |
| 0.6333333333333333 | 650 |
| 0.6334666666666666 | 650 |
| 0.6336 | 650 |
| 0.6337333333333334 | 650 |
| 0.6338666666666667 | 650 |
| 0.634 | 650 |
| 0.6341333333333333 | 650 |
| 0.6342666666666666 | 650 |
| 0.6344 | 650 |
| 0.6345333333333333 | 650 |
| 0.6346666666666667 | 650 |
| 0.6348 | 650 |
| 0.6349333333333333 | 650 |
| 0.6350666666666667 | 650 |
| 0.6352 | 650 |
| 0.6353333333333333 | 650 |
| 0.6354666666666666 | 650 |
| 0.6356 | 650 |
| 0.6357333333333334 | 650 |
| 0.6358666666666667 | 650 |
| 0.636 | 650 |
| 0.6361333333333333 | 650 |
| 0.6362666666666666 | 650 |
| 0.6364 | 650 |
| 0.6365333333333333 | 700 |
| 0.6366666666666667 | 700 |
| 0.6368 | 700 |
| 0.6369333333333334 | 700 |
| 0.6370666666666667 | 700 |
| 0.6372 | 700 |
| 0.6373333333333333 | 700 |
| 0.6374666666666666 | 700 |
| 0.6376 | 700 |
| 0.6377333333333334 | 700 |
| 0.6378666666666667 | 700 |
| 0.638 | 700 |
| 0.6381333333333333 | 700 |
| 0.6382666666666666 | 700 |
| 0.6384 | 700 |
| 0.6385333333333333 | 700 |
| 0.6386666666666667 | 700 |
| 0.6388 | 700 |
| 0.6389333333333334 | 700 |
| 0.6390666666666667 | 700 |
| 0.6392 | 700 |
| 0.6393333333333333 | 700 |
| 0.6394666666666666 | 700 |
| 0.6396 | 700 |
| 0.6397333333333334 | 700 |
| 0.6398666666666667 | 700 |
| 0.64 | 700 |
| 0.6401333333333333 | 700 |
| 0.6402666666666667 | 700 |
| 0.6404 | 700 |
| 0.6405333333333333 | 700 |
| 0.6406666666666667 | 700 |
| 0.6408 | 700 |
| 0.6409333333333334 | 700 |
| 0.6410666666666667 | 700 |
| 0.6412 | 700 |
| 0.6413333333333333 | 700 |
| 0.6414666666666666 | 700 |
| 0.6416 | 700 |
| 0.6417333333333334 | 700 |
| 0.6418666666666667 | 700 |
| 0.642 | 700 |
| 0.6421333333333333 | 700 |
| 0.6422666666666667 | 700 |
| 0.6424 | 700 |
| 0.6425333333333333 | 700 |
| 0.6426666666666667 | 700 |
| 0.6428 | 700 |
| 0.6429333333333334 | 700 |
| 0.6430666666666667 | 700 |
| 0.6432 | 700 |
| 0.6433333333333333 | 700 |
| 0.6434666666666666 | 700 |
| 0.6436 | 700 |
| 0.6437333333333334 | 700 |
| 0.6438666666666667 | 700 |
| 0.644 | 700 |
| 0.6441333333333333 | 700 |
| 0.6442666666666667 | 700 |
| 0.6444 | 700 |
| 0.6445333333333333 | 700 |
| 0.6446666666666667 | 700 |
| 0.6448 | 700 |
| 0.6449333333333334 | 700 |
| 0.6450666666666667 | 700 |
| 0.6452 | 700 |
| 0.6453333333333333 | 700 |
| 0.6454666666666666 | 700 |
| 0.6456 | 700 |
| 0.6457333333333334 | 700 |
| 0.6458666666666667 | 700 |
| 0.646 | 700 |
| 0.6461333333333333 | 700 |
| 0.6462666666666667 | 700 |
| 0.6464 | 700 |
| 0.6465333333333333 | 700 |
| 0.6466666666666666 | 700 |
| 0.6468 | 700 |
| 0.6469333333333334 | 700 |
| 0.6470666666666667 | 700 |
| 0.6472 | 700 |
| 0.6473333333333333 | 700 |
| 0.6474666666666666 | 700 |
| 0.6476 | 700 |
| 0.6477333333333334 | 700 |
| 0.6478666666666667 | 700 |
| 0.648 | 700 |
| 0.6481333333333333 | 700 |
| 0.6482666666666667 | 700 |
| 0.6484 | 700 |
| 0.6485333333333333 | 700 |
| 0.6486666666666666 | 700 |
| 0.6488 | 700 |
| 0.6489333333333334 | 700 |
| 0.6490666666666667 | 700 |
| 0.6492 | 700 |
| 0.6493333333333333 | 700 |
| 0.6494666666666666 | 700 |
| 0.6496 | 700 |
| 0.6497333333333334 | 700 |
| 0.6498666666666667 | 700 |
| 0.65 | 700 |
| 0.6501333333333333 | 700 |
| 0.6502666666666667 | 700 |
| 0.6504 | 700 |
| 0.6505333333333333 | 700 |
| 0.6506666666666666 | 700 |
| 0.6508 | 700 |
| 0.6509333333333334 | 700 |
| 0.6510666666666667 | 700 |
| 0.6512 | 700 |
| 0.6513333333333333 | 700 |
| 0.6514666666666666 | 700 |
| 0.6516 | 700 |
| 0.6517333333333334 | 700 |
| 0.6518666666666667 | 700 |
| 0.652 | 700 |
| 0.6521333333333333 | 700 |
| 0.6522666666666667 | 700 |
| 0.6524 | 700 |
| 0.6525333333333333 | 700 |
| 0.6526666666666666 | 700 |
| 0.6528 | 700 |
| 0.6529333333333334 | 700 |
| 0.6530666666666667 | 700 |
| 0.6532 | 700 |
| 0.6533333333333333 | 700 |
| 0.6534666666666666 | 700 |
| 0.6536 | 700 |
| 0.6537333333333334 | 700 |
| 0.6538666666666667 | 700 |
| 0.654 | 700 |
| 0.6541333333333333 | 700 |
| 0.6542666666666667 | 700 |
| 0.6544 | 700 |
| 0.6545333333333333 | 700 |
| 0.6546666666666666 | 700 |
| 0.6548 | 700 |
| 0.6549333333333334 | 700 |
| 0.6550666666666667 | 750 |
| 0.6552 | 750 |
| 0.6553333333333333 | 750 |
| 0.6554666666666666 | 750 |
| 0.6556 | 750 |
| 0.6557333333333333 | 750 |
| 0.6558666666666667 | 750 |
| 0.656 | 750 |
| 0.6561333333333333 | 750 |
| 0.6562666666666667 | 750 |
| 0.6564 | 750 |
| 0.6565333333333333 | 750 |
| 0.6566666666666666 | 750 |
| 0.6568 | 750 |
| 0.6569333333333334 | 750 |
| 0.6570666666666667 | 750 |
| 0.6572 | 750 |
| 0.6573333333333333 | 750 |
| 0.6574666666666666 | 750 |
| 0.6576 | 750 |
| 0.6577333333333333 | 750 |
| 0.6578666666666667 | 750 |
| 0.658 | 750 |
| 0.6581333333333333 | 750 |
| 0.6582666666666667 | 750 |
| 0.6584 | 750 |
| 0.6585333333333333 | 750 |
| 0.6586666666666666 | 750 |
| 0.6588 | 750 |
| 0.6589333333333334 | 750 |
| 0.6590666666666667 | 750 |
| 0.6592 | 750 |
| 0.6593333333333333 | 750 |
| 0.6594666666666666 | 750 |
| 0.6596 | 750 |
| 0.6597333333333333 | 750 |
| 0.6598666666666667 | 750 |
| 0.66 | 750 |
| 0.6601333333333333 | 750 |
| 0.6602666666666667 | 750 |
| 0.6604 | 750 |
| 0.6605333333333333 | 750 |
| 0.6606666666666666 | 750 |
| 0.6608 | 750 |
| 0.6609333333333334 | 750 |
| 0.6610666666666667 | 750 |
| 0.6612 | 750 |
| 0.6613333333333333 | 750 |
| 0.6614666666666666 | 750 |
| 0.6616 | 750 |
| 0.6617333333333333 | 750 |
| 0.6618666666666667 | 750 |
| 0.662 | 750 |
| 0.6621333333333334 | 750 |
| 0.6622666666666667 | 750 |
| 0.6624 | 750 |
| 0.6625333333333333 | 750 |
| 0.6626666666666666 | 750 |
| 0.6628 | 750 |
| 0.6629333333333334 | 750 |
| 0.6630666666666667 | 750 |
| 0.6632 | 750 |
| 0.6633333333333333 | 750 |
| 0.6634666666666666 | 750 |
| 0.6636 | 750 |
| 0.6637333333333333 | 750 |
| 0.6638666666666667 | 750 |
| 0.664 | 750 |
| 0.6641333333333334 | 750 |
| 0.6642666666666667 | 750 |
| 0.6644 | 750 |
| 0.6645333333333333 | 750 |
| 0.6646666666666666 | 750 |
| 0.6648 | 750 |
| 0.6649333333333334 | 750 |
| 0.6650666666666667 | 750 |
| 0.6652 | 750 |
| 0.6653333333333333 | 750 |
| 0.6654666666666667 | 750 |
| 0.6656 | 750 |
| 0.6657333333333333 | 750 |
| 0.6658666666666667 | 750 |
| 0.666 | 750 |
| 0.6661333333333334 | 750 |
| 0.6662666666666667 | 750 |
| 0.6664 | 750 |
| 0.6665333333333333 | 750 |
| 0.6666666666666666 | 750 |
| 0.6668 | 750 |
| 0.6669333333333334 | 750 |
| 0.6670666666666667 | 750 |
| 0.6672 | 750 |
| 0.6673333333333333 | 750 |
| 0.6674666666666667 | 750 |
| 0.6676 | 750 |
| 0.6677333333333333 | 750 |
| 0.6678666666666667 | 750 |
| 0.668 | 750 |
| 0.6681333333333334 | 750 |
| 0.6682666666666667 | 750 |
| 0.6684 | 750 |
| 0.6685333333333333 | 750 |
| 0.6686666666666666 | 750 |
| 0.6688 | 750 |
| 0.6689333333333334 | 750 |
| 0.6690666666666667 | 750 |
| 0.6692 | 750 |
| 0.6693333333333333 | 750 |
| 0.6694666666666667 | 750 |
| 0.6696 | 750 |
| 0.6697333333333333 | 750 |
| 0.6698666666666667 | 750 |
| 0.67 | 750 |
| 0.6701333333333334 | 750 |
| 0.6702666666666667 | 750 |
| 0.6704 | 800 |
| 0.6705333333333333 | 800 |
| 0.6706666666666666 | 800 |
| 0.6708 | 800 |
| 0.6709333333333334 | 800 |
| 0.6710666666666667 | 800 |
| 0.6712 | 800 |
| 0.6713333333333333 | 800 |
| 0.6714666666666667 | 800 |
| 0.6716 | 800 |
| 0.6717333333333333 | 800 |
| 0.6718666666666666 | 800 |
| 0.672 | 800 |
| 0.6721333333333334 | 800 |
| 0.6722666666666667 | 800 |
| 0.6724 | 800 |
| 0.6725333333333333 | 800 |
| 0.6726666666666666 | 800 |
| 0.6728 | 800 |
| 0.6729333333333334 | 800 |
| 0.6730666666666667 | 800 |
| 0.6732 | 800 |
| 0.6733333333333333 | 800 |
| 0.6734666666666667 | 800 |
| 0.6736 | 800 |
| 0.6737333333333333 | 800 |
| 0.6738666666666666 | 800 |
| 0.674 | 800 |
| 0.6741333333333334 | 800 |
| 0.6742666666666667 | 800 |
| 0.6744 | 800 |
| 0.6745333333333333 | 800 |
| 0.6746666666666666 | 800 |
| 0.6748 | 800 |
| 0.6749333333333334 | 800 |
| 0.6750666666666667 | 800 |
| 0.6752 | 800 |
| 0.6753333333333333 | 800 |
| 0.6754666666666667 | 800 |
| 0.6756 | 800 |
| 0.6757333333333333 | 800 |
| 0.6758666666666666 | 800 |
| 0.676 | 800 |
| 0.6761333333333334 | 800 |
| 0.6762666666666667 | 800 |
| 0.6764 | 800 |
| 0.6765333333333333 | 800 |
| 0.6766666666666666 | 800 |
| 0.6768 | 800 |
| 0.6769333333333334 | 800 |
| 0.6770666666666667 | 800 |
| 0.6772 | 800 |
| 0.6773333333333333 | 800 |
| 0.6774666666666667 | 800 |
| 0.6776 | 800 |
| 0.6777333333333333 | 800 |
| 0.6778666666666666 | 800 |
| 0.678 | 800 |
| 0.6781333333333334 | 800 |
| 0.6782666666666667 | 800 |
| 0.6784 | 800 |
| 0.6785333333333333 | 800 |
| 0.6786666666666666 | 800 |
| 0.6788 | 800 |
| 0.6789333333333334 | 800 |
| 0.6790666666666667 | 800 |
| 0.6792 | 800 |
| 0.6793333333333333 | 800 |
| 0.6794666666666667 | 800 |
| 0.6796 | 800 |
| 0.6797333333333333 | 800 |
| 0.6798666666666666 | 800 |
| 0.68 | 800 |
| 0.6801333333333334 | 800 |
| 0.6802666666666667 | 800 |
| 0.6804 | 800 |
| 0.6805333333333333 | 800 |
| 0.6806666666666666 | 800 |
| 0.6808 | 800 |
| 0.6809333333333333 | 800 |
| 0.6810666666666667 | 800 |
| 0.6812 | 800 |
| 0.6813333333333333 | 800 |
| 0.6814666666666667 | 800 |
| 0.6816 | 800 |
| 0.6817333333333333 | 800 |
| 0.6818666666666666 | 800 |
| 0.682 | 800 |
| 0.6821333333333334 | 800 |
| 0.6822666666666667 | 800 |
| 0.6824 | 800 |
| 0.6825333333333333 | 800 |
| 0.6826666666666666 | 800 |
| 0.6828 | 800 |
| 0.6829333333333333 | 800 |
| 0.6830666666666667 | 800 |
| 0.6832 | 800 |
| 0.6833333333333333 | 800 |
| 0.6834666666666667 | 800 |
| 0.6836 | 800 |
| 0.6837333333333333 | 800 |
| 0.6838666666666666 | 800 |
| 0.684 | 800 |
| 0.6841333333333334 | 800 |
| 0.6842666666666667 | 800 |
| 0.6844 | 800 |
| 0.6845333333333333 | 800 |
| 0.6846666666666666 | 800 |
| 0.6848 | 800 |
| 0.6849333333333333 | 800 |
| 0.6850666666666667 | 800 |
| 0.6852 | 800 |
| 0.6853333333333333 | 800 |
| 0.6854666666666667 | 800 |
| 0.6856 | 800 |
| 0.6857333333333333 | 800 |
| 0.6858666666666666 | 800 |
| 0.686 | 800 |
| 0.6861333333333334 | 800 |
| 0.6862666666666667 | 800 |
| 0.6864 | 850 |
| 0.6865333333333333 | 850 |
| 0.6866666666666666 | 850 |
| 0.6868 | 850 |
| 0.6869333333333333 | 850 |
| 0.6870666666666667 | 850 |
| 0.6872 | 850 |
| 0.6873333333333334 | 850 |
| 0.6874666666666667 | 850 |
| 0.6876 | 850 |
| 0.6877333333333333 | 850 |
| 0.6878666666666666 | 850 |
| 0.688 | 850 |
| 0.6881333333333334 | 850 |
| 0.6882666666666667 | 850 |
| 0.6884 | 850 |
| 0.6885333333333333 | 850 |
| 0.6886666666666666 | 850 |
| 0.6888 | 850 |
| 0.6889333333333333 | 850 |
| 0.6890666666666667 | 850 |
| 0.6892 | 850 |
| 0.6893333333333334 | 850 |
| 0.6894666666666667 | 850 |
| 0.6896 | 850 |
| 0.6897333333333333 | 850 |
| 0.6898666666666666 | 850 |
| 0.69 | 850 |
| 0.6901333333333334 | 850 |
| 0.6902666666666667 | 850 |
| 0.6904 | 850 |
| 0.6905333333333333 | 850 |
| 0.6906666666666667 | 850 |
| 0.6908 | 850 |
| 0.6909333333333333 | 850 |
| 0.6910666666666667 | 850 |
| 0.6912 | 850 |
| 0.6913333333333334 | 850 |
| 0.6914666666666667 | 850 |
| 0.6916 | 850 |
| 0.6917333333333333 | 850 |
| 0.6918666666666666 | 850 |
| 0.692 | 850 |
| 0.6921333333333334 | 850 |
| 0.6922666666666667 | 850 |
| 0.6924 | 850 |
| 0.6925333333333333 | 850 |
| 0.6926666666666667 | 850 |
| 0.6928 | 850 |
| 0.6929333333333333 | 850 |
| 0.6930666666666667 | 850 |
| 0.6932 | 850 |
| 0.6933333333333334 | 850 |
| 0.6934666666666667 | 850 |
| 0.6936 | 850 |
| 0.6937333333333333 | 850 |
| 0.6938666666666666 | 850 |
| 0.694 | 850 |
| 0.6941333333333334 | 850 |
| 0.6942666666666667 | 850 |
| 0.6944 | 850 |
| 0.6945333333333333 | 850 |
| 0.6946666666666667 | 850 |
| 0.6948 | 850 |
| 0.6949333333333333 | 850 |
| 0.6950666666666667 | 850 |
| 0.6952 | 850 |
| 0.6953333333333334 | 850 |
| 0.6954666666666667 | 850 |
| 0.6956 | 850 |
| 0.6957333333333333 | 850 |
| 0.6958666666666666 | 850 |
| 0.696 | 850 |
| 0.6961333333333334 | 850 |
| 0.6962666666666667 | 850 |
| 0.6964 | 850 |
| 0.6965333333333333 | 850 |
| 0.6966666666666667 | 850 |
| 0.6968 | 850 |
| 0.6969333333333333 | 850 |
| 0.6970666666666666 | 850 |
| 0.6972 | 850 |
| 0.6973333333333334 | 850 |
| 0.6974666666666667 | 850 |
| 0.6976 | 850 |
| 0.6977333333333333 | 850 |
| 0.6978666666666666 | 850 |
| 0.698 | 850 |
| 0.6981333333333334 | 850 |
| 0.6982666666666667 | 850 |
| 0.6984 | 850 |
| 0.6985333333333333 | 850 |
| 0.6986666666666667 | 850 |
| 0.6988 | 850 |
| 0.6989333333333333 | 850 |
| 0.6990666666666666 | 850 |
| 0.6992 | 850 |
| 0.6993333333333334 | 850 |
| 0.6994666666666667 | 850 |
| 0.6996 | 850 |
| 0.6997333333333333 | 850 |
| 0.6998666666666666 | 850 |
| 0.7 | 850 |
| 0.7001333333333334 | 850 |
| 0.7002666666666667 | 850 |
| 0.7004 | 850 |
| 0.7005333333333333 | 850 |
| 0.7006666666666667 | 850 |
| 0.7008 | 850 |
| 0.7009333333333333 | 850 |
| 0.7010666666666666 | 850 |
| 0.7012 | 850 |
| 0.7013333333333334 | 850 |
| 0.7014666666666667 | 850 |
| 0.7016 | 850 |
| 0.7017333333333333 | 850 |
| 0.7018666666666666 | 850 |
| 0.702 | 850 |
| 0.7021333333333334 | 850 |
| 0.7022666666666667 | 850 |
| 0.7024 | 850 |
| 0.7025333333333333 | 850 |
| 0.7026666666666667 | 900 |
| 0.7028 | 900 |
| 0.7029333333333333 | 900 |
| 0.7030666666666666 | 900 |
| 0.7032 | 900 |
| 0.7033333333333334 | 900 |
| 0.7034666666666667 | 900 |
| 0.7036 | 900 |
| 0.7037333333333333 | 900 |
| 0.7038666666666666 | 900 |
| 0.704 | 900 |
| 0.7041333333333334 | 900 |
| 0.7042666666666667 | 900 |
| 0.7044 | 900 |
| 0.7045333333333333 | 900 |
| 0.7046666666666667 | 900 |
| 0.7048 | 900 |
| 0.7049333333333333 | 900 |
| 0.7050666666666666 | 900 |
| 0.7052 | 900 |
| 0.7053333333333334 | 900 |
| 0.7054666666666667 | 900 |
| 0.7056 | 900 |
| 0.7057333333333333 | 900 |
| 0.7058666666666666 | 900 |
| 0.706 | 900 |
| 0.7061333333333333 | 900 |
| 0.7062666666666667 | 900 |
| 0.7064 | 900 |
| 0.7065333333333333 | 900 |
| 0.7066666666666667 | 900 |
| 0.7068 | 900 |
| 0.7069333333333333 | 900 |
| 0.7070666666666666 | 900 |
| 0.7072 | 900 |
| 0.7073333333333334 | 900 |
| 0.7074666666666667 | 900 |
| 0.7076 | 900 |
| 0.7077333333333333 | 900 |
| 0.7078666666666666 | 900 |
| 0.708 | 900 |
| 0.7081333333333333 | 900 |
| 0.7082666666666667 | 900 |
| 0.7084 | 900 |
| 0.7085333333333333 | 900 |
| 0.7086666666666667 | 900 |
| 0.7088 | 900 |
| 0.7089333333333333 | 900 |
| 0.7090666666666666 | 900 |
| 0.7092 | 900 |
| 0.7093333333333334 | 900 |
| 0.7094666666666667 | 900 |
| 0.7096 | 900 |
| 0.7097333333333333 | 900 |
| 0.7098666666666666 | 900 |
| 0.71 | 900 |
| 0.7101333333333333 | 900 |
| 0.7102666666666667 | 900 |
| 0.7104 | 900 |
| 0.7105333333333334 | 900 |
| 0.7106666666666667 | 900 |
| 0.7108 | 900 |
| 0.7109333333333333 | 900 |
| 0.7110666666666666 | 900 |
| 0.7112 | 900 |
| 0.7113333333333334 | 900 |
| 0.7114666666666667 | 900 |
| 0.7116 | 900 |
| 0.7117333333333333 | 900 |
| 0.7118666666666666 | 900 |
| 0.712 | 900 |
| 0.7121333333333333 | 900 |
| 0.7122666666666667 | 900 |
| 0.7124 | 900 |
| 0.7125333333333334 | 900 |
| 0.7126666666666667 | 900 |
| 0.7128 | 900 |
| 0.7129333333333333 | 900 |
| 0.7130666666666666 | 900 |
| 0.7132 | 900 |
| 0.7133333333333334 | 900 |
| 0.7134666666666667 | 900 |
| 0.7136 | 900 |
| 0.7137333333333333 | 900 |
| 0.7138666666666666 | 900 |
| 0.714 | 900 |
| 0.7141333333333333 | 900 |
| 0.7142666666666667 | 900 |
| 0.7144 | 900 |
| 0.7145333333333334 | 900 |
| 0.7146666666666667 | 900 |
| 0.7148 | 900 |
| 0.7149333333333333 | 900 |
| 0.7150666666666666 | 900 |
| 0.7152 | 900 |
| 0.7153333333333334 | 900 |
| 0.7154666666666667 | 950 |
| 0.7156 | 950 |
| 0.7157333333333333 | 950 |
| 0.7158666666666667 | 950 |
| 0.716 | 950 |
| 0.7161333333333333 | 950 |
| 0.7162666666666667 | 950 |
| 0.7164 | 950 |
| 0.7165333333333334 | 950 |
| 0.7166666666666667 | 950 |
| 0.7168 | 950 |
| 0.7169333333333333 | 950 |
| 0.7170666666666666 | 950 |
| 0.7172 | 950 |
| 0.7173333333333334 | 950 |
| 0.7174666666666667 | 950 |
| 0.7176 | 950 |
| 0.7177333333333333 | 950 |
| 0.7178666666666667 | 950 |
| 0.718 | 950 |
| 0.7181333333333333 | 950 |
| 0.7182666666666667 | 950 |
| 0.7184 | 950 |
| 0.7185333333333334 | 950 |
| 0.7186666666666667 | 950 |
| 0.7188 | 950 |
| 0.7189333333333333 | 950 |
| 0.7190666666666666 | 950 |
| 0.7192 | 950 |
| 0.7193333333333334 | 950 |
| 0.7194666666666667 | 950 |
| 0.7196 | 950 |
| 0.7197333333333333 | 950 |
| 0.7198666666666667 | 950 |
| 0.72 | 950 |
| 0.7201333333333333 | 950 |
| 0.7202666666666667 | 950 |
| 0.7204 | 950 |
| 0.7205333333333334 | 950 |
| 0.7206666666666667 | 950 |
| 0.7208 | 950 |
| 0.7209333333333333 | 950 |
| 0.7210666666666666 | 950 |
| 0.7212 | 950 |
| 0.7213333333333334 | 950 |
| 0.7214666666666667 | 950 |
| 0.7216 | 950 |
| 0.7217333333333333 | 950 |
| 0.7218666666666667 | 950 |
| 0.722 | 950 |
| 0.7221333333333333 | 950 |
| 0.7222666666666666 | 950 |
| 0.7224 | 950 |
| 0.7225333333333334 | 950 |
| 0.7226666666666667 | 950 |
| 0.7228 | 950 |
| 0.7229333333333333 | 950 |
| 0.7230666666666666 | 950 |
| 0.7232 | 950 |
| 0.7233333333333334 | 950 |
| 0.7234666666666667 | 950 |
| 0.7236 | 950 |
| 0.7237333333333333 | 950 |
| 0.7238666666666667 | 950 |
| 0.724 | 950 |
| 0.7241333333333333 | 950 |
| 0.7242666666666666 | 950 |
| 0.7244 | 950 |
| 0.7245333333333334 | 950 |
| 0.7246666666666667 | 950 |
| 0.7248 | 950 |
| 0.7249333333333333 | 950 |
| 0.7250666666666666 | 950 |
| 0.7252 | 950 |
| 0.7253333333333334 | 950 |
| 0.7254666666666667 | 950 |
| 0.7256 | 950 |
| 0.7257333333333333 | 950 |
| 0.7258666666666667 | 950 |
| 0.726 | 950 |
| 0.7261333333333333 | 950 |
| 0.7262666666666666 | 950 |
| 0.7264 | 950 |
| 0.7265333333333334 | 950 |
| 0.7266666666666667 | 950 |
| 0.7268 | 950 |
| 0.7269333333333333 | 950 |
| 0.7270666666666666 | 950 |
| 0.7272 | 950 |
| 0.7273333333333334 | 950 |
| 0.7274666666666667 | 950 |
| 0.7276 | 950 |
| 0.7277333333333333 | 950 |
| 0.7278666666666667 | 950 |
| 0.728 | 950 |
| 0.7281333333333333 | 950 |
| 0.7282666666666666 | 950 |
| 0.7284 | 950 |
| 0.7285333333333334 | 950 |
| 0.7286666666666667 | 950 |
| 0.7288 | 950 |
| 0.7289333333333333 | 950 |
| 0.7290666666666666 | 950 |
| 0.7292 | 950 |
| 0.7293333333333333 | 950 |
| 0.7294666666666667 | 950 |
| 0.7296 | 950 |
| 0.7297333333333333 | 950 |
| 0.7298666666666667 | 1000 |
| 0.73 | 1000 |
| 0.7301333333333333 | 1000 |
| 0.7302666666666666 | 1000 |
| 0.7304 | 1000 |
| 0.7305333333333334 | 1000 |
| 0.7306666666666667 | 1000 |
| 0.7308 | 1000 |
| 0.7309333333333333 | 1000 |
| 0.7310666666666666 | 1000 |
| 0.7312 | 1000 |
| 0.7313333333333333 | 1000 |
| 0.7314666666666667 | 1000 |
| 0.7316 | 1000 |
| 0.7317333333333333 | 1000 |
| 0.7318666666666667 | 1000 |
| 0.732 | 1000 |
| 0.7321333333333333 | 1000 |
| 0.7322666666666666 | 1000 |
| 0.7324 | 1000 |
| 0.7325333333333334 | 1000 |
| 0.7326666666666667 | 1000 |
| 0.7328 | 1000 |
| 0.7329333333333333 | 1000 |
| 0.7330666666666666 | 1000 |
| 0.7332 | 1000 |
| 0.7333333333333333 | 1000 |
| 0.7334666666666667 | 1000 |
| 0.7336 | 1000 |
| 0.7337333333333333 | 1000 |
| 0.7338666666666667 | 1000 |
| 0.734 | 1000 |
| 0.7341333333333333 | 1000 |
| 0.7342666666666666 | 1000 |
| 0.7344 | 1000 |
| 0.7345333333333334 | 1000 |
| 0.7346666666666667 | 1000 |
| 0.7348 | 1000 |
| 0.7349333333333333 | 1000 |
| 0.7350666666666666 | 1000 |
| 0.7352 | 1000 |
| 0.7353333333333333 | 1000 |
| 0.7354666666666667 | 1000 |
| 0.7356 | 1000 |
| 0.7357333333333334 | 1000 |
| 0.7358666666666667 | 1000 |
| 0.736 | 1000 |
| 0.7361333333333333 | 1000 |
| 0.7362666666666666 | 1000 |
| 0.7364 | 1000 |
| 0.7365333333333334 | 1000 |
| 0.7366666666666667 | 1000 |
| 0.7368 | 1000 |
| 0.7369333333333333 | 1000 |
| 0.7370666666666666 | 1000 |
| 0.7372 | 1000 |
| 0.7373333333333333 | 1000 |
| 0.7374666666666667 | 1000 |
| 0.7376 | 1000 |
| 0.7377333333333334 | 1000 |
| 0.7378666666666667 | 1000 |
| 0.738 | 1000 |
| 0.7381333333333333 | 1000 |
| 0.7382666666666666 | 1000 |
| 0.7384 | 1000 |
| 0.7385333333333334 | 1000 |
| 0.7386666666666667 | 1000 |
| 0.7388 | 1000 |
| 0.7389333333333333 | 1000 |
| 0.7390666666666666 | 1000 |
| 0.7392 | 1000 |
| 0.7393333333333333 | 1000 |
| 0.7394666666666667 | 1000 |
| 0.7396 | 1000 |
| 0.7397333333333334 | 1000 |
| 0.7398666666666667 | 1000 |
| 0.74 | 1000 |
| 0.7401333333333333 | 1000 |
| 0.7402666666666666 | 1000 |
| 0.7404 | 1000 |
| 0.7405333333333334 | 1050 |
| 0.7406666666666667 | 1050 |
| 0.7408 | 1050 |
| 0.7409333333333333 | 1050 |
| 0.7410666666666667 | 1050 |
| 0.7412 | 1050 |
| 0.7413333333333333 | 1050 |
| 0.7414666666666667 | 1050 |
| 0.7416 | 1050 |
| 0.7417333333333334 | 1050 |
| 0.7418666666666667 | 1050 |
| 0.742 | 1050 |
| 0.7421333333333333 | 1050 |
| 0.7422666666666666 | 1050 |
| 0.7424 | 1050 |
| 0.7425333333333334 | 1050 |
| 0.7426666666666667 | 1050 |
| 0.7428 | 1050 |
| 0.7429333333333333 | 1050 |
| 0.7430666666666667 | 1050 |
| 0.7432 | 1050 |
| 0.7433333333333333 | 1050 |
| 0.7434666666666667 | 1050 |
| 0.7436 | 1050 |
| 0.7437333333333334 | 1050 |
| 0.7438666666666667 | 1050 |
| 0.744 | 1050 |
| 0.7441333333333333 | 1050 |
| 0.7442666666666666 | 1050 |
| 0.7444 | 1050 |
| 0.7445333333333334 | 1050 |
| 0.7446666666666667 | 1050 |
| 0.7448 | 1050 |
| 0.7449333333333333 | 1050 |
| 0.7450666666666667 | 1050 |
| 0.7452 | 1050 |
| 0.7453333333333333 | 1050 |
| 0.7454666666666667 | 1050 |
| 0.7456 | 1050 |
| 0.7457333333333334 | 1050 |
| 0.7458666666666667 | 1050 |
| 0.746 | 1050 |
| 0.7461333333333333 | 1050 |
| 0.7462666666666666 | 1050 |
| 0.7464 | 1050 |
| 0.7465333333333334 | 1050 |
| 0.7466666666666667 | 1050 |
| 0.7468 | 1050 |
| 0.7469333333333333 | 1050 |
| 0.7470666666666667 | 1050 |
| 0.7472 | 1050 |
| 0.7473333333333333 | 1050 |
| 0.7474666666666666 | 1050 |
| 0.7476 | 1050 |
| 0.7477333333333334 | 1050 |
| 0.7478666666666667 | 1050 |
| 0.748 | 1050 |
| 0.7481333333333333 | 1050 |
| 0.7482666666666666 | 1050 |
| 0.7484 | 1050 |
| 0.7485333333333334 | 1050 |
| 0.7486666666666667 | 1050 |
| 0.7488 | 1050 |
| 0.7489333333333333 | 1050 |
| 0.7490666666666667 | 1100 |
| 0.7492 | 1100 |
| 0.7493333333333333 | 1100 |
| 0.7494666666666666 | 1100 |
| 0.7496 | 1100 |
| 0.7497333333333334 | 1100 |
| 0.7498666666666667 | 1100 |
| 0.75 | 1100 |
| 0.7501333333333333 | 1100 |
| 0.7502666666666666 | 1100 |
| 0.7504 | 1100 |
| 0.7505333333333334 | 1100 |
| 0.7506666666666667 | 1100 |
| 0.7508 | 1100 |
| 0.7509333333333333 | 1100 |
| 0.7510666666666667 | 1100 |
| 0.7512 | 1100 |
| 0.7513333333333333 | 1100 |
| 0.7514666666666666 | 1100 |
| 0.7516 | 1100 |
| 0.7517333333333334 | 1100 |
| 0.7518666666666667 | 1100 |
| 0.752 | 1100 |
| 0.7521333333333333 | 1100 |
| 0.7522666666666666 | 1100 |
| 0.7524 | 1100 |
| 0.7525333333333334 | 1100 |
| 0.7526666666666667 | 1100 |
| 0.7528 | 1100 |
| 0.7529333333333333 | 1100 |
| 0.7530666666666667 | 1100 |
| 0.7532 | 1100 |
| 0.7533333333333333 | 1100 |
| 0.7534666666666666 | 1100 |
| 0.7536 | 1100 |
| 0.7537333333333334 | 1100 |
| 0.7538666666666667 | 1100 |
| 0.754 | 1100 |
| 0.7541333333333333 | 1100 |
| 0.7542666666666666 | 1100 |
| 0.7544 | 1100 |
| 0.7545333333333333 | 1100 |
| 0.7546666666666667 | 1100 |
| 0.7548 | 1100 |
| 0.7549333333333333 | 1100 |
| 0.7550666666666667 | 1100 |
| 0.7552 | 1100 |
| 0.7553333333333333 | 1100 |
| 0.7554666666666666 | 1100 |
| 0.7556 | 1100 |
| 0.7557333333333334 | 1100 |
| 0.7558666666666667 | 1100 |
| 0.756 | 1100 |
| 0.7561333333333333 | 1100 |
| 0.7562666666666666 | 1100 |
| 0.7564 | 1100 |
| 0.7565333333333333 | 1100 |
| 0.7566666666666667 | 1100 |
| 0.7568 | 1100 |
| 0.7569333333333333 | 1100 |
| 0.7570666666666667 | 1100 |
| 0.7572 | 1100 |
| 0.7573333333333333 | 1100 |
| 0.7574666666666666 | 1100 |
| 0.7576 | 1100 |
| 0.7577333333333334 | 1100 |
| 0.7578666666666667 | 1100 |
| 0.758 | 1100 |
| 0.7581333333333333 | 1100 |
| 0.7582666666666666 | 1100 |
| 0.7584 | 1100 |
| 0.7585333333333333 | 1100 |
| 0.7586666666666667 | 1100 |
| 0.7588 | 1100 |
| 0.7589333333333333 | 1100 |
| 0.7590666666666667 | 1100 |
| 0.7592 | 1150 |
| 0.7593333333333333 | 1150 |
| 0.7594666666666666 | 1150 |
| 0.7596 | 1150 |
| 0.7597333333333334 | 1150 |
| 0.7598666666666667 | 1150 |
| 0.76 | 1150 |
| 0.7601333333333333 | 1150 |
| 0.7602666666666666 | 1150 |
| 0.7604 | 1150 |
| 0.7605333333333333 | 1150 |
| 0.7606666666666667 | 1150 |
| 0.7608 | 1150 |
| 0.7609333333333334 | 1150 |
| 0.7610666666666667 | 1150 |
| 0.7612 | 1150 |
| 0.7613333333333333 | 1150 |
| 0.7614666666666666 | 1150 |
| 0.7616 | 1150 |
| 0.7617333333333334 | 1150 |
| 0.7618666666666667 | 1150 |
| 0.762 | 1150 |
| 0.7621333333333333 | 1150 |
| 0.7622666666666666 | 1150 |
| 0.7624 | 1150 |
| 0.7625333333333333 | 1150 |
| 0.7626666666666667 | 1150 |
| 0.7628 | 1150 |
| 0.7629333333333334 | 1150 |
| 0.7630666666666667 | 1150 |
| 0.7632 | 1150 |
| 0.7633333333333333 | 1150 |
| 0.7634666666666666 | 1150 |
| 0.7636 | 1150 |
| 0.7637333333333334 | 1150 |
| 0.7638666666666667 | 1150 |
| 0.764 | 1150 |
| 0.7641333333333333 | 1150 |
| 0.7642666666666666 | 1150 |
| 0.7644 | 1150 |
| 0.7645333333333333 | 1150 |
| 0.7646666666666667 | 1150 |
| 0.7648 | 1150 |
| 0.7649333333333334 | 1150 |
| 0.7650666666666667 | 1150 |
| 0.7652 | 1150 |
| 0.7653333333333333 | 1150 |
| 0.7654666666666666 | 1150 |
| 0.7656 | 1150 |
| 0.7657333333333334 | 1150 |
| 0.7658666666666667 | 1150 |
| 0.766 | 1150 |
| 0.7661333333333333 | 1150 |
| 0.7662666666666667 | 1150 |
| 0.7664 | 1150 |
| 0.7665333333333333 | 1150 |
| 0.7666666666666667 | 1150 |
| 0.7668 | 1150 |
| 0.7669333333333334 | 1150 |
| 0.7670666666666667 | 1150 |
| 0.7672 | 1150 |
| 0.7673333333333333 | 1150 |
| 0.7674666666666666 | 1150 |
| 0.7676 | 1150 |
| 0.7677333333333334 | 1150 |
| 0.7678666666666667 | 1150 |
| 0.768 | 1150 |
| 0.7681333333333333 | 1150 |
| 0.7682666666666667 | 1150 |
| 0.7684 | 1150 |
| 0.7685333333333333 | 1150 |
| 0.7686666666666667 | 1150 |
| 0.7688 | 1150 |
| 0.7689333333333334 | 1150 |
| 0.7690666666666667 | 1150 |
| 0.7692 | 1200 |
| 0.7693333333333333 | 1200 |
| 0.7694666666666666 | 1200 |
| 0.7696 | 1200 |
| 0.7697333333333334 | 1200 |
| 0.7698666666666667 | 1200 |
| 0.77 | 1200 |
| 0.7701333333333333 | 1200 |
| 0.7702666666666667 | 1200 |
| 0.7704 | 1200 |
| 0.7705333333333333 | 1200 |
| 0.7706666666666667 | 1200 |
| 0.7708 | 1200 |
| 0.7709333333333334 | 1200 |
| 0.7710666666666667 | 1200 |
| 0.7712 | 1200 |
| 0.7713333333333333 | 1200 |
| 0.7714666666666666 | 1200 |
| 0.7716 | 1200 |
| 0.7717333333333334 | 1200 |
| 0.7718666666666667 | 1200 |
| 0.772 | 1200 |
| 0.7721333333333333 | 1200 |
| 0.7722666666666667 | 1200 |
| 0.7724 | 1200 |
| 0.7725333333333333 | 1200 |
| 0.7726666666666666 | 1200 |
| 0.7728 | 1200 |
| 0.7729333333333334 | 1200 |
| 0.7730666666666667 | 1200 |
| 0.7732 | 1200 |
| 0.7733333333333333 | 1200 |
| 0.7734666666666666 | 1200 |
| 0.7736 | 1200 |
| 0.7737333333333334 | 1200 |
| 0.7738666666666667 | 1200 |
| 0.774 | 1200 |
| 0.7741333333333333 | 1200 |
| 0.7742666666666667 | 1200 |
| 0.7744 | 1200 |
| 0.7745333333333333 | 1200 |
| 0.7746666666666666 | 1200 |
| 0.7748 | 1200 |
| 0.7749333333333334 | 1200 |
| 0.7750666666666667 | 1200 |
| 0.7752 | 1200 |
| 0.7753333333333333 | 1200 |
| 0.7754666666666666 | 1200 |
| 0.7756 | 1200 |
| 0.7757333333333334 | 1200 |
| 0.7758666666666667 | 1200 |
| 0.776 | 1200 |
| 0.7761333333333333 | 1200 |
| 0.7762666666666667 | 1200 |
| 0.7764 | 1200 |
| 0.7765333333333333 | 1200 |
| 0.7766666666666666 | 1200 |
| 0.7768 | 1200 |
| 0.7769333333333334 | 1200 |
| 0.7770666666666667 | 1200 |
| 0.7772 | 1200 |
| 0.7773333333333333 | 1200 |
| 0.7774666666666666 | 1250 |
| 0.7776 | 1250 |
| 0.7777333333333334 | 1250 |
| 0.7778666666666667 | 1250 |
| 0.778 | 1250 |
| 0.7781333333333333 | 1250 |
| 0.7782666666666667 | 1250 |
| 0.7784 | 1250 |
| 0.7785333333333333 | 1250 |
| 0.7786666666666666 | 1250 |
| 0.7788 | 1250 |
| 0.7789333333333334 | 1250 |
| 0.7790666666666667 | 1250 |
| 0.7792 | 1250 |
| 0.7793333333333333 | 1250 |
| 0.7794666666666666 | 1250 |
| 0.7796 | 1250 |
| 0.7797333333333333 | 1250 |
| 0.7798666666666667 | 1250 |
| 0.78 | 1250 |
| 0.7801333333333333 | 1250 |
| 0.7802666666666667 | 1250 |
| 0.7804 | 1250 |
| 0.7805333333333333 | 1250 |
| 0.7806666666666666 | 1250 |
| 0.7808 | 1250 |
| 0.7809333333333334 | 1250 |
| 0.7810666666666667 | 1250 |
| 0.7812 | 1250 |
| 0.7813333333333333 | 1250 |
| 0.7814666666666666 | 1250 |
| 0.7816 | 1250 |
| 0.7817333333333333 | 1250 |
| 0.7818666666666667 | 1250 |
| 0.782 | 1250 |
| 0.7821333333333333 | 1250 |
| 0.7822666666666667 | 1250 |
| 0.7824 | 1250 |
| 0.7825333333333333 | 1250 |
| 0.7826666666666666 | 1250 |
| 0.7828 | 1250 |
| 0.7829333333333334 | 1250 |
| 0.7830666666666667 | 1250 |
| 0.7832 | 1250 |
| 0.7833333333333333 | 1250 |
| 0.7834666666666666 | 1250 |
| 0.7836 | 1250 |
| 0.7837333333333333 | 1250 |
| 0.7838666666666667 | 1250 |
| 0.784 | 1250 |
| 0.7841333333333333 | 1250 |
| 0.7842666666666667 | 1250 |
| 0.7844 | 1250 |
| 0.7845333333333333 | 1250 |
| 0.7846666666666666 | 1250 |
| 0.7848 | 1250 |
| 0.7849333333333334 | 1250 |
| 0.7850666666666667 | 1300 |
| 0.7852 | 1300 |
| 0.7853333333333333 | 1300 |
| 0.7854666666666666 | 1300 |
| 0.7856 | 1300 |
| 0.7857333333333333 | 1300 |
| 0.7858666666666667 | 1300 |
| 0.786 | 1300 |
| 0.7861333333333334 | 1300 |
| 0.7862666666666667 | 1300 |
| 0.7864 | 1300 |
| 0.7865333333333333 | 1300 |
| 0.7866666666666666 | 1300 |
| 0.7868 | 1300 |
| 0.7869333333333334 | 1300 |
| 0.7870666666666667 | 1300 |
| 0.7872 | 1300 |
| 0.7873333333333333 | 1300 |
| 0.7874666666666666 | 1300 |
| 0.7876 | 1300 |
| 0.7877333333333333 | 1300 |
| 0.7878666666666667 | 1300 |
| 0.788 | 1300 |
| 0.7881333333333334 | 1300 |
| 0.7882666666666667 | 1300 |
| 0.7884 | 1300 |
| 0.7885333333333333 | 1300 |
| 0.7886666666666666 | 1300 |
| 0.7888 | 1300 |
| 0.7889333333333334 | 1300 |
| 0.7890666666666667 | 1300 |
| 0.7892 | 1300 |
| 0.7893333333333333 | 1300 |
| 0.7894666666666666 | 1300 |
| 0.7896 | 1300 |
| 0.7897333333333333 | 1300 |
| 0.7898666666666667 | 1300 |
| 0.79 | 1300 |
| 0.7901333333333334 | 1300 |
| 0.7902666666666667 | 1300 |
| 0.7904 | 1300 |
| 0.7905333333333333 | 1300 |
| 0.7906666666666666 | 1300 |
| 0.7908 | 1300 |
| 0.7909333333333334 | 1300 |
| 0.7910666666666667 | 1300 |
| 0.7912 | 1300 |
| 0.7913333333333333 | 1300 |
| 0.7914666666666667 | 1300 |
| 0.7916 | 1300 |
| 0.7917333333333333 | 1300 |
| 0.7918666666666667 | 1300 |
| 0.792 | 1300 |
| 0.7921333333333334 | 1300 |
| 0.7922666666666667 | 1300 |
| 0.7924 | 1300 |
| 0.7925333333333333 | 1300 |
| 0.7926666666666666 | 1300 |
| 0.7928 | 1300 |
| 0.7929333333333334 | 1300 |
| 0.7930666666666667 | 1300 |
| 0.7932 | 1300 |
| 0.7933333333333333 | 1300 |
| 0.7934666666666667 | 1300 |
| 0.7936 | 1300 |
| 0.7937333333333333 | 1300 |
| 0.7938666666666667 | 1300 |
| 0.794 | 1300 |
| 0.7941333333333334 | 1300 |
| 0.7942666666666667 | 1300 |
| 0.7944 | 1300 |
| 0.7945333333333333 | 1350 |
| 0.7946666666666666 | 1350 |
| 0.7948 | 1350 |
| 0.7949333333333334 | 1350 |
| 0.7950666666666667 | 1350 |
| 0.7952 | 1350 |
| 0.7953333333333333 | 1350 |
| 0.7954666666666667 | 1350 |
| 0.7956 | 1350 |
| 0.7957333333333333 | 1350 |
| 0.7958666666666666 | 1350 |
| 0.796 | 1350 |
| 0.7961333333333334 | 1350 |
| 0.7962666666666667 | 1350 |
| 0.7964 | 1350 |
| 0.7965333333333333 | 1350 |
| 0.7966666666666666 | 1350 |
| 0.7968 | 1350 |
| 0.7969333333333334 | 1350 |
| 0.7970666666666667 | 1350 |
| 0.7972 | 1350 |
| 0.7973333333333333 | 1350 |
| 0.7974666666666667 | 1350 |
| 0.7976 | 1350 |
| 0.7977333333333333 | 1350 |
| 0.7978666666666666 | 1350 |
| 0.798 | 1350 |
| 0.7981333333333334 | 1350 |
| 0.7982666666666667 | 1350 |
| 0.7984 | 1350 |
| 0.7985333333333333 | 1350 |
| 0.7986666666666666 | 1350 |
| 0.7988 | 1350 |
| 0.7989333333333334 | 1350 |
| 0.7990666666666667 | 1350 |
| 0.7992 | 1350 |
| 0.7993333333333333 | 1350 |
| 0.7994666666666667 | 1350 |
| 0.7996 | 1350 |
| 0.7997333333333333 | 1350 |
| 0.7998666666666666 | 1350 |
| 0.8 | 1350 |
| 0.8001333333333334 | 1350 |
| 0.8002666666666667 | 1350 |
| 0.8004 | 1350 |
| 0.8005333333333333 | 1350 |
| 0.8006666666666666 | 1350 |
| 0.8008 | 1350 |
| 0.8009333333333334 | 1350 |
| 0.8010666666666667 | 1350 |
| 0.8012 | 1350 |
| 0.8013333333333333 | 1350 |
| 0.8014666666666667 | 1350 |
| 0.8016 | 1400 |
| 0.8017333333333333 | 1400 |
| 0.8018666666666666 | 1400 |
| 0.802 | 1400 |
| 0.8021333333333334 | 1400 |
| 0.8022666666666667 | 1400 |
| 0.8024 | 1400 |
| 0.8025333333333333 | 1400 |
| 0.8026666666666666 | 1400 |
| 0.8028 | 1400 |
| 0.8029333333333334 | 1400 |
| 0.8030666666666667 | 1400 |
| 0.8032 | 1400 |
| 0.8033333333333333 | 1400 |
| 0.8034666666666667 | 1400 |
| 0.8036 | 1400 |
| 0.8037333333333333 | 1400 |
| 0.8038666666666666 | 1400 |
| 0.804 | 1400 |
| 0.8041333333333334 | 1400 |
| 0.8042666666666667 | 1400 |
| 0.8044 | 1400 |
| 0.8045333333333333 | 1400 |
| 0.8046666666666666 | 1400 |
| 0.8048 | 1400 |
| 0.8049333333333333 | 1400 |
| 0.8050666666666667 | 1400 |
| 0.8052 | 1400 |
| 0.8053333333333333 | 1400 |
| 0.8054666666666667 | 1400 |
| 0.8056 | 1400 |
| 0.8057333333333333 | 1400 |
| 0.8058666666666666 | 1400 |
| 0.806 | 1400 |
| 0.8061333333333334 | 1400 |
| 0.8062666666666667 | 1400 |
| 0.8064 | 1400 |
| 0.8065333333333333 | 1400 |
| 0.8066666666666666 | 1400 |
| 0.8068 | 1400 |
| 0.8069333333333333 | 1400 |
| 0.8070666666666667 | 1400 |
| 0.8072 | 1400 |
| 0.8073333333333333 | 1400 |
| 0.8074666666666667 | 1400 |
| 0.8076 | 1400 |
| 0.8077333333333333 | 1400 |
| 0.8078666666666666 | 1400 |
| 0.808 | 1400 |
| 0.8081333333333334 | 1400 |
| 0.8082666666666667 | 1400 |
| 0.8084 | 1400 |
| 0.8085333333333333 | 1400 |
| 0.8086666666666666 | 1450 |
| 0.8088 | 1450 |
| 0.8089333333333333 | 1450 |
| 0.8090666666666667 | 1450 |
| 0.8092 | 1450 |
| 0.8093333333333333 | 1450 |
| 0.8094666666666667 | 1450 |
| 0.8096 | 1450 |
| 0.8097333333333333 | 1450 |
| 0.8098666666666666 | 1450 |
| 0.81 | 1450 |
| 0.8101333333333334 | 1450 |
| 0.8102666666666667 | 1450 |
| 0.8104 | 1450 |
| 0.8105333333333333 | 1450 |
| 0.8106666666666666 | 1450 |
| 0.8108 | 1450 |
| 0.8109333333333333 | 1450 |
| 0.8110666666666667 | 1450 |
| 0.8112 | 1450 |
| 0.8113333333333334 | 1450 |
| 0.8114666666666667 | 1450 |
| 0.8116 | 1450 |
| 0.8117333333333333 | 1450 |
| 0.8118666666666666 | 1450 |
| 0.812 | 1450 |
| 0.8121333333333334 | 1450 |
| 0.8122666666666667 | 1450 |
| 0.8124 | 1450 |
| 0.8125333333333333 | 1450 |
| 0.8126666666666666 | 1450 |
| 0.8128 | 1450 |
| 0.8129333333333333 | 1450 |
| 0.8130666666666667 | 1450 |
| 0.8132 | 1450 |
| 0.8133333333333334 | 1450 |
| 0.8134666666666667 | 1450 |
| 0.8136 | 1450 |
| 0.8137333333333333 | 1450 |
| 0.8138666666666666 | 1450 |
| 0.814 | 1450 |
| 0.8141333333333334 | 1450 |
| 0.8142666666666667 | 1450 |
| 0.8144 | 1450 |
| 0.8145333333333333 | 1450 |
| 0.8146666666666667 | 1450 |
| 0.8148 | 1450 |
| 0.8149333333333333 | 1450 |
| 0.8150666666666667 | 1450 |
| 0.8152 | 1450 |
| 0.8153333333333334 | 1450 |
| 0.8154666666666667 | 1450 |
| 0.8156 | 1450 |
| 0.8157333333333333 | 1450 |
| 0.8158666666666666 | 1500 |
| 0.816 | 1500 |
| 0.8161333333333334 | 1500 |
| 0.8162666666666667 | 1500 |
| 0.8164 | 1500 |
| 0.8165333333333333 | 1500 |
| 0.8166666666666667 | 1500 |
| 0.8168 | 1500 |
| 0.8169333333333333 | 1500 |
| 0.8170666666666667 | 1500 |
| 0.8172 | 1500 |
| 0.8173333333333334 | 1500 |
| 0.8174666666666667 | 1500 |
| 0.8176 | 1500 |
| 0.8177333333333333 | 1500 |
| 0.8178666666666666 | 1500 |
| 0.818 | 1500 |
| 0.8181333333333334 | 1500 |
| 0.8182666666666667 | 1500 |
| 0.8184 | 1500 |
| 0.8185333333333333 | 1500 |
| 0.8186666666666667 | 1500 |
| 0.8188 | 1500 |
| 0.8189333333333333 | 1500 |
| 0.8190666666666667 | 1500 |
| 0.8192 | 1500 |
| 0.8193333333333334 | 1500 |
| 0.8194666666666667 | 1500 |
| 0.8196 | 1500 |
| 0.8197333333333333 | 1500 |
| 0.8198666666666666 | 1500 |
| 0.82 | 1500 |
| 0.8201333333333334 | 1500 |
| 0.8202666666666667 | 1500 |
| 0.8204 | 1500 |
| 0.8205333333333333 | 1500 |
| 0.8206666666666667 | 1500 |
| 0.8208 | 1500 |
| 0.8209333333333333 | 1500 |
| 0.8210666666666666 | 1500 |
| 0.8212 | 1500 |
| 0.8213333333333334 | 1500 |
| 0.8214666666666667 | 1500 |
| 0.8216 | 1500 |
| 0.8217333333333333 | 1500 |
| 0.8218666666666666 | 1500 |
| 0.822 | 1500 |
| 0.8221333333333334 | 1500 |
| 0.8222666666666667 | 1500 |
| 0.8224 | 1550 |
| 0.8225333333333333 | 1550 |
| 0.8226666666666667 | 1550 |
| 0.8228 | 1550 |
| 0.8229333333333333 | 1550 |
| 0.8230666666666666 | 1550 |
| 0.8232 | 1550 |
| 0.8233333333333334 | 1550 |
| 0.8234666666666667 | 1550 |
| 0.8236 | 1550 |
| 0.8237333333333333 | 1550 |
| 0.8238666666666666 | 1550 |
| 0.824 | 1550 |
| 0.8241333333333334 | 1550 |
| 0.8242666666666667 | 1550 |
| 0.8244 | 1550 |
| 0.8245333333333333 | 1550 |
| 0.8246666666666667 | 1550 |
| 0.8248 | 1550 |
| 0.8249333333333333 | 1550 |
| 0.8250666666666666 | 1550 |
| 0.8252 | 1550 |
| 0.8253333333333334 | 1550 |
| 0.8254666666666667 | 1550 |
| 0.8256 | 1550 |
| 0.8257333333333333 | 1550 |
| 0.8258666666666666 | 1550 |
| 0.826 | 1550 |
| 0.8261333333333334 | 1550 |
| 0.8262666666666667 | 1550 |
| 0.8264 | 1550 |
| 0.8265333333333333 | 1600 |
| 0.8266666666666667 | 1600 |
| 0.8268 | 1600 |
| 0.8269333333333333 | 1600 |
| 0.8270666666666666 | 1600 |
| 0.8272 | 1600 |
| 0.8273333333333334 | 1600 |
| 0.8274666666666667 | 1600 |
| 0.8276 | 1600 |
| 0.8277333333333333 | 1600 |
| 0.8278666666666666 | 1600 |
| 0.828 | 1600 |
| 0.8281333333333334 | 1600 |
| 0.8282666666666667 | 1600 |
| 0.8284 | 1600 |
| 0.8285333333333333 | 1600 |
| 0.8286666666666667 | 1600 |
| 0.8288 | 1600 |
| 0.8289333333333333 | 1600 |
| 0.8290666666666666 | 1600 |
| 0.8292 | 1600 |
| 0.8293333333333334 | 1600 |
| 0.8294666666666667 | 1600 |
| 0.8296 | 1600 |
| 0.8297333333333333 | 1600 |
| 0.8298666666666666 | 1600 |
| 0.83 | 1600 |
| 0.8301333333333333 | 1600 |
| 0.8302666666666667 | 1600 |
| 0.8304 | 1600 |
| 0.8305333333333333 | 1600 |
| 0.8306666666666667 | 1600 |
| 0.8308 | 1600 |
| 0.8309333333333333 | 1600 |
| 0.8310666666666666 | 1600 |
| 0.8312 | 1600 |
| 0.8313333333333334 | 1600 |
| 0.8314666666666667 | 1600 |
| 0.8316 | 1600 |
| 0.8317333333333333 | 1600 |
| 0.8318666666666666 | 1600 |
| 0.832 | 1600 |
| 0.8321333333333333 | 1600 |
| 0.8322666666666667 | 1600 |
| 0.8324 | 1600 |
| 0.8325333333333333 | 1600 |
| 0.8326666666666667 | 1600 |
| 0.8328 | 1600 |
| 0.8329333333333333 | 1600 |
| 0.8330666666666666 | 1650 |
| 0.8332 | 1650 |
| 0.8333333333333334 | 1650 |
| 0.8334666666666667 | 1650 |
| 0.8336 | 1650 |
| 0.8337333333333333 | 1650 |
| 0.8338666666666666 | 1650 |
| 0.834 | 1650 |
| 0.8341333333333333 | 1650 |
| 0.8342666666666667 | 1650 |
| 0.8344 | 1650 |
| 0.8345333333333333 | 1650 |
| 0.8346666666666667 | 1650 |
| 0.8348 | 1650 |
| 0.8349333333333333 | 1650 |
| 0.8350666666666666 | 1650 |
| 0.8352 | 1650 |
| 0.8353333333333334 | 1650 |
| 0.8354666666666667 | 1650 |
| 0.8356 | 1650 |
| 0.8357333333333333 | 1650 |
| 0.8358666666666666 | 1650 |
| 0.836 | 1650 |
| 0.8361333333333333 | 1650 |
| 0.8362666666666667 | 1650 |
| 0.8364 | 1650 |
| 0.8365333333333334 | 1650 |
| 0.8366666666666667 | 1650 |
| 0.8368 | 1700 |
| 0.8369333333333333 | 1700 |
| 0.8370666666666666 | 1700 |
| 0.8372 | 1700 |
| 0.8373333333333334 | 1700 |
| 0.8374666666666667 | 1700 |
| 0.8376 | 1700 |
| 0.8377333333333333 | 1700 |
| 0.8378666666666666 | 1700 |
| 0.838 | 1700 |
| 0.8381333333333333 | 1700 |
| 0.8382666666666667 | 1700 |
| 0.8384 | 1700 |
| 0.8385333333333334 | 1700 |
| 0.8386666666666667 | 1700 |
| 0.8388 | 1700 |
| 0.8389333333333333 | 1700 |
| 0.8390666666666666 | 1700 |
| 0.8392 | 1700 |
| 0.8393333333333334 | 1700 |
| 0.8394666666666667 | 1700 |
| 0.8396 | 1700 |
| 0.8397333333333333 | 1700 |
| 0.8398666666666667 | 1700 |
| 0.84 | 1700 |
| 0.8401333333333333 | 1700 |
| 0.8402666666666667 | 1700 |
| 0.8404 | 1700 |
| 0.8405333333333334 | 1700 |
| 0.8406666666666667 | 1700 |
| 0.8408 | 1700 |
| 0.8409333333333333 | 1700 |
| 0.8410666666666666 | 1700 |
| 0.8412 | 1700 |
| 0.8413333333333334 | 1750 |
| 0.8414666666666667 | 1750 |
| 0.8416 | 1750 |
| 0.8417333333333333 | 1750 |
| 0.8418666666666667 | 1750 |
| 0.842 | 1750 |
| 0.8421333333333333 | 1750 |
| 0.8422666666666667 | 1750 |
| 0.8424 | 1750 |
| 0.8425333333333334 | 1750 |
| 0.8426666666666667 | 1750 |
| 0.8428 | 1750 |
| 0.8429333333333333 | 1750 |
| 0.8430666666666666 | 1750 |
| 0.8432 | 1750 |
| 0.8433333333333334 | 1750 |
| 0.8434666666666667 | 1750 |
| 0.8436 | 1750 |
| 0.8437333333333333 | 1750 |
| 0.8438666666666667 | 1750 |
| 0.844 | 1750 |
| 0.8441333333333333 | 1750 |
| 0.8442666666666667 | 1750 |
| 0.8444 | 1750 |
| 0.8445333333333334 | 1750 |
| 0.8446666666666667 | 1750 |
| 0.8448 | 1750 |
| 0.8449333333333333 | 1750 |
| 0.8450666666666666 | 1750 |
| 0.8452 | 1750 |
| 0.8453333333333334 | 1750 |
| 0.8454666666666667 | 1750 |
| 0.8456 | 1750 |
| 0.8457333333333333 | 1750 |
| 0.8458666666666667 | 1750 |
| 0.846 | 1750 |
| 0.8461333333333333 | 1750 |
| 0.8462666666666666 | 1750 |
| 0.8464 | 1750 |
| 0.8465333333333334 | 1750 |
| 0.8466666666666667 | 1800 |
| 0.8468 | 1800 |
| 0.8469333333333333 | 1800 |
| 0.8470666666666666 | 1800 |
| 0.8472 | 1800 |
| 0.8473333333333334 | 1800 |
| 0.8474666666666667 | 1800 |
| 0.8476 | 1800 |
| 0.8477333333333333 | 1800 |
| 0.8478666666666667 | 1800 |
| 0.848 | 1800 |
| 0.8481333333333333 | 1800 |
| 0.8482666666666666 | 1800 |
| 0.8484 | 1800 |
| 0.8485333333333334 | 1800 |
| 0.8486666666666667 | 1800 |
| 0.8488 | 1800 |
| 0.8489333333333333 | 1800 |
| 0.8490666666666666 | 1800 |
| 0.8492 | 1800 |
| 0.8493333333333334 | 1800 |
| 0.8494666666666667 | 1800 |
| 0.8496 | 1800 |
| 0.8497333333333333 | 1800 |
| 0.8498666666666667 | 1800 |
| 0.85 | 1800 |
| 0.8501333333333333 | 1800 |
| 0.8502666666666666 | 1800 |
| 0.8504 | 1800 |
| 0.8505333333333334 | 1800 |
| 0.8506666666666667 | 1800 |
| 0.8508 | 1800 |
| 0.8509333333333333 | 1800 |
| 0.8510666666666666 | 1800 |
| 0.8512 | 1800 |
| 0.8513333333333334 | 1800 |
| 0.8514666666666667 | 1800 |
| 0.8516 | 1800 |
| 0.8517333333333333 | 1850 |
| 0.8518666666666667 | 1850 |
| 0.852 | 1850 |
| 0.8521333333333333 | 1850 |
| 0.8522666666666666 | 1850 |
| 0.8524 | 1850 |
| 0.8525333333333334 | 1850 |
| 0.8526666666666667 | 1850 |
| 0.8528 | 1850 |
| 0.8529333333333333 | 1850 |
| 0.8530666666666666 | 1850 |
| 0.8532 | 1850 |
| 0.8533333333333334 | 1850 |
| 0.8534666666666667 | 1850 |
| 0.8536 | 1850 |
| 0.8537333333333333 | 1850 |
| 0.8538666666666667 | 1850 |
| 0.854 | 1850 |
| 0.8541333333333333 | 1850 |
| 0.8542666666666666 | 1850 |
| 0.8544 | 1850 |
| 0.8545333333333334 | 1850 |
| 0.8546666666666667 | 1850 |
| 0.8548 | 1850 |
| 0.8549333333333333 | 1850 |
| 0.8550666666666666 | 1850 |
| 0.8552 | 1850 |
| 0.8553333333333333 | 1850 |
| 0.8554666666666667 | 1850 |
| 0.8556 | 1850 |
| 0.8557333333333333 | 1850 |
| 0.8558666666666667 | 1850 |
| 0.856 | 1850 |
| 0.8561333333333333 | 1850 |
| 0.8562666666666666 | 1850 |
| 0.8564 | 1850 |
| 0.8565333333333334 | 1850 |
| 0.8566666666666667 | 1900 |
| 0.8568 | 1900 |
| 0.8569333333333333 | 1900 |
| 0.8570666666666666 | 1900 |
| 0.8572 | 1900 |
| 0.8573333333333333 | 1900 |
| 0.8574666666666667 | 1900 |
| 0.8576 | 1900 |
| 0.8577333333333333 | 1900 |
| 0.8578666666666667 | 1900 |
| 0.858 | 1900 |
| 0.8581333333333333 | 1900 |
| 0.8582666666666666 | 1900 |
| 0.8584 | 1900 |
| 0.8585333333333334 | 1900 |
| 0.8586666666666667 | 1900 |
| 0.8588 | 1900 |
| 0.8589333333333333 | 1900 |
| 0.8590666666666666 | 1900 |
| 0.8592 | 1900 |
| 0.8593333333333333 | 1900 |
| 0.8594666666666667 | 1900 |
| 0.8596 | 1900 |
| 0.8597333333333333 | 1900 |
| 0.8598666666666667 | 1900 |
| 0.86 | 1900 |
| 0.8601333333333333 | 1900 |
| 0.8602666666666666 | 1900 |
| 0.8604 | 1900 |
| 0.8605333333333334 | 1900 |
| 0.8606666666666667 | 1900 |
| 0.8608 | 1900 |
| 0.8609333333333333 | 1900 |
| 0.8610666666666666 | 1900 |
| 0.8612 | 1900 |
| 0.8613333333333333 | 1950 |
| 0.8614666666666667 | 1950 |
| 0.8616 | 1950 |
| 0.8617333333333334 | 1950 |
| 0.8618666666666667 | 1950 |
| 0.862 | 1950 |
| 0.8621333333333333 | 1950 |
| 0.8622666666666666 | 1950 |
| 0.8624 | 1950 |
| 0.8625333333333334 | 1950 |
| 0.8626666666666667 | 1950 |
| 0.8628 | 1950 |
| 0.8629333333333333 | 1950 |
| 0.8630666666666666 | 1950 |
| 0.8632 | 1950 |
| 0.8633333333333333 | 1950 |
| 0.8634666666666667 | 1950 |
| 0.8636 | 1950 |
| 0.8637333333333334 | 1950 |
| 0.8638666666666667 | 1950 |
| 0.864 | 1950 |
| 0.8641333333333333 | 1950 |
| 0.8642666666666666 | 1950 |
| 0.8644 | 1950 |
| 0.8645333333333334 | 1950 |
| 0.8646666666666667 | 1950 |
| 0.8648 | 1950 |
| 0.8649333333333333 | 1950 |
| 0.8650666666666667 | 1950 |
| 0.8652 | 1950 |
| 0.8653333333333333 | 1950 |
| 0.8654666666666667 | 1950 |
| 0.8656 | 1950 |
| 0.8657333333333334 | 2000 |
| 0.8658666666666667 | 2000 |
| 0.866 | 2000 |
| 0.8661333333333333 | 2000 |
| 0.8662666666666666 | 2000 |
| 0.8664 | 2000 |
| 0.8665333333333334 | 2000 |
| 0.8666666666666667 | 2000 |
| 0.8668 | 2000 |
| 0.8669333333333333 | 2000 |
| 0.8670666666666667 | 2000 |
| 0.8672 | 2000 |
| 0.8673333333333333 | 2000 |
| 0.8674666666666667 | 2000 |
| 0.8676 | 2000 |
| 0.8677333333333334 | 2000 |
| 0.8678666666666667 | 2000 |
| 0.868 | 2000 |
| 0.8681333333333333 | 2000 |
| 0.8682666666666666 | 2000 |
| 0.8684 | 2050 |
| 0.8685333333333334 | 2050 |
| 0.8686666666666667 | 2050 |
| 0.8688 | 2050 |
| 0.8689333333333333 | 2050 |
| 0.8690666666666667 | 2050 |
| 0.8692 | 2050 |
| 0.8693333333333333 | 2050 |
| 0.8694666666666667 | 2050 |
| 0.8696 | 2050 |
| 0.8697333333333334 | 2050 |
| 0.8698666666666667 | 2050 |
| 0.87 | 2050 |
| 0.8701333333333333 | 2050 |
| 0.8702666666666666 | 2050 |
| 0.8704 | 2050 |
| 0.8705333333333334 | 2050 |
| 0.8706666666666667 | 2050 |
| 0.8708 | 2050 |
| 0.8709333333333333 | 2050 |
| 0.8710666666666667 | 2050 |
| 0.8712 | 2050 |
| 0.8713333333333333 | 2050 |
| 0.8714666666666666 | 2050 |
| 0.8716 | 2050 |
| 0.8717333333333334 | 2050 |
| 0.8718666666666667 | 2050 |
| 0.872 | 2050 |
| 0.8721333333333333 | 2050 |
| 0.8722666666666666 | 2050 |
| 0.8724 | 2050 |
| 0.8725333333333334 | 2050 |
| 0.8726666666666667 | 2050 |
| 0.8728 | 2050 |
| 0.8729333333333333 | 2050 |
| 0.8730666666666667 | 2050 |
| 0.8732 | 2050 |
| 0.8733333333333333 | 2050 |
| 0.8734666666666666 | 2100 |
| 0.8736 | 2100 |
| 0.8737333333333334 | 2100 |
| 0.8738666666666667 | 2100 |
| 0.874 | 2100 |
| 0.8741333333333333 | 2100 |
| 0.8742666666666666 | 2100 |
| 0.8744 | 2100 |
| 0.8745333333333334 | 2100 |
| 0.8746666666666667 | 2100 |
| 0.8748 | 2100 |
| 0.8749333333333333 | 2100 |
| 0.8750666666666667 | 2100 |
| 0.8752 | 2100 |
| 0.8753333333333333 | 2100 |
| 0.8754666666666666 | 2100 |
| 0.8756 | 2100 |
| 0.8757333333333334 | 2100 |
| 0.8758666666666667 | 2100 |
| 0.876 | 2100 |
| 0.8761333333333333 | 2100 |
| 0.8762666666666666 | 2100 |
| 0.8764 | 2100 |
| 0.8765333333333334 | 2100 |
| 0.8766666666666667 | 2100 |
| 0.8768 | 2100 |
| 0.8769333333333333 | 2100 |
| 0.8770666666666667 | 2100 |
| 0.8772 | 2100 |
| 0.8773333333333333 | 2100 |
| 0.8774666666666666 | 2150 |
| 0.8776 | 2150 |
| 0.8777333333333334 | 2150 |
| 0.8778666666666667 | 2150 |
| 0.878 | 2150 |
| 0.8781333333333333 | 2150 |
| 0.8782666666666666 | 2150 |
| 0.8784 | 2150 |
| 0.8785333333333334 | 2150 |
| 0.8786666666666667 | 2150 |
| 0.8788 | 2150 |
| 0.8789333333333333 | 2150 |
| 0.8790666666666667 | 2150 |
| 0.8792 | 2150 |
| 0.8793333333333333 | 2150 |
| 0.8794666666666666 | 2150 |
| 0.8796 | 2150 |
| 0.8797333333333334 | 2150 |
| 0.8798666666666667 | 2150 |
| 0.88 | 2150 |
| 0.8801333333333333 | 2150 |
| 0.8802666666666666 | 2150 |
| 0.8804 | 2150 |
| 0.8805333333333333 | 2150 |
| 0.8806666666666667 | 2150 |
| 0.8808 | 2150 |
| 0.8809333333333333 | 2150 |
| 0.8810666666666667 | 2150 |
| 0.8812 | 2200 |
| 0.8813333333333333 | 2200 |
| 0.8814666666666666 | 2200 |
| 0.8816 | 2200 |
| 0.8817333333333334 | 2200 |
| 0.8818666666666667 | 2200 |
| 0.882 | 2200 |
| 0.8821333333333333 | 2200 |
| 0.8822666666666666 | 2200 |
| 0.8824 | 2200 |
| 0.8825333333333333 | 2200 |
| 0.8826666666666667 | 2200 |
| 0.8828 | 2200 |
| 0.8829333333333333 | 2200 |
| 0.8830666666666667 | 2200 |
| 0.8832 | 2200 |
| 0.8833333333333333 | 2200 |
| 0.8834666666666666 | 2200 |
| 0.8836 | 2200 |
| 0.8837333333333334 | 2200 |
| 0.8838666666666667 | 2200 |
| 0.884 | 2200 |
| 0.8841333333333333 | 2200 |
| 0.8842666666666666 | 2200 |
| 0.8844 | 2200 |
| 0.8845333333333333 | 2200 |
| 0.8846666666666667 | 2200 |
| 0.8848 | 2200 |
| 0.8849333333333333 | 2250 |
| 0.8850666666666667 | 2250 |
| 0.8852 | 2250 |
| 0.8853333333333333 | 2250 |
| 0.8854666666666666 | 2250 |
| 0.8856 | 2250 |
| 0.8857333333333334 | 2250 |
| 0.8858666666666667 | 2250 |
| 0.886 | 2250 |
| 0.8861333333333333 | 2250 |
| 0.8862666666666666 | 2250 |
| 0.8864 | 2250 |
| 0.8865333333333333 | 2250 |
| 0.8866666666666667 | 2250 |
| 0.8868 | 2250 |
| 0.8869333333333334 | 2250 |
| 0.8870666666666667 | 2250 |
| 0.8872 | 2250 |
| 0.8873333333333333 | 2250 |
| 0.8874666666666666 | 2250 |
| 0.8876 | 2250 |
| 0.8877333333333334 | 2250 |
| 0.8878666666666667 | 2250 |
| 0.888 | 2250 |
| 0.8881333333333333 | 2250 |
| 0.8882666666666666 | 2250 |
| 0.8884 | 2250 |
| 0.8885333333333333 | 2300 |
| 0.8886666666666667 | 2300 |
| 0.8888 | 2300 |
| 0.8889333333333334 | 2300 |
| 0.8890666666666667 | 2300 |
| 0.8892 | 2300 |
| 0.8893333333333333 | 2300 |
| 0.8894666666666666 | 2300 |
| 0.8896 | 2300 |
| 0.8897333333333334 | 2300 |
| 0.8898666666666667 | 2300 |
| 0.89 | 2300 |
| 0.8901333333333333 | 2300 |
| 0.8902666666666667 | 2350 |
| 0.8904 | 2350 |
| 0.8905333333333333 | 2350 |
| 0.8906666666666667 | 2350 |
| 0.8908 | 2350 |
| 0.8909333333333334 | 2350 |
| 0.8910666666666667 | 2350 |
| 0.8912 | 2350 |
| 0.8913333333333333 | 2350 |
| 0.8914666666666666 | 2350 |
| 0.8916 | 2350 |
| 0.8917333333333334 | 2350 |
| 0.8918666666666667 | 2350 |
| 0.892 | 2350 |
| 0.8921333333333333 | 2350 |
| 0.8922666666666667 | 2350 |
| 0.8924 | 2350 |
| 0.8925333333333333 | 2350 |
| 0.8926666666666667 | 2350 |
| 0.8928 | 2350 |
| 0.8929333333333334 | 2350 |
| 0.8930666666666667 | 2350 |
| 0.8932 | 2350 |
| 0.8933333333333333 | 2350 |
| 0.8934666666666666 | 2400 |
| 0.8936 | 2400 |
| 0.8937333333333334 | 2400 |
| 0.8938666666666667 | 2400 |
| 0.894 | 2400 |
| 0.8941333333333333 | 2400 |
| 0.8942666666666667 | 2400 |
| 0.8944 | 2400 |
| 0.8945333333333333 | 2400 |
| 0.8946666666666667 | 2400 |
| 0.8948 | 2400 |
| 0.8949333333333334 | 2400 |
| 0.8950666666666667 | 2400 |
| 0.8952 | 2400 |
| 0.8953333333333333 | 2400 |
| 0.8954666666666666 | 2400 |
| 0.8956 | 2450 |
| 0.8957333333333334 | 2450 |
| 0.8958666666666667 | 2450 |
| 0.896 | 2450 |
| 0.8961333333333333 | 2450 |
| 0.8962666666666667 | 2450 |
| 0.8964 | 2450 |
| 0.8965333333333333 | 2450 |
| 0.8966666666666666 | 2450 |
| 0.8968 | 2450 |
| 0.8969333333333334 | 2450 |
| 0.8970666666666667 | 2450 |
| 0.8972 | 2450 |
| 0.8973333333333333 | 2450 |
| 0.8974666666666666 | 2450 |
| 0.8976 | 2450 |
| 0.8977333333333334 | 2450 |
| 0.8978666666666667 | 2450 |
| 0.898 | 2450 |
| 0.8981333333333333 | 2450 |
| 0.8982666666666667 | 2500 |
| 0.8984 | 2500 |
| 0.8985333333333333 | 2500 |
| 0.8986666666666666 | 2500 |
| 0.8988 | 2500 |
| 0.8989333333333334 | 2500 |
| 0.8990666666666667 | 2500 |
| 0.8992 | 2500 |
| 0.8993333333333333 | 2500 |
| 0.8994666666666666 | 2500 |
| 0.8996 | 2500 |
| 0.8997333333333334 | 2500 |
| 0.8998666666666667 | 2500 |
| 0.9 | 2500 |
| 0.9001333333333333 | 2500 |
| 0.9002666666666667 | 2500 |
| 0.9004 | 2500 |
| 0.9005333333333333 | 2500 |
| 0.9006666666666666 | 2500 |
| 0.9008 | 2500 |
| 0.9009333333333334 | 2500 |
| 0.9010666666666667 | 2500 |
| 0.9012 | 2500 |
| 0.9013333333333333 | 2500 |
| 0.9014666666666666 | 2550 |
| 0.9016 | 2550 |
| 0.9017333333333334 | 2550 |
| 0.9018666666666667 | 2550 |
| 0.902 | 2550 |
| 0.9021333333333333 | 2550 |
| 0.9022666666666667 | 2550 |
| 0.9024 | 2550 |
| 0.9025333333333333 | 2550 |
| 0.9026666666666666 | 2550 |
| 0.9028 | 2550 |
| 0.9029333333333334 | 2550 |
| 0.9030666666666667 | 2550 |
| 0.9032 | 2550 |
| 0.9033333333333333 | 2550 |
| 0.9034666666666666 | 2550 |
| 0.9036 | 2550 |
| 0.9037333333333334 | 2600 |
| 0.9038666666666667 | 2600 |
| 0.904 | 2600 |
| 0.9041333333333333 | 2600 |
| 0.9042666666666667 | 2600 |
| 0.9044 | 2600 |
| 0.9045333333333333 | 2600 |
| 0.9046666666666666 | 2600 |
| 0.9048 | 2600 |
| 0.9049333333333334 | 2600 |
| 0.9050666666666667 | 2600 |
| 0.9052 | 2600 |
| 0.9053333333333333 | 2600 |
| 0.9054666666666666 | 2600 |
| 0.9056 | 2600 |
| 0.9057333333333333 | 2600 |
| 0.9058666666666667 | 2600 |
| 0.906 | 2600 |
| 0.9061333333333333 | 2600 |
| 0.9062666666666667 | 2600 |
| 0.9064 | 2650 |
| 0.9065333333333333 | 2650 |
| 0.9066666666666666 | 2650 |
| 0.9068 | 2650 |
| 0.9069333333333334 | 2650 |
| 0.9070666666666667 | 2650 |
| 0.9072 | 2650 |
| 0.9073333333333333 | 2650 |
| 0.9074666666666666 | 2650 |
| 0.9076 | 2650 |
| 0.9077333333333333 | 2650 |
| 0.9078666666666667 | 2650 |
| 0.908 | 2650 |
| 0.9081333333333333 | 2700 |
| 0.9082666666666667 | 2700 |
| 0.9084 | 2700 |
| 0.9085333333333333 | 2700 |
| 0.9086666666666666 | 2700 |
| 0.9088 | 2700 |
| 0.9089333333333334 | 2700 |
| 0.9090666666666667 | 2700 |
| 0.9092 | 2700 |
| 0.9093333333333333 | 2700 |
| 0.9094666666666666 | 2700 |
| 0.9096 | 2700 |
| 0.9097333333333333 | 2700 |
| 0.9098666666666667 | 2750 |
| 0.91 | 2750 |
| 0.9101333333333333 | 2750 |
| 0.9102666666666667 | 2750 |
| 0.9104 | 2750 |
| 0.9105333333333333 | 2750 |
| 0.9106666666666666 | 2750 |
| 0.9108 | 2750 |
| 0.9109333333333334 | 2750 |
| 0.9110666666666667 | 2750 |
| 0.9112 | 2750 |
| 0.9113333333333333 | 2750 |
| 0.9114666666666666 | 2750 |
| 0.9116 | 2750 |
| 0.9117333333333333 | 2750 |
| 0.9118666666666667 | 2750 |
| 0.912 | 2750 |
| 0.9121333333333334 | 2750 |
| 0.9122666666666667 | 2750 |
| 0.9124 | 2800 |
| 0.9125333333333333 | 2800 |
| 0.9126666666666666 | 2800 |
| 0.9128 | 2800 |
| 0.9129333333333334 | 2800 |
| 0.9130666666666667 | 2800 |
| 0.9132 | 2800 |
| 0.9133333333333333 | 2800 |
| 0.9134666666666666 | 2800 |
| 0.9136 | 2800 |
| 0.9137333333333333 | 2800 |
| 0.9138666666666667 | 2800 |
| 0.914 | 2800 |
| 0.9141333333333334 | 2800 |
| 0.9142666666666667 | 2800 |
| 0.9144 | 2800 |
| 0.9145333333333333 | 2800 |
| 0.9146666666666666 | 2800 |
| 0.9148 | 2800 |
| 0.9149333333333334 | 2850 |
| 0.9150666666666667 | 2850 |
| 0.9152 | 2850 |
| 0.9153333333333333 | 2850 |
| 0.9154666666666667 | 2850 |
| 0.9156 | 2850 |
| 0.9157333333333333 | 2850 |
| 0.9158666666666667 | 2850 |
| 0.916 | 2850 |
| 0.9161333333333334 | 2850 |
| 0.9162666666666667 | 2850 |
| 0.9164 | 2850 |
| 0.9165333333333333 | 2850 |
| 0.9166666666666666 | 2850 |
| 0.9168 | 2850 |
| 0.9169333333333334 | 2850 |
| 0.9170666666666667 | 2850 |
| 0.9172 | 2850 |
| 0.9173333333333333 | 2850 |
| 0.9174666666666667 | 2850 |
| 0.9176 | 2850 |
| 0.9177333333333333 | 2900 |
| 0.9178666666666667 | 2900 |
| 0.918 | 2900 |
| 0.9181333333333334 | 2900 |
| 0.9182666666666667 | 2900 |
| 0.9184 | 2900 |
| 0.9185333333333333 | 2900 |
| 0.9186666666666666 | 2900 |
| 0.9188 | 2900 |
| 0.9189333333333334 | 2900 |
| 0.9190666666666667 | 2900 |
| 0.9192 | 2900 |
| 0.9193333333333333 | 2900 |
| 0.9194666666666667 | 2900 |
| 0.9196 | 2900 |
| 0.9197333333333333 | 2900 |
| 0.9198666666666667 | 2900 |
| 0.92 | 2900 |
| 0.9201333333333334 | 2900 |
| 0.9202666666666667 | 2900 |
| 0.9204 | 2900 |
| 0.9205333333333333 | 2950 |
| 0.9206666666666666 | 2950 |
| 0.9208 | 2950 |
| 0.9209333333333334 | 2950 |
| 0.9210666666666667 | 2950 |
| 0.9212 | 2950 |
| 0.9213333333333333 | 2950 |
| 0.9214666666666667 | 2950 |
| 0.9216 | 2950 |
| 0.9217333333333333 | 2950 |
| 0.9218666666666666 | 2950 |
| 0.922 | 3000 |
| 0.9221333333333334 | 3000 |
| 0.9222666666666667 | 3000 |
| 0.9224 | 3000 |
| 0.9225333333333333 | 3000 |
| 0.9226666666666666 | 3000 |
| 0.9228 | 3000 |
| 0.9229333333333334 | 3000 |
| 0.9230666666666667 | 3000 |
| 0.9232 | 3000 |
| 0.9233333333333333 | 3000 |
| 0.9234666666666667 | 3000 |
| 0.9236 | 3000 |
| 0.9237333333333333 | 3000 |
| 0.9238666666666666 | 3050 |
| 0.924 | 3050 |
| 0.9241333333333334 | 3050 |
| 0.9242666666666667 | 3050 |
| 0.9244 | 3050 |
| 0.9245333333333333 | 3050 |
| 0.9246666666666666 | 3050 |
| 0.9248 | 3050 |
| 0.9249333333333334 | 3050 |
| 0.9250666666666667 | 3050 |
| 0.9252 | 3050 |
| 0.9253333333333333 | 3050 |
| 0.9254666666666667 | 3100 |
| 0.9256 | 3100 |
| 0.9257333333333333 | 3100 |
| 0.9258666666666666 | 3100 |
| 0.926 | 3100 |
| 0.9261333333333334 | 3100 |
| 0.9262666666666667 | 3100 |
| 0.9264 | 3100 |
| 0.9265333333333333 | 3100 |
| 0.9266666666666666 | 3100 |
| 0.9268 | 3100 |
| 0.9269333333333334 | 3100 |
| 0.9270666666666667 | 3100 |
| 0.9272 | 3100 |
| 0.9273333333333333 | 3150 |
| 0.9274666666666667 | 3150 |
| 0.9276 | 3150 |
| 0.9277333333333333 | 3150 |
| 0.9278666666666666 | 3150 |
| 0.928 | 3150 |
| 0.9281333333333334 | 3150 |
| 0.9282666666666667 | 3150 |
| 0.9284 | 3150 |
| 0.9285333333333333 | 3150 |
| 0.9286666666666666 | 3200 |
| 0.9288 | 3200 |
| 0.9289333333333334 | 3200 |
| 0.9290666666666667 | 3200 |
| 0.9292 | 3200 |
| 0.9293333333333333 | 3200 |
| 0.9294666666666667 | 3200 |
| 0.9296 | 3250 |
| 0.9297333333333333 | 3250 |
| 0.9298666666666666 | 3250 |
| 0.93 | 3250 |
| 0.9301333333333334 | 3250 |
| 0.9302666666666667 | 3250 |
| 0.9304 | 3250 |
| 0.9305333333333333 | 3250 |
| 0.9306666666666666 | 3250 |
| 0.9308 | 3250 |
| 0.9309333333333333 | 3250 |
| 0.9310666666666667 | 3250 |
| 0.9312 | 3300 |
| 0.9313333333333333 | 3300 |
| 0.9314666666666667 | 3300 |
| 0.9316 | 3300 |
| 0.9317333333333333 | 3300 |
| 0.9318666666666666 | 3300 |
| 0.932 | 3300 |
| 0.9321333333333334 | 3300 |
| 0.9322666666666667 | 3300 |
| 0.9324 | 3350 |
| 0.9325333333333333 | 3350 |
| 0.9326666666666666 | 3350 |
| 0.9328 | 3350 |
| 0.9329333333333333 | 3350 |
| 0.9330666666666667 | 3350 |
| 0.9332 | 3350 |
| 0.9333333333333333 | 3350 |
| 0.9334666666666667 | 3350 |
| 0.9336 | 3350 |
| 0.9337333333333333 | 3350 |
| 0.9338666666666666 | 3350 |
| 0.934 | 3350 |
| 0.9341333333333334 | 3400 |
| 0.9342666666666667 | 3400 |
| 0.9344 | 3400 |
| 0.9345333333333333 | 3400 |
| 0.9346666666666666 | 3400 |
| 0.9348 | 3400 |
| 0.9349333333333333 | 3400 |
| 0.9350666666666667 | 3400 |
| 0.9352 | 3400 |
| 0.9353333333333333 | 3400 |
| 0.9354666666666667 | 3400 |
| 0.9356 | 3400 |
| 0.9357333333333333 | 3400 |
| 0.9358666666666666 | 3400 |
| 0.936 | 3400 |
| 0.9361333333333334 | 3400 |
| 0.9362666666666667 | 3400 |
| 0.9364 | 3400 |
| 0.9365333333333333 | 3450 |
| 0.9366666666666666 | 3450 |
| 0.9368 | 3450 |
| 0.9369333333333333 | 3450 |
| 0.9370666666666667 | 3450 |
| 0.9372 | 3450 |
| 0.9373333333333334 | 3450 |
| 0.9374666666666667 | 3450 |
| 0.9376 | 3450 |
| 0.9377333333333333 | 3450 |
| 0.9378666666666666 | 3450 |
| 0.938 | 3450 |
| 0.9381333333333334 | 3450 |
| 0.9382666666666667 | 3450 |
| 0.9384 | 3500 |
| 0.9385333333333333 | 3500 |
| 0.9386666666666666 | 3500 |
| 0.9388 | 3500 |
| 0.9389333333333333 | 3500 |
| 0.9390666666666667 | 3500 |
| 0.9392 | 3500 |
| 0.9393333333333334 | 3550 |
| 0.9394666666666667 | 3550 |
| 0.9396 | 3550 |
| 0.9397333333333333 | 3550 |
| 0.9398666666666666 | 3550 |
| 0.94 | 3550 |
| 0.9401333333333334 | 3550 |
| 0.9402666666666667 | 3550 |
| 0.9404 | 3550 |
| 0.9405333333333333 | 3550 |
| 0.9406666666666667 | 3600 |
| 0.9408 | 3600 |
| 0.9409333333333333 | 3600 |
| 0.9410666666666667 | 3600 |
| 0.9412 | 3600 |
| 0.9413333333333334 | 3600 |
| 0.9414666666666667 | 3600 |
| 0.9416 | 3600 |
| 0.9417333333333333 | 3650 |
| 0.9418666666666666 | 3650 |
| 0.942 | 3650 |
| 0.9421333333333334 | 3650 |
| 0.9422666666666667 | 3650 |
| 0.9424 | 3650 |
| 0.9425333333333333 | 3650 |
| 0.9426666666666667 | 3650 |
| 0.9428 | 3650 |
| 0.9429333333333333 | 3650 |
| 0.9430666666666667 | 3700 |
| 0.9432 | 3700 |
| 0.9433333333333334 | 3700 |
| 0.9434666666666667 | 3700 |
| 0.9436 | 3700 |
| 0.9437333333333333 | 3700 |
| 0.9438666666666666 | 3700 |
| 0.944 | 3700 |
| 0.9441333333333334 | 3750 |
| 0.9442666666666667 | 3750 |
| 0.9444 | 3750 |
| 0.9445333333333333 | 3750 |
| 0.9446666666666667 | 3750 |
| 0.9448 | 3750 |
| 0.9449333333333333 | 3750 |
| 0.9450666666666667 | 3750 |
| 0.9452 | 3750 |
| 0.9453333333333334 | 3750 |
| 0.9454666666666667 | 3750 |
| 0.9456 | 3750 |
| 0.9457333333333333 | 3800 |
| 0.9458666666666666 | 3800 |
| 0.946 | 3800 |
| 0.9461333333333334 | 3800 |
| 0.9462666666666667 | 3800 |
| 0.9464 | 3800 |
| 0.9465333333333333 | 3850 |
| 0.9466666666666667 | 3850 |
| 0.9468 | 3850 |
| 0.9469333333333333 | 3850 |
| 0.9470666666666666 | 3850 |
| 0.9472 | 3850 |
| 0.9473333333333334 | 3900 |
| 0.9474666666666667 | 3900 |
| 0.9476 | 3900 |
| 0.9477333333333333 | 3900 |
| 0.9478666666666666 | 3900 |
| 0.948 | 3900 |
| 0.9481333333333334 | 3900 |
| 0.9482666666666667 | 3950 |
| 0.9484 | 3950 |
| 0.9485333333333333 | 3950 |
| 0.9486666666666667 | 3950 |
| 0.9488 | 3950 |
| 0.9489333333333333 | 3950 |
| 0.9490666666666666 | 3950 |
| 0.9492 | 3950 |
| 0.9493333333333334 | 4000 |
| 0.9494666666666667 | 4000 |
| 0.9496 | 4050 |
| 0.9497333333333333 | 4050 |
| 0.9498666666666666 | 4050 |
| 0.95 | 4100 |
| 0.9501333333333334 | 4100 |
| 0.9502666666666667 | 4100 |
| 0.9504 | 4100 |
| 0.9505333333333333 | 4100 |
| 0.9506666666666667 | 4100 |
| 0.9508 | 4100 |
| 0.9509333333333333 | 4100 |
| 0.9510666666666666 | 4100 |
| 0.9512 | 4100 |
| 0.9513333333333334 | 4100 |
| 0.9514666666666667 | 4150 |
| 0.9516 | 4150 |
| 0.9517333333333333 | 4150 |
| 0.9518666666666666 | 4150 |
| 0.952 | 4150 |
| 0.9521333333333334 | 4150 |
| 0.9522666666666667 | 4150 |
| 0.9524 | 4150 |
| 0.9525333333333333 | 4150 |
| 0.9526666666666667 | 4150 |
| 0.9528 | 4200 |
| 0.9529333333333333 | 4200 |
| 0.9530666666666666 | 4200 |
| 0.9532 | 4200 |
| 0.9533333333333334 | 4200 |
| 0.9534666666666667 | 4200 |
| 0.9536 | 4200 |
| 0.9537333333333333 | 4250 |
| 0.9538666666666666 | 4250 |
| 0.954 | 4250 |
| 0.9541333333333334 | 4250 |
| 0.9542666666666667 | 4250 |
| 0.9544 | 4250 |
| 0.9545333333333333 | 4250 |
| 0.9546666666666667 | 4250 |
| 0.9548 | 4300 |
| 0.9549333333333333 | 4300 |
| 0.9550666666666666 | 4300 |
| 0.9552 | 4300 |
| 0.9553333333333334 | 4300 |
| 0.9554666666666667 | 4300 |
| 0.9556 | 4350 |
| 0.9557333333333333 | 4350 |
| 0.9558666666666666 | 4350 |
| 0.956 | 4350 |
| 0.9561333333333333 | 4350 |
| 0.9562666666666667 | 4400 |
| 0.9564 | 4400 |
| 0.9565333333333333 | 4400 |
| 0.9566666666666667 | 4400 |
| 0.9568 | 4400 |
| 0.9569333333333333 | 4450 |
| 0.9570666666666666 | 4450 |
| 0.9572 | 4450 |
| 0.9573333333333334 | 4450 |
| 0.9574666666666667 | 4450 |
| 0.9576 | 4450 |
| 0.9577333333333333 | 4450 |
| 0.9578666666666666 | 4500 |
| 0.958 | 4500 |
| 0.9581333333333333 | 4500 |
| 0.9582666666666667 | 4500 |
| 0.9584 | 4500 |
| 0.9585333333333333 | 4550 |
| 0.9586666666666667 | 4550 |
| 0.9588 | 4550 |
| 0.9589333333333333 | 4550 |
| 0.9590666666666666 | 4550 |
| 0.9592 | 4550 |
| 0.9593333333333334 | 4550 |
| 0.9594666666666667 | 4550 |
| 0.9596 | 4550 |
| 0.9597333333333333 | 4600 |
| 0.9598666666666666 | 4600 |
| 0.96 | 4650 |
| 0.9601333333333333 | 4650 |
| 0.9602666666666667 | 4650 |
| 0.9604 | 4650 |
| 0.9605333333333334 | 4650 |
| 0.9606666666666667 | 4650 |
| 0.9608 | 4650 |
| 0.9609333333333333 | 4650 |
| 0.9610666666666666 | 4700 |
| 0.9612 | 4700 |
| 0.9613333333333334 | 4700 |
| 0.9614666666666667 | 4700 |
| 0.9616 | 4700 |
| 0.9617333333333333 | 4700 |
| 0.9618666666666666 | 4750 |
| 0.962 | 4800 |
| 0.9621333333333333 | 4800 |
| 0.9622666666666667 | 4800 |
| 0.9624 | 4800 |
| 0.9625333333333334 | 4800 |
| 0.9626666666666667 | 4800 |
| 0.9628 | 4800 |
| 0.9629333333333333 | 4850 |
| 0.9630666666666666 | 4850 |
| 0.9632 | 4850 |
| 0.9633333333333334 | 4850 |
| 0.9634666666666667 | 4850 |
| 0.9636 | 4850 |
| 0.9637333333333333 | 4850 |
| 0.9638666666666666 | 4900 |
| 0.964 | 4900 |
| 0.9641333333333333 | 4900 |
| 0.9642666666666667 | 4900 |
| 0.9644 | 4900 |
| 0.9645333333333334 | 4900 |
| 0.9646666666666667 | 4900 |
| 0.9648 | 4900 |
| 0.9649333333333333 | 4950 |
| 0.9650666666666666 | 4950 |
| 0.9652 | 5000 |
| 0.9653333333333334 | 5000 |
| 0.9654666666666667 | 5000 |
| 0.9656 | 5000 |
| 0.9657333333333333 | 5000 |
| 0.9658666666666667 | 5000 |
| 0.966 | 5050 |
| 0.9661333333333333 | 5050 |
| 0.9662666666666667 | 5050 |
| 0.9664 | 5050 |
| 0.9665333333333334 | 5050 |
| 0.9666666666666667 | 5100 |
| 0.9668 | 5100 |
| 0.9669333333333333 | 5100 |
| 0.9670666666666666 | 5100 |
| 0.9672 | 5100 |
| 0.9673333333333334 | 5100 |
| 0.9674666666666667 | 5150 |
| 0.9676 | 5150 |
| 0.9677333333333333 | 5150 |
| 0.9678666666666667 | 5150 |
| 0.968 | 5200 |
| 0.9681333333333333 | 5200 |
| 0.9682666666666667 | 5200 |
| 0.9684 | 5200 |
| 0.9685333333333334 | 5200 |
| 0.9686666666666667 | 5200 |
| 0.9688 | 5200 |
| 0.9689333333333333 | 5250 |
| 0.9690666666666666 | 5250 |
| 0.9692 | 5250 |
| 0.9693333333333334 | 5250 |
| 0.9694666666666667 | 5250 |
| 0.9696 | 5250 |
| 0.9697333333333333 | 5250 |
| 0.9698666666666667 | 5250 |
| 0.97 | 5300 |
| 0.9701333333333333 | 5300 |
| 0.9702666666666667 | 5300 |
| 0.9704 | 5350 |
| 0.9705333333333334 | 5350 |
| 0.9706666666666667 | 5400 |
| 0.9708 | 5450 |
| 0.9709333333333333 | 5450 |
| 0.9710666666666666 | 5450 |
| 0.9712 | 5450 |
| 0.9713333333333334 | 5450 |
| 0.9714666666666667 | 5500 |
| 0.9716 | 5550 |
| 0.9717333333333333 | 5550 |
| 0.9718666666666667 | 5550 |
| 0.972 | 5550 |
| 0.9721333333333333 | 5550 |
| 0.9722666666666666 | 5550 |
| 0.9724 | 5550 |
| 0.9725333333333334 | 5550 |
| 0.9726666666666667 | 5550 |
| 0.9728 | 5600 |
| 0.9729333333333333 | 5600 |
| 0.9730666666666666 | 5650 |
| 0.9732 | 5650 |
| 0.9733333333333334 | 5650 |
| 0.9734666666666667 | 5650 |
| 0.9736 | 5700 |
| 0.9737333333333333 | 5700 |
| 0.9738666666666667 | 5750 |
| 0.974 | 5800 |
| 0.9741333333333333 | 5800 |
| 0.9742666666666666 | 5850 |
| 0.9744 | 5850 |
| 0.9745333333333334 | 5950 |
| 0.9746666666666667 | 5950 |
| 0.9748 | 5950 |
| 0.9749333333333333 | 6000 |
| 0.9750666666666666 | 6000 |
| 0.9752 | 6000 |
| 0.9753333333333334 | 6000 |
| 0.9754666666666667 | 6000 |
| 0.9756 | 6050 |
| 0.9757333333333333 | 6050 |
| 0.9758666666666667 | 6100 |
| 0.976 | 6150 |
| 0.9761333333333333 | 6150 |
| 0.9762666666666666 | 6150 |
| 0.9764 | 6150 |
| 0.9765333333333334 | 6200 |
| 0.9766666666666667 | 6200 |
| 0.9768 | 6200 |
| 0.9769333333333333 | 6200 |
| 0.9770666666666666 | 6300 |
| 0.9772 | 6300 |
| 0.9773333333333334 | 6350 |
| 0.9774666666666667 | 6350 |
| 0.9776 | 6350 |
| 0.9777333333333333 | 6350 |
| 0.9778666666666667 | 6350 |
| 0.978 | 6400 |
| 0.9781333333333333 | 6400 |
| 0.9782666666666666 | 6400 |
| 0.9784 | 6400 |
| 0.9785333333333334 | 6400 |
| 0.9786666666666667 | 6400 |
| 0.9788 | 6400 |
| 0.9789333333333333 | 6450 |
| 0.9790666666666666 | 6500 |
| 0.9792 | 6500 |
| 0.9793333333333333 | 6500 |
| 0.9794666666666667 | 6500 |
| 0.9796 | 6550 |
| 0.9797333333333333 | 6600 |
| 0.9798666666666667 | 6600 |
| 0.98 | 6600 |
| 0.9801333333333333 | 6600 |
| 0.9802666666666666 | 6600 |
| 0.9804 | 6650 |
| 0.9805333333333334 | 6650 |
| 0.9806666666666667 | 6650 |
| 0.9808 | 6700 |
| 0.9809333333333333 | 6700 |
| 0.9810666666666666 | 6700 |
| 0.9812 | 6750 |
| 0.9813333333333333 | 6800 |
| 0.9814666666666667 | 6900 |
| 0.9816 | 6900 |
| 0.9817333333333333 | 6900 |
| 0.9818666666666667 | 6950 |
| 0.982 | 7000 |
| 0.9821333333333333 | 7000 |
| 0.9822666666666666 | 7000 |
| 0.9824 | 7000 |
| 0.9825333333333334 | 7100 |
| 0.9826666666666667 | 7150 |
| 0.9828 | 7150 |
| 0.9829333333333333 | 7150 |
| 0.9830666666666666 | 7150 |
| 0.9832 | 7200 |
| 0.9833333333333333 | 7200 |
| 0.9834666666666667 | 7200 |
| 0.9836 | 7250 |
| 0.9837333333333333 | 7250 |
| 0.9838666666666667 | 7300 |
| 0.984 | 7300 |
| 0.9841333333333333 | 7300 |
| 0.9842666666666666 | 7400 |
| 0.9844 | 7400 |
| 0.9845333333333334 | 7400 |
| 0.9846666666666667 | 7400 |
| 0.9848 | 7450 |
| 0.9849333333333333 | 7450 |
| 0.9850666666666666 | 7450 |
| 0.9852 | 7450 |
| 0.9853333333333333 | 7500 |
| 0.9854666666666667 | 7500 |
| 0.9856 | 7500 |
| 0.9857333333333334 | 7500 |
| 0.9858666666666667 | 7600 |
| 0.986 | 7750 |
| 0.9861333333333333 | 7800 |
| 0.9862666666666666 | 7800 |
| 0.9864 | 7850 |
| 0.9865333333333334 | 7850 |
| 0.9866666666666667 | 7900 |
| 0.9868 | 7900 |
| 0.9869333333333333 | 7950 |
| 0.9870666666666666 | 8000 |
| 0.9872 | 8050 |
| 0.9873333333333333 | 8100 |
| 0.9874666666666667 | 8100 |
| 0.9876 | 8100 |
| 0.9877333333333334 | 8100 |
| 0.9878666666666667 | 8100 |
| 0.988 | 8200 |
| 0.9881333333333333 | 8250 |
| 0.9882666666666666 | 8250 |
| 0.9884 | 8250 |
| 0.9885333333333334 | 8300 |
| 0.9886666666666667 | 8400 |
| 0.9888 | 8450 |
| 0.9889333333333333 | 8450 |
| 0.9890666666666666 | 8500 |
| 0.9892 | 8550 |
| 0.9893333333333333 | 8650 |
| 0.9894666666666667 | 8650 |
| 0.9896 | 8750 |
| 0.9897333333333334 | 8800 |
| 0.9898666666666667 | 8850 |
| 0.99 | 8850 |
| 0.9901333333333333 | 8900 |
| 0.9902666666666666 | 8900 |
| 0.9904 | 8950 |
| 0.9905333333333334 | 9000 |
| 0.9906666666666667 | 9000 |
| 0.9908 | 9050 |
| 0.9909333333333333 | 9050 |
| 0.9910666666666667 | 9050 |
| 0.9912 | 9200 |
| 0.9913333333333333 | 9250 |
| 0.9914666666666667 | 9350 |
| 0.9916 | 9550 |
| 0.9917333333333334 | 9600 |
| 0.9918666666666667 | 9650 |
| 0.992 | 9650 |
| 0.9921333333333333 | 9700 |
| 0.9922666666666666 | 9750 |
| 0.9924 | 9850 |
| 0.9925333333333334 | 10000 |
| 0.9926666666666667 | 10100 |
| 0.9928 | 10300 |
| 0.9929333333333333 | 10500 |
| 0.9930666666666667 | 10650 |
| 0.9932 | 10650 |
| 0.9933333333333333 | 10800 |
| 0.9934666666666667 | 10950 |
| 0.9936 | 10950 |
| 0.9937333333333334 | 10950 |
| 0.9938666666666667 | 11000 |
| 0.994 | 11450 |
| 0.9941333333333333 | 11450 |
| 0.9942666666666666 | 11500 |
| 0.9944 | 11550 |
| 0.9945333333333334 | 11850 |
| 0.9946666666666667 | 11850 |
| 0.9948 | 11950 |
| 0.9949333333333333 | 11950 |
| 0.9950666666666667 | 12050 |
| 0.9952 | 12100 |
| 0.9953333333333333 | 12200 |
| 0.9954666666666667 | 12200 |
| 0.9956 | 12350 |
| 0.9957333333333334 | 12350 |
| 0.9958666666666667 | 12500 |
| 0.996 | 12600 |
| 0.9961333333333333 | 12650 |
| 0.9962666666666666 | 12750 |
| 0.9964 | 13050 |
| 0.9965333333333334 | 13300 |
| 0.9966666666666667 | 13350 |
| 0.9968 | 13500 |
| 0.9969333333333333 | 14250 |
| 0.9970666666666667 | 14400 |
| 0.9972 | 14450 |
| 0.9973333333333333 | 14650 |
| 0.9974666666666666 | 14900 |
| 0.9976 | 15100 |
| 0.9977333333333334 | 15250 |
| 0.9978666666666667 | 15400 |
| 0.998 | 15650 |
| 0.9981333333333333 | 15900 |
| 0.9982666666666666 | 17000 |
| 0.9984 | 17100 |
| 0.9985333333333334 | 17450 |
| 0.9986666666666667 | 18500 |
| 0.9988 | 18600 |
| 0.9989333333333333 | 18800 |
| 0.9990666666666667 | 20300 |
| 0.9992 | 20850 |
| 0.9993333333333333 | 22050 |
| 0.9994666666666666 | 22100 |
| 0.9996 | 22650 |
| 0.9997333333333334 | 22950 |
| 0.9998666666666667 | 27300 |